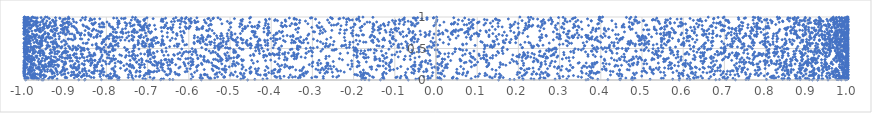
| Category | Series 0 |
|---|---|
| 0.15200554291350654 | 0 |
| -0.06729470641883747 | 0 |
| -0.457207894907006 | 0.001 |
| -0.16249678589111524 | 0.001 |
| -0.8527700189734067 | 0.001 |
| 0.9514669668381108 | 0.001 |
| 0.9134880477894776 | 0.001 |
| 0.9265163017025512 | 0.002 |
| -0.9956822485381334 | 0.002 |
| 0.36407005406179027 | 0.002 |
| 0.5902983247239353 | 0.002 |
| -0.5696850449446043 | 0.002 |
| -0.13486914578377363 | 0.003 |
| 0.9836824117989914 | 0.003 |
| -0.9552525360661354 | 0.003 |
| -0.8670972874772059 | 0.003 |
| 0.7267554239187516 | 0.003 |
| 0.4467624530858489 | 0.004 |
| 0.926587585128548 | 0.004 |
| -0.9566806299724488 | 0.004 |
| -0.9534150803421515 | 0.004 |
| 0.994329540349623 | 0.004 |
| 0.6789903417788856 | 0.005 |
| 0.976044050492543 | 0.005 |
| -0.6684093127094851 | 0.005 |
| -0.17243647579333232 | 0.005 |
| -0.812202762234995 | 0.005 |
| 0.9953782682390276 | 0.006 |
| 0.41713309477368044 | 0.006 |
| 0.973367425531701 | 0.006 |
| -0.9532398745212399 | 0.006 |
| -0.638567536494556 | 0.006 |
| 0.47718830438411675 | 0.007 |
| 0.9063104692916205 | 0.007 |
| 0.7523436664627461 | 0.007 |
| 0.8841233423088316 | 0.007 |
| 0.3689833570456053 | 0.007 |
| 0.8021992646769822 | 0.008 |
| 0.1899558450305855 | 0.008 |
| -0.7726503063247229 | 0.008 |
| 0.688052046204429 | 0.008 |
| -0.6463487301978702 | 0.008 |
| 0.7583651499772289 | 0.009 |
| -0.8515626191845961 | 0.009 |
| -0.7693314399857281 | 0.009 |
| 0.17927238001201656 | 0.009 |
| -0.18091652837159003 | 0.009 |
| 0.4767607671685933 | 0.01 |
| 0.21164829308590222 | 0.01 |
| 0.6164196356209262 | 0.01 |
| -0.43981105188865066 | 0.01 |
| -0.17349958479442149 | 0.01 |
| 0.9739553855503824 | 0.011 |
| 0.8417067337444467 | 0.011 |
| 0.39260704561174986 | 0.011 |
| 0.7049749452027674 | 0.011 |
| -0.7348397519038176 | 0.011 |
| 0.519681218191675 | 0.012 |
| 0.8582839120561189 | 0.012 |
| -0.01952415538513181 | 0.012 |
| -0.6875260524918024 | 0.012 |
| 0.4460547477197051 | 0.012 |
| 0.5744657663707007 | 0.013 |
| 0.9989707049015466 | 0.013 |
| 0.012505586525759253 | 0.013 |
| -0.9656287445153952 | 0.013 |
| 0.8577590364845594 | 0.013 |
| 0.4745384764904606 | 0.014 |
| 0.237883539134218 | 0.014 |
| -0.5945560326466847 | 0.014 |
| 0.28906759812849697 | 0.014 |
| -0.47379755829139836 | 0.014 |
| -0.420282766106121 | 0.015 |
| -0.0489888721854956 | 0.015 |
| -0.6663499840926943 | 0.015 |
| 0.980817108186996 | 0.015 |
| -0.9196999226275901 | 0.015 |
| -0.7052703570993165 | 0.016 |
| 0.8773446743058156 | 0.016 |
| 0.8537656608230865 | 0.016 |
| 0.7017771095955014 | 0.016 |
| -0.9646866245041967 | 0.016 |
| 0.6096549733429917 | 0.017 |
| 0.9927908912023397 | 0.017 |
| 0.9783927986566546 | 0.017 |
| -0.6614666187458014 | 0.017 |
| 0.4477940734845616 | 0.017 |
| 0.9389377133416301 | 0.018 |
| 0.3177598032660515 | 0.018 |
| 0.05154074463168796 | 0.018 |
| 0.2509742276300209 | 0.018 |
| -0.1264788760948081 | 0.018 |
| 0.9366700849924477 | 0.019 |
| -0.9403394818413594 | 0.019 |
| 0.6627235351862151 | 0.019 |
| 0.9940747553617163 | 0.019 |
| -0.9697481625498002 | 0.019 |
| 0.8981874868707405 | 0.02 |
| -0.9944582635667647 | 0.02 |
| -0.9778995356068275 | 0.02 |
| -0.5466504105362756 | 0.02 |
| 0.21070981335920916 | 0.02 |
| -0.042469812219032614 | 0.021 |
| -0.4099938201590565 | 0.021 |
| 0.23081644287241357 | 0.021 |
| 0.05019851648306504 | 0.021 |
| -0.5498718593116568 | 0.021 |
| 0.08539963563340248 | 0.022 |
| 0.839494049916666 | 0.022 |
| -0.9310702649036865 | 0.022 |
| -0.3772678541207172 | 0.022 |
| -0.9977352554488598 | 0.022 |
| 0.8447608608589396 | 0.023 |
| 0.9997401996471749 | 0.023 |
| -0.7114359825146417 | 0.023 |
| 0.9774827466976556 | 0.023 |
| -0.7893172746638099 | 0.023 |
| 0.9024401659278395 | 0.024 |
| 0.6264856888210802 | 0.024 |
| -0.7938193932467944 | 0.024 |
| -0.9753346244366259 | 0.024 |
| -0.2733692964261956 | 0.024 |
| 0.5913918603493773 | 0.025 |
| -0.01909160719645387 | 0.025 |
| 0.04000355691416215 | 0.025 |
| 0.8735798160067708 | 0.025 |
| 0.8965103087211107 | 0.025 |
| 0.9171234986518773 | 0.026 |
| 0.38013428353378076 | 0.026 |
| 0.8838862066301029 | 0.026 |
| 0.820447234335244 | 0.026 |
| 0.9904901917835967 | 0.026 |
| 0.5470219437786282 | 0.027 |
| 0.7209896343038159 | 0.027 |
| -0.46813466982067864 | 0.027 |
| 0.48259826748739476 | 0.027 |
| 0.9987958107081274 | 0.027 |
| -0.7876500442513381 | 0.028 |
| 0.3000711930845742 | 0.028 |
| 0.7589973713107336 | 0.028 |
| -0.5669741666103717 | 0.028 |
| 0.9817924067659626 | 0.028 |
| 0.9923958624850441 | 0.029 |
| 0.5517527594077928 | 0.029 |
| 0.26464821516489667 | 0.029 |
| -0.990271569611666 | 0.029 |
| 0.9560499169593414 | 0.029 |
| 0.999995290616038 | 0.03 |
| 0.9288263821255781 | 0.03 |
| 0.646763684074911 | 0.03 |
| -0.08683557155049913 | 0.03 |
| 0.007514187821513853 | 0.03 |
| 0.4608192533842199 | 0.031 |
| 0.009440279591735117 | 0.031 |
| -0.981885307109912 | 0.031 |
| 0.13658477507303166 | 0.031 |
| -0.9680449322410765 | 0.031 |
| -0.17075394007484615 | 0.032 |
| -0.9906759049416521 | 0.032 |
| -0.9808076918094027 | 0.032 |
| -0.013745064596319172 | 0.032 |
| -0.9897628876217685 | 0.032 |
| -0.5479261500261635 | 0.033 |
| 0.9904165313977236 | 0.033 |
| -0.5368766336459813 | 0.033 |
| 0.855535350528616 | 0.033 |
| -0.07114977440353441 | 0.033 |
| -0.8778382116814543 | 0.034 |
| -0.33429841034619817 | 0.034 |
| -0.6844107021421755 | 0.034 |
| 0.7553444835531498 | 0.034 |
| 0.8156401264155725 | 0.034 |
| 0.9995873305514806 | 0.035 |
| 0.2615329342568215 | 0.035 |
| -0.1297073342943431 | 0.035 |
| -0.3015156967961897 | 0.035 |
| 0.9860204818096939 | 0.035 |
| 0.039831710103254314 | 0.036 |
| 0.825022885472655 | 0.036 |
| 0.9959345563681103 | 0.036 |
| 0.008444380342214721 | 0.036 |
| -0.8961400581108921 | 0.036 |
| -0.5727866000112555 | 0.037 |
| 0.9497912454231978 | 0.037 |
| 0.0037221920611609223 | 0.037 |
| -0.7888718482164411 | 0.037 |
| 0.6250498462645815 | 0.037 |
| -0.1761192888328591 | 0.038 |
| 0.20178589647225514 | 0.038 |
| -0.8999774062146605 | 0.038 |
| 0.9936052757660404 | 0.038 |
| 0.16314236975189067 | 0.038 |
| 0.696307591907109 | 0.039 |
| -0.8304523700011781 | 0.039 |
| -0.17823800283327804 | 0.039 |
| -0.09717901977464624 | 0.039 |
| 0.15544600136109762 | 0.039 |
| 0.9692040633006136 | 0.04 |
| -0.9799758476792692 | 0.04 |
| -0.32963658117829264 | 0.04 |
| -0.7468144237129694 | 0.04 |
| 0.47642224336755695 | 0.04 |
| 0.25332043763107964 | 0.041 |
| 0.7081406799428411 | 0.041 |
| -0.35729111859728424 | 0.041 |
| -0.7692853893620255 | 0.041 |
| 0.6323955206902468 | 0.041 |
| 0.15356025933755202 | 0.042 |
| -0.8369282086158256 | 0.042 |
| -0.1517069528204616 | 0.042 |
| -0.9932727900169268 | 0.042 |
| -0.7375323011691443 | 0.042 |
| -0.9370754454055051 | 0.043 |
| -0.38628218106455 | 0.043 |
| -0.6940447274971672 | 0.043 |
| 0.3530984612708372 | 0.043 |
| 0.375201180033652 | 0.043 |
| 0.882950864524975 | 0.044 |
| -0.12752994132519133 | 0.044 |
| 0.6361994345702875 | 0.044 |
| -0.9291303658884452 | 0.044 |
| -0.9502462772000775 | 0.044 |
| -0.07159872386916356 | 0.045 |
| -0.2408612962908456 | 0.045 |
| -0.5152975120126371 | 0.045 |
| -0.3481507301175143 | 0.045 |
| 0.8116172776549053 | 0.045 |
| -0.513235844500652 | 0.046 |
| 0.04184616603785343 | 0.046 |
| 0.9999636777761698 | 0.046 |
| 0.9986662548244144 | 0.046 |
| -0.8988666861470648 | 0.046 |
| -0.46477693529315706 | 0.047 |
| -0.38860648129590375 | 0.047 |
| 0.1315808958574203 | 0.047 |
| -0.8605472347194846 | 0.047 |
| -0.9322234760082014 | 0.047 |
| -0.2892961469226578 | 0.048 |
| 0.9887644719647684 | 0.048 |
| 0.13030371351102982 | 0.048 |
| -0.9598430607328585 | 0.048 |
| 0.9840571701050298 | 0.048 |
| -0.09430699127895781 | 0.049 |
| 0.6993989647054774 | 0.049 |
| -0.15404826768985055 | 0.049 |
| 0.989906001182126 | 0.049 |
| 0.9285424581208492 | 0.049 |
| -0.5536414382694722 | 0.05 |
| -0.5301023882426361 | 0.05 |
| 0.9792577829487558 | 0.05 |
| -0.7912776669765876 | 0.05 |
| -0.7754830872495515 | 0.05 |
| 0.9954051495328374 | 0.051 |
| 0.813529896443113 | 0.051 |
| -0.9728723887340308 | 0.051 |
| 0.9858658266055774 | 0.051 |
| -0.5903067318735459 | 0.051 |
| -0.2932407017577964 | 0.052 |
| 0.9916573803177583 | 0.052 |
| 0.8315187661605866 | 0.052 |
| -0.34168216541745644 | 0.052 |
| 0.0955304911734684 | 0.052 |
| 0.985143473819114 | 0.053 |
| -0.5137538483603333 | 0.053 |
| 0.6136506294235653 | 0.053 |
| -0.7197686337404721 | 0.053 |
| 0.9714989492469824 | 0.053 |
| 0.3451227456873911 | 0.054 |
| -0.029822465491016557 | 0.054 |
| 0.666739520627784 | 0.054 |
| 0.9640563073393678 | 0.054 |
| -0.25029017441418866 | 0.054 |
| -0.8147929538459739 | 0.055 |
| 0.14292656960394026 | 0.055 |
| -0.3303565212064877 | 0.055 |
| -0.2735067385406875 | 0.055 |
| -0.9985438416385396 | 0.055 |
| -0.4823159021245709 | 0.056 |
| 0.8732292381506552 | 0.056 |
| 0.9918830957941455 | 0.056 |
| -0.8602740486774939 | 0.056 |
| -0.871314060899211 | 0.056 |
| 0.30819197148466293 | 0.057 |
| 0.8743513339397397 | 0.057 |
| -0.37910194188453966 | 0.057 |
| -0.9750258799323148 | 0.057 |
| -0.998979722403871 | 0.057 |
| -0.9824233196088272 | 0.058 |
| 0.761071534818674 | 0.058 |
| 0.10221716776215511 | 0.058 |
| -0.9727105781018953 | 0.058 |
| -0.019593936233441935 | 0.058 |
| -0.08499381266489192 | 0.059 |
| 0.32186782398357355 | 0.059 |
| 0.996817062798009 | 0.059 |
| -0.368881325183188 | 0.059 |
| -0.8702494641891024 | 0.059 |
| -0.7285178916340969 | 0.06 |
| -0.18303607617225306 | 0.06 |
| -0.391153575413294 | 0.06 |
| 0.8903219829473091 | 0.06 |
| 0.29906144569186577 | 0.06 |
| 0.4510699459938845 | 0.061 |
| 0.02038245913264294 | 0.061 |
| 0.9472857459235432 | 0.061 |
| -0.7958861615130816 | 0.061 |
| -0.8002146110352245 | 0.061 |
| 0.816076575828821 | 0.062 |
| 0.9162385313734118 | 0.062 |
| 0.6429700366009142 | 0.062 |
| -0.7831943026149888 | 0.062 |
| 0.7349401340391255 | 0.062 |
| 0.4993427640476728 | 0.063 |
| 0.20868458772589357 | 0.063 |
| 0.589651797478654 | 0.063 |
| 0.9872825900320957 | 0.063 |
| -0.9792733920506946 | 0.063 |
| -0.8735817308111709 | 0.064 |
| 0.27190247393661215 | 0.064 |
| -0.9470436711349711 | 0.064 |
| -0.9251010100190863 | 0.064 |
| -0.8414898381129964 | 0.064 |
| -0.8476395786414201 | 0.065 |
| -0.570592137479725 | 0.065 |
| -0.3205538614444382 | 0.065 |
| -0.23630578422560589 | 0.065 |
| 0.8198186265475367 | 0.065 |
| -0.9995502703727126 | 0.066 |
| -0.7083613039261053 | 0.066 |
| 0.7966081339129375 | 0.066 |
| -0.9750807036673955 | 0.066 |
| 0.07290380057626196 | 0.066 |
| -0.9607831689056601 | 0.067 |
| 0.4438319994355396 | 0.067 |
| 0.9979888110375198 | 0.067 |
| -0.009606686519030735 | 0.067 |
| 0.9060259572943348 | 0.067 |
| -0.774274686287651 | 0.068 |
| 0.8468634740076612 | 0.068 |
| 0.9765387152222564 | 0.068 |
| 0.9548945736137882 | 0.068 |
| 0.9999800632975381 | 0.068 |
| -0.776863971652107 | 0.069 |
| -0.7182884232896616 | 0.069 |
| -0.4688426909294744 | 0.069 |
| -0.16108536958919295 | 0.069 |
| 0.5892424782707807 | 0.069 |
| -0.8860656277596021 | 0.07 |
| 0.11864343189452409 | 0.07 |
| 0.5996871628764314 | 0.07 |
| 0.1575928579571168 | 0.07 |
| -0.8570220969852361 | 0.07 |
| 0.33364581160921336 | 0.071 |
| 0.7819476807583776 | 0.071 |
| 0.9289936091311981 | 0.071 |
| -0.9985903069104906 | 0.071 |
| -0.8677178477024161 | 0.071 |
| 0.9799308499581032 | 0.072 |
| 0.370598431015267 | 0.072 |
| -0.4127542634529316 | 0.072 |
| -0.73823160601569 | 0.072 |
| 0.9366298372453912 | 0.072 |
| 0.9085940259726202 | 0.073 |
| 0.8923242459183516 | 0.073 |
| 0.9117534475745115 | 0.073 |
| -0.17612835987145758 | 0.073 |
| 0.9733090774197437 | 0.073 |
| 0.5558208625125576 | 0.074 |
| -0.8537762998544086 | 0.074 |
| -0.32973850036516417 | 0.074 |
| 0.9722040141367632 | 0.074 |
| 0.9881321580997177 | 0.074 |
| -0.0747782523190453 | 0.075 |
| -0.999082151695842 | 0.075 |
| 0.7834076377906578 | 0.075 |
| -0.19021692491782577 | 0.075 |
| -0.9567314125336641 | 0.075 |
| -0.4996646226468618 | 0.076 |
| 0.8747094392750433 | 0.076 |
| 0.2707100450932198 | 0.076 |
| -0.7961418771324437 | 0.076 |
| -0.7075240282151682 | 0.076 |
| 0.6104880190362773 | 0.077 |
| -0.9531662317661262 | 0.077 |
| -0.9851144785820289 | 0.077 |
| -0.779825873760862 | 0.077 |
| -0.6242512499876961 | 0.077 |
| -0.6515613006162935 | 0.078 |
| 0.6289941445472835 | 0.078 |
| 0.1235347334798558 | 0.078 |
| 0.27448130451856906 | 0.078 |
| 0.21354153469655426 | 0.078 |
| -0.8071748086551663 | 0.079 |
| 0.8568350330356603 | 0.079 |
| -0.12919633075894077 | 0.079 |
| -0.4265157523725611 | 0.079 |
| -0.3536056643327415 | 0.079 |
| 0.6916741223133892 | 0.08 |
| -0.49198368912490625 | 0.08 |
| -0.9783505585230332 | 0.08 |
| 0.42349628938159206 | 0.08 |
| 0.7255804706419816 | 0.08 |
| -0.9087142765204478 | 0.081 |
| 0.9999993125662935 | 0.081 |
| 0.8712334052172768 | 0.081 |
| -0.5556378815186701 | 0.081 |
| -0.5709591997288698 | 0.081 |
| 0.9772622466731428 | 0.082 |
| 0.8406362422037144 | 0.082 |
| -0.883738888693354 | 0.082 |
| -0.9515784700531837 | 0.082 |
| -0.7463882312988026 | 0.082 |
| 0.4817954923062849 | 0.083 |
| -0.4164755037821291 | 0.083 |
| 0.9999925313332694 | 0.083 |
| 0.6747954682008176 | 0.083 |
| -0.1929261561104739 | 0.083 |
| -0.8767611966968388 | 0.084 |
| 0.7143330423439077 | 0.084 |
| 0.9999334792786507 | 0.084 |
| 0.9658438549822527 | 0.084 |
| -0.9970663013030775 | 0.084 |
| -0.18116024158593796 | 0.085 |
| -0.5623410242350688 | 0.085 |
| 0.9659625428596904 | 0.085 |
| 0.919565392108718 | 0.085 |
| 0.25232715406480705 | 0.085 |
| 0.4507338868424042 | 0.086 |
| -0.6230756266672847 | 0.086 |
| -0.4319385974889556 | 0.086 |
| 0.06438133544048895 | 0.086 |
| -0.6547980172339415 | 0.086 |
| -0.9629935568112706 | 0.087 |
| -0.5598091501082233 | 0.087 |
| -0.32457976442578385 | 0.087 |
| 0.9961609050488258 | 0.087 |
| -0.8702548690807884 | 0.087 |
| -0.19706086257729333 | 0.088 |
| 0.7744309212728546 | 0.088 |
| 0.19714377731920038 | 0.088 |
| 0.9971174249944807 | 0.088 |
| 0.21587759621000194 | 0.088 |
| -0.87990032719354 | 0.089 |
| -0.5617749549601522 | 0.089 |
| -0.5200087352889526 | 0.089 |
| -0.53605629078407 | 0.089 |
| -0.41251113128068834 | 0.089 |
| 0.7522003405411509 | 0.09 |
| 0.9901811405902565 | 0.09 |
| -0.1766372657042872 | 0.09 |
| -0.9787891877092243 | 0.09 |
| -0.9185839508568863 | 0.09 |
| -0.8161785871431491 | 0.091 |
| -0.5935914124314042 | 0.091 |
| 0.9145774237071655 | 0.091 |
| -0.627509133514206 | 0.091 |
| 0.8038703577057449 | 0.091 |
| 0.6750626232794807 | 0.092 |
| -0.8546651849478603 | 0.092 |
| 0.1454818192919588 | 0.092 |
| 0.763095117273583 | 0.092 |
| 0.014206122746725175 | 0.092 |
| 0.23298809798580053 | 0.093 |
| -0.9677926771455969 | 0.093 |
| 0.7048263390871231 | 0.093 |
| -0.9842762400655948 | 0.093 |
| -0.5330801057002608 | 0.093 |
| -0.696128282270287 | 0.094 |
| -0.9038491955133985 | 0.094 |
| 0.9574838973738187 | 0.094 |
| 0.2331906724322441 | 0.094 |
| 0.24334549251201307 | 0.094 |
| 0.9160230581674079 | 0.095 |
| -0.6315821086218336 | 0.095 |
| -0.9913842249534869 | 0.095 |
| 0.8431342766131519 | 0.095 |
| -0.9999929513104286 | 0.095 |
| -0.9720241831638156 | 0.096 |
| 0.1541947007517045 | 0.096 |
| 0.2708950425263061 | 0.096 |
| 0.7322145214585726 | 0.096 |
| 0.8978033393759274 | 0.096 |
| 0.43999561881501525 | 0.097 |
| -0.9996631025520747 | 0.097 |
| -0.9008708160604773 | 0.097 |
| 0.10566627949509405 | 0.097 |
| -0.7018619256203216 | 0.097 |
| 0.9910351891638693 | 0.098 |
| -0.47374195196723734 | 0.098 |
| 0.24453536639703302 | 0.098 |
| -0.12933664212904303 | 0.098 |
| -0.6461253641833897 | 0.098 |
| -0.7900802071854653 | 0.099 |
| 0.5948665723551356 | 0.099 |
| -0.17557576217851495 | 0.099 |
| 0.29490747150678637 | 0.099 |
| 0.38746355203198013 | 0.099 |
| -0.16471929200096347 | 0.1 |
| -0.8477058140761996 | 0.1 |
| 0.4461314481474594 | 0.1 |
| 0.5276268520546221 | 0.1 |
| -0.9313427201118116 | 0.1 |
| 0.8528792294441154 | 0.101 |
| -0.9995901304809907 | 0.101 |
| 0.9226780721640367 | 0.101 |
| -0.7807498305828439 | 0.101 |
| -0.16731708940352216 | 0.101 |
| 0.3648826097892715 | 0.102 |
| -0.32248628902571824 | 0.102 |
| 0.5987927498352328 | 0.102 |
| 0.5972720329240442 | 0.102 |
| -0.12074010012110739 | 0.102 |
| 0.056211595853009916 | 0.103 |
| -0.46578726103869483 | 0.103 |
| -0.3209076295496852 | 0.103 |
| 0.6239106090579823 | 0.103 |
| -0.39873191554264503 | 0.103 |
| 0.805310439201009 | 0.104 |
| 0.37409377438868546 | 0.104 |
| 0.26002974489150993 | 0.104 |
| 0.949208511755526 | 0.104 |
| 0.010270767530360521 | 0.104 |
| 0.05195372542019304 | 0.105 |
| -0.31526155309598597 | 0.105 |
| -0.053840532643819286 | 0.105 |
| 0.7883858630254181 | 0.105 |
| -0.8301100982496503 | 0.105 |
| 0.9619841344439007 | 0.106 |
| -0.2694269238471688 | 0.106 |
| 0.11943704309789187 | 0.106 |
| 0.6958655616990349 | 0.106 |
| -0.4504981351434188 | 0.106 |
| 0.8857542227347812 | 0.107 |
| 0.4791641629793495 | 0.107 |
| 0.8544132249960414 | 0.107 |
| -0.49675935333069454 | 0.107 |
| 0.8866833144160422 | 0.107 |
| -0.7039620440052591 | 0.108 |
| 0.5966313669059187 | 0.108 |
| -0.9603672767686251 | 0.108 |
| -0.43616421464853217 | 0.108 |
| -0.9265587864960504 | 0.108 |
| -0.864336488701309 | 0.109 |
| -0.8330074654461809 | 0.109 |
| -0.3939928542180877 | 0.109 |
| -0.9751841758770414 | 0.109 |
| -0.9898228456959115 | 0.109 |
| -0.4745923177770302 | 0.11 |
| 0.6193895958912731 | 0.11 |
| 0.07586059084124909 | 0.11 |
| 0.5898162073811104 | 0.11 |
| 0.995736531612083 | 0.11 |
| 0.005070732055159198 | 0.111 |
| 0.382779446095069 | 0.111 |
| 0.21835122530417062 | 0.111 |
| 0.7781555862582136 | 0.111 |
| -0.740959784788151 | 0.111 |
| -0.8926072303191953 | 0.112 |
| 0.9784488982042228 | 0.112 |
| 0.48649839919886323 | 0.112 |
| -0.17127906814581056 | 0.112 |
| 0.06622554505273807 | 0.112 |
| 0.9532644071968214 | 0.113 |
| 0.01205271911842901 | 0.113 |
| 0.3548944277737863 | 0.113 |
| 0.8539388847853441 | 0.113 |
| 0.6577061835395653 | 0.113 |
| 0.3899127571903628 | 0.114 |
| -0.5316614641556597 | 0.114 |
| 0.9374488376549801 | 0.114 |
| -0.8121844533669196 | 0.114 |
| -0.6988435284405575 | 0.114 |
| 0.9895468525683838 | 0.115 |
| -0.17540223859254123 | 0.115 |
| 0.5113405963561651 | 0.115 |
| -0.9292995593063901 | 0.115 |
| 0.8272344948516098 | 0.115 |
| 0.9977526229374029 | 0.116 |
| 0.20326825703662915 | 0.116 |
| 0.999504316934493 | 0.116 |
| 0.9875578405375403 | 0.116 |
| -0.05875891666099174 | 0.116 |
| -0.9121357123770274 | 0.117 |
| -0.2816142791234976 | 0.117 |
| -0.40595849439420234 | 0.117 |
| -0.0734620715952091 | 0.117 |
| 0.7508709103063206 | 0.117 |
| -0.007764354604507592 | 0.118 |
| 0.9939802034982864 | 0.118 |
| 0.3763927045836738 | 0.118 |
| -0.45091813793673136 | 0.118 |
| 0.8616369910613839 | 0.118 |
| 0.9698182509494483 | 0.119 |
| 0.917404441767918 | 0.119 |
| 0.57512741578149 | 0.119 |
| 0.5531529485842672 | 0.119 |
| 0.8779042201772065 | 0.119 |
| 0.6301315185137388 | 0.12 |
| -0.8359266402729303 | 0.12 |
| -0.9864399764729587 | 0.12 |
| 0.22031620068896549 | 0.12 |
| -0.9311674371738974 | 0.12 |
| 0.19828770305195909 | 0.121 |
| -0.18333180163133694 | 0.121 |
| 0.04999149753037228 | 0.121 |
| -0.5857999665368839 | 0.121 |
| -0.5253517680656843 | 0.121 |
| -0.6335101648389785 | 0.122 |
| 0.39540920433294846 | 0.122 |
| -0.12604574400652846 | 0.122 |
| -0.8322214802889819 | 0.122 |
| 0.6481809625961988 | 0.122 |
| -0.2631765642036307 | 0.123 |
| -0.9999343830367574 | 0.123 |
| -0.8655987589079299 | 0.123 |
| 0.5241356089861754 | 0.123 |
| -0.2516435227299641 | 0.123 |
| 0.26586655798648123 | 0.124 |
| -0.5108304864528274 | 0.124 |
| 0.25586320838023013 | 0.124 |
| -0.9991591622885619 | 0.124 |
| -0.728240936173308 | 0.124 |
| -0.18360322844121743 | 0.125 |
| 0.5449741279326391 | 0.125 |
| -0.22272923370839387 | 0.125 |
| -0.8842771185610253 | 0.125 |
| 0.9642167065336659 | 0.125 |
| -0.999896161776765 | 0.126 |
| 0.9074541924283668 | 0.126 |
| -0.6865051337749445 | 0.126 |
| -0.8055355790882134 | 0.126 |
| -0.8792885787731178 | 0.126 |
| -0.38394255919964926 | 0.127 |
| 0.3923328283563205 | 0.127 |
| 0.6648106476926616 | 0.127 |
| -0.44844864565198117 | 0.127 |
| 0.6213722375254517 | 0.127 |
| 0.7419221868059753 | 0.128 |
| -0.693931050859834 | 0.128 |
| -0.3161333504646908 | 0.128 |
| 0.8831825875070396 | 0.128 |
| -0.4871303735492991 | 0.128 |
| -0.9585920493995753 | 0.129 |
| 0.9997332021512092 | 0.129 |
| 0.974760051288472 | 0.129 |
| 0.07700075731502798 | 0.129 |
| -0.9816210786479778 | 0.129 |
| -0.3119014473305545 | 0.13 |
| -0.7791038894869172 | 0.13 |
| -0.9986128451232724 | 0.13 |
| -0.45085712870481004 | 0.13 |
| -0.691928184420031 | 0.13 |
| -0.9199550845933732 | 0.131 |
| -0.7191622726855984 | 0.131 |
| -0.7183959789188665 | 0.131 |
| -0.6087489756131284 | 0.131 |
| -0.9095380268603496 | 0.131 |
| -0.3801962267956301 | 0.132 |
| -0.02990469371800099 | 0.132 |
| 0.23719931450298562 | 0.132 |
| -0.9572700174734652 | 0.132 |
| 0.9115292807417448 | 0.132 |
| -0.6587769181284743 | 0.133 |
| -0.7430113571771896 | 0.133 |
| -0.9999889590791263 | 0.133 |
| 0.9999403702594736 | 0.133 |
| 0.42966768345997 | 0.133 |
| -0.6774420574889818 | 0.134 |
| -0.6436204186465908 | 0.134 |
| 0.6978335069078397 | 0.134 |
| 0.3732023969668722 | 0.134 |
| 0.9613418952394274 | 0.134 |
| 0.9973407468529657 | 0.135 |
| -0.265672325639758 | 0.135 |
| 0.508019272920948 | 0.135 |
| 0.970770255159919 | 0.135 |
| 0.7140578797830235 | 0.135 |
| -0.8497825911789766 | 0.136 |
| -0.9433140221243175 | 0.136 |
| 0.8611862769268123 | 0.136 |
| -0.0235369205481259 | 0.136 |
| -0.6042189516393949 | 0.136 |
| 0.49992759894552447 | 0.137 |
| -0.7187480781572783 | 0.137 |
| -0.8289011742436361 | 0.137 |
| -0.9200786112847822 | 0.137 |
| -0.04177397182704788 | 0.137 |
| -0.8112134521430183 | 0.138 |
| 0.6688048709500105 | 0.138 |
| -0.6832462475258405 | 0.138 |
| 0.4233994226027002 | 0.138 |
| -0.9314724227747986 | 0.138 |
| 0.35281580209055957 | 0.139 |
| -0.8586161945062235 | 0.139 |
| -0.6953595744681424 | 0.139 |
| -0.9490919732058307 | 0.139 |
| 0.6773522456340532 | 0.139 |
| 0.7075097203498415 | 0.14 |
| 0.9969308084970426 | 0.14 |
| 0.9895801662331574 | 0.14 |
| 0.9406371836960613 | 0.14 |
| 0.853222926662725 | 0.14 |
| -0.4357714448326787 | 0.141 |
| -0.9080644844849562 | 0.141 |
| -0.9999488325459668 | 0.141 |
| -0.998689037465923 | 0.141 |
| -0.9362663222190525 | 0.141 |
| -0.8156174764972797 | 0.142 |
| -0.39832623495470165 | 0.142 |
| -0.988510746049836 | 0.142 |
| -0.2383125016985921 | 0.142 |
| 0.8950779320753817 | 0.142 |
| -0.05152858022179746 | 0.143 |
| 0.9712997435537004 | 0.143 |
| 0.7309847829533244 | 0.143 |
| -0.901206659427746 | 0.143 |
| -0.743247629972312 | 0.143 |
| -0.696832326102722 | 0.144 |
| 0.3215704939009859 | 0.144 |
| -0.231534414273964 | 0.144 |
| 0.3778568076281953 | 0.144 |
| 0.5844869519328366 | 0.144 |
| 0.7215692747487084 | 0.145 |
| -0.02168277708544574 | 0.145 |
| -0.8220415759119347 | 0.145 |
| 0.8961541995322099 | 0.145 |
| 0.9300245113770391 | 0.145 |
| 0.9980265765072999 | 0.146 |
| -0.9809518408838459 | 0.146 |
| -0.43340078329480036 | 0.146 |
| -0.6978082703945245 | 0.146 |
| 0.6900523227585309 | 0.146 |
| 0.9937434526089296 | 0.147 |
| 0.01687073447718537 | 0.147 |
| -0.9975905694066957 | 0.147 |
| -0.7263326307567016 | 0.147 |
| -0.8420293064690113 | 0.147 |
| 0.5055572256143499 | 0.148 |
| -0.9998836638993834 | 0.148 |
| -0.32611237291575446 | 0.148 |
| 0.9762061977164852 | 0.148 |
| 0.8466831958959131 | 0.148 |
| 0.9990125636282222 | 0.149 |
| 0.7186486760964899 | 0.149 |
| 0.6831951876214162 | 0.149 |
| -0.5800801500471113 | 0.149 |
| -0.6722583419831204 | 0.149 |
| 0.6011403291368737 | 0.15 |
| -0.7817326834219005 | 0.15 |
| -0.9852442175533161 | 0.15 |
| -0.5409414909582946 | 0.15 |
| 0.9979282077789665 | 0.15 |
| 0.9672449133488962 | 0.151 |
| -0.4147786969792971 | 0.151 |
| -0.33041382923512946 | 0.151 |
| 0.9747411176200381 | 0.151 |
| -0.7540893925396579 | 0.151 |
| -0.9749033480714273 | 0.152 |
| 0.9152244830221392 | 0.152 |
| 0.44523778589193835 | 0.152 |
| -0.38140768200825825 | 0.152 |
| -0.1118557014332514 | 0.152 |
| 0.7748125409668026 | 0.153 |
| -0.11257222225127407 | 0.153 |
| 0.3248928322623353 | 0.153 |
| -0.958351882349448 | 0.153 |
| -0.6441882316104058 | 0.153 |
| 0.2146735832029177 | 0.154 |
| 0.8537769242945675 | 0.154 |
| -0.5141953619757924 | 0.154 |
| 0.4129848443465836 | 0.154 |
| 0.14566373688453946 | 0.154 |
| -0.9841131621907009 | 0.155 |
| -0.4613569725354441 | 0.155 |
| -0.984539647625937 | 0.155 |
| 0.7816685506866332 | 0.155 |
| -0.9880609499136808 | 0.155 |
| 0.8837764605319973 | 0.156 |
| -0.986388817736277 | 0.156 |
| 0.525979824666584 | 0.156 |
| -0.852685702626393 | 0.156 |
| 0.9850035301222413 | 0.156 |
| -0.9780250032536891 | 0.157 |
| 0.8245564689563217 | 0.157 |
| 0.9291754825479902 | 0.157 |
| -0.8284493130308728 | 0.157 |
| 0.7442854503316376 | 0.157 |
| 0.3032705367556713 | 0.158 |
| -0.17628557474217388 | 0.158 |
| -0.2861687278551995 | 0.158 |
| 0.8544208252452098 | 0.158 |
| -0.6635713109601075 | 0.158 |
| 0.9998099508146268 | 0.159 |
| -0.3933181167988689 | 0.159 |
| -0.2799249200950284 | 0.159 |
| 0.3035412523851955 | 0.159 |
| -0.053316893385814634 | 0.159 |
| 0.4688462597729867 | 0.16 |
| 0.5234156532198435 | 0.16 |
| -0.8726411510867085 | 0.16 |
| -0.34039405828129815 | 0.16 |
| 0.8514612727708899 | 0.16 |
| -0.9061124995642474 | 0.161 |
| 0.8404355743916335 | 0.161 |
| -0.9621798097652496 | 0.161 |
| 0.004325382085794387 | 0.161 |
| -0.2725024095087304 | 0.161 |
| -0.900171797818135 | 0.162 |
| 0.44568688461957073 | 0.162 |
| -0.9994782764054323 | 0.162 |
| 0.8675748140773186 | 0.162 |
| 0.9494862969779738 | 0.162 |
| 0.9179099097030817 | 0.163 |
| 0.9983311574424983 | 0.163 |
| -0.14453303774860718 | 0.163 |
| -0.9345708023371476 | 0.163 |
| 0.8861720134112042 | 0.163 |
| 0.89931946010283 | 0.164 |
| -0.9225934509225424 | 0.164 |
| -0.11071846790033825 | 0.164 |
| -0.8089903074289283 | 0.164 |
| -0.5092773505355105 | 0.164 |
| 0.9923607359610476 | 0.165 |
| -0.10300435795444866 | 0.165 |
| 0.5398179312821829 | 0.165 |
| -0.9888909234405212 | 0.165 |
| 0.4643235566533005 | 0.165 |
| -0.562486912629507 | 0.166 |
| 0.5282152024068791 | 0.166 |
| -0.8695353632813203 | 0.166 |
| 0.990508518686053 | 0.166 |
| 0.9474853173701173 | 0.166 |
| -0.9877351807610866 | 0.167 |
| 0.9996901756833992 | 0.167 |
| 0.9374290583511427 | 0.167 |
| -0.39052577383761067 | 0.167 |
| -0.9509054863054461 | 0.167 |
| 0.742900165832919 | 0.168 |
| 0.9998823856386865 | 0.168 |
| -0.37803414875970637 | 0.168 |
| 0.862656476443971 | 0.168 |
| -0.9427442840352075 | 0.168 |
| 0.13636003928756815 | 0.169 |
| -0.999304149336043 | 0.169 |
| 0.7562859747261631 | 0.169 |
| 0.6710412393773214 | 0.169 |
| 0.7859073254880706 | 0.169 |
| 0.05073264558082375 | 0.17 |
| 0.4034117822704167 | 0.17 |
| 0.6398651071729611 | 0.17 |
| -0.039781686576822135 | 0.17 |
| 0.9996635464223323 | 0.17 |
| 0.24990542822048223 | 0.171 |
| -0.5188613243806333 | 0.171 |
| -0.241622776683234 | 0.171 |
| 0.8974463231212013 | 0.171 |
| -0.8958403407488139 | 0.171 |
| -0.023447577571800878 | 0.172 |
| -0.7502963089808984 | 0.172 |
| -0.8576942882352664 | 0.172 |
| -0.1564161828788407 | 0.172 |
| 0.7300857758812942 | 0.172 |
| -0.9531088733370922 | 0.173 |
| 0.9715406982297017 | 0.173 |
| -0.2913187417023805 | 0.173 |
| -0.20806811239140705 | 0.173 |
| 0.4100048637567286 | 0.173 |
| 0.31688464388075654 | 0.174 |
| -0.6448160989211447 | 0.174 |
| -0.05576309939426028 | 0.174 |
| -0.0686712928397669 | 0.174 |
| 0.41294006997612975 | 0.174 |
| 0.8294925389789755 | 0.175 |
| -0.2540118412825352 | 0.175 |
| -0.5434615833451404 | 0.175 |
| -0.47103504168668836 | 0.175 |
| 0.06693893513362281 | 0.175 |
| 0.22094605580376683 | 0.176 |
| -0.9857798799365761 | 0.176 |
| -0.786873874038636 | 0.176 |
| 0.970339051549954 | 0.176 |
| -0.43852471318590747 | 0.176 |
| -0.04226478765891742 | 0.177 |
| 0.9263358651155972 | 0.177 |
| -0.9041005712243068 | 0.177 |
| 0.9868695839957501 | 0.177 |
| -0.2611876047447645 | 0.177 |
| -0.9979531035021778 | 0.178 |
| 0.8828243210569222 | 0.178 |
| 0.7328639722134217 | 0.178 |
| 0.6177621353319463 | 0.178 |
| -0.9994528898306207 | 0.178 |
| 0.8812784765521288 | 0.179 |
| 0.9850056420087893 | 0.179 |
| -0.5964012409439052 | 0.179 |
| 0.9714266849819119 | 0.179 |
| 0.225635939792563 | 0.179 |
| 0.27070779683866436 | 0.18 |
| -0.6047359639964813 | 0.18 |
| -0.5138552378915028 | 0.18 |
| 0.20750154407091104 | 0.18 |
| 0.22583086538232958 | 0.18 |
| 0.5706894340848729 | 0.181 |
| -0.3234458393156258 | 0.181 |
| -0.12168118150209548 | 0.181 |
| 0.7988212177672898 | 0.181 |
| 0.5643025562505888 | 0.181 |
| 0.5193503449467118 | 0.182 |
| -0.6496321908797483 | 0.182 |
| -0.5270522624922824 | 0.182 |
| -0.4523198835500896 | 0.182 |
| -0.9230064482833276 | 0.182 |
| -0.8081239302492531 | 0.183 |
| 0.954170877861055 | 0.183 |
| -0.4307306395358553 | 0.183 |
| -0.09374610212901154 | 0.183 |
| 0.7426125558190517 | 0.183 |
| -0.8524968153911302 | 0.184 |
| -0.783543280859647 | 0.184 |
| 0.20544576743826712 | 0.184 |
| 0.2945538639094297 | 0.184 |
| 0.9609453782602307 | 0.184 |
| 0.6514462700990113 | 0.185 |
| 0.005637489087085259 | 0.185 |
| 0.917413386060247 | 0.185 |
| 0.5037388143815296 | 0.185 |
| -0.9999506218546321 | 0.185 |
| -0.676098366640503 | 0.186 |
| -0.966915840106801 | 0.186 |
| -0.9954396729379301 | 0.186 |
| -0.965285635882863 | 0.186 |
| -0.7657379421286362 | 0.186 |
| -0.3554771362712493 | 0.187 |
| 0.6213589224384142 | 0.187 |
| 0.5720393274567726 | 0.187 |
| -0.9702772575142563 | 0.187 |
| -0.9987787027849421 | 0.187 |
| 0.7448703031692955 | 0.188 |
| -0.9520215332888711 | 0.188 |
| 0.8859872646476583 | 0.188 |
| -0.26777893838879346 | 0.188 |
| -0.8821548462346175 | 0.188 |
| -0.9986210913676974 | 0.189 |
| 0.5345720889738464 | 0.189 |
| -0.9989912805529206 | 0.189 |
| -0.27604800821070513 | 0.189 |
| -0.40781807290677136 | 0.189 |
| 0.235561888431525 | 0.19 |
| 0.9288267142140726 | 0.19 |
| -0.7333750478020141 | 0.19 |
| -0.6242316328139743 | 0.19 |
| -0.873121478191789 | 0.19 |
| -0.8785875600667538 | 0.191 |
| -0.8734873226698883 | 0.191 |
| 0.842898067870057 | 0.191 |
| -0.8667240254119474 | 0.191 |
| 0.9868635250896055 | 0.191 |
| -0.962492194624209 | 0.192 |
| 0.9846034756160523 | 0.192 |
| 0.5717218913317711 | 0.192 |
| 0.5549472612222 | 0.192 |
| -0.9816301990974396 | 0.192 |
| 0.9886161633264339 | 0.193 |
| 0.021098781435157466 | 0.193 |
| 0.35420171098965847 | 0.193 |
| 0.6840749932909705 | 0.193 |
| -0.829085751804335 | 0.193 |
| -0.009480642905621029 | 0.194 |
| 0.9398913655723328 | 0.194 |
| 0.9810374041759222 | 0.194 |
| 0.027138315656602498 | 0.194 |
| 0.850410631079194 | 0.194 |
| -0.9788137848015946 | 0.195 |
| 0.8900869024461635 | 0.195 |
| 0.6320535321784524 | 0.195 |
| -0.6641039140908126 | 0.195 |
| -0.9847744892198287 | 0.195 |
| 0.9998399911683374 | 0.196 |
| -0.3562591895625615 | 0.196 |
| 0.7282779040356592 | 0.196 |
| -0.9044137243814147 | 0.196 |
| 0.33109687663318405 | 0.196 |
| -0.5309658262313646 | 0.197 |
| -0.00023205511105970343 | 0.197 |
| 0.004352190164153017 | 0.197 |
| 0.7484182581912877 | 0.197 |
| 0.991150055611394 | 0.197 |
| 0.2983629451465 | 0.198 |
| 0.5420365394525092 | 0.198 |
| 0.946742476864419 | 0.198 |
| -0.718905345926719 | 0.198 |
| -0.5316458458090906 | 0.198 |
| -0.7188183591857741 | 0.199 |
| 0.3767918135910846 | 0.199 |
| 0.36639491724748985 | 0.199 |
| 0.6666450252464263 | 0.199 |
| 0.9972036828703003 | 0.199 |
| -0.7072025545089715 | 0.2 |
| 0.6480366736134359 | 0.2 |
| -0.9999771711409767 | 0.2 |
| -0.7341836329300797 | 0.2 |
| -0.8763342111457753 | 0.2 |
| 0.33260264200526696 | 0.201 |
| 0.998936026229491 | 0.201 |
| -0.3527213753817552 | 0.201 |
| -0.9501458141014046 | 0.201 |
| 0.947972591358834 | 0.201 |
| 0.6889714633338029 | 0.202 |
| -0.7387317657444622 | 0.202 |
| -0.32128025003027477 | 0.202 |
| 0.7839868015184657 | 0.202 |
| 0.9984362760258528 | 0.202 |
| 0.15406031160505068 | 0.203 |
| -0.4496375404397828 | 0.203 |
| -0.5810047012086887 | 0.203 |
| -0.35430830557221543 | 0.203 |
| -0.9919099795375854 | 0.203 |
| 0.8341610907354193 | 0.204 |
| 0.9961826469763085 | 0.204 |
| -0.9635155777130499 | 0.204 |
| 0.9421922240543744 | 0.204 |
| 0.9805875923712752 | 0.204 |
| -0.36747981893796444 | 0.205 |
| -0.8276015141703209 | 0.205 |
| -0.16008758610005275 | 0.205 |
| 0.5195221239832972 | 0.205 |
| -0.9052819895328111 | 0.205 |
| 0.9993020754762507 | 0.206 |
| -0.667788228836391 | 0.206 |
| -0.8793787797860396 | 0.206 |
| 0.629261243871904 | 0.206 |
| -0.003350427006342512 | 0.206 |
| -0.3477484807877504 | 0.207 |
| -0.46799747950218656 | 0.207 |
| -0.03587491270336742 | 0.207 |
| -0.8237714889446427 | 0.207 |
| -0.621055252017031 | 0.207 |
| 0.381587992042933 | 0.208 |
| 0.7809743054641165 | 0.208 |
| 0.986191409204079 | 0.208 |
| -0.15632314394999844 | 0.208 |
| -0.9287021686712411 | 0.208 |
| -0.9647119416420624 | 0.209 |
| 0.28747196525957225 | 0.209 |
| 0.6616866268824784 | 0.209 |
| -0.5019292383944632 | 0.209 |
| 0.08588487598026427 | 0.209 |
| -0.19138255201758458 | 0.21 |
| -0.9847502466443541 | 0.21 |
| -0.11250244903145522 | 0.21 |
| 0.25349584133119707 | 0.21 |
| -0.9981843660973749 | 0.21 |
| -0.8862206174587263 | 0.211 |
| -0.05967696508088221 | 0.211 |
| 0.6174791025387928 | 0.211 |
| -0.9836943326930464 | 0.211 |
| 0.12337939414946997 | 0.211 |
| 0.2974224187245177 | 0.212 |
| -0.5350193672067496 | 0.212 |
| -0.9456136938332649 | 0.212 |
| -0.9559917646266067 | 0.212 |
| 0.9940585477878628 | 0.212 |
| 0.912686735139828 | 0.213 |
| -0.41127170779713956 | 0.213 |
| -0.9983345649388278 | 0.213 |
| -0.5344274608484193 | 0.213 |
| -0.08535399375012867 | 0.213 |
| 0.40797887327060034 | 0.214 |
| -0.24817209052303063 | 0.214 |
| 0.0602067995198587 | 0.214 |
| 0.9542766244815886 | 0.214 |
| -0.2677803109735502 | 0.214 |
| -0.939776435225388 | 0.215 |
| -0.7788697832240478 | 0.215 |
| 0.9791823788739306 | 0.215 |
| -0.9169730764336997 | 0.215 |
| 0.6052657958206188 | 0.215 |
| 0.9975249868429497 | 0.216 |
| 0.9990123538763512 | 0.216 |
| -0.9458326470583185 | 0.216 |
| -0.8678048568028628 | 0.216 |
| -0.20382120214077382 | 0.216 |
| 0.6730611484742344 | 0.217 |
| -0.30010690295451886 | 0.217 |
| 0.7369265686912493 | 0.217 |
| 0.37238523345748753 | 0.217 |
| 0.4340604983071124 | 0.217 |
| -0.9346307714509173 | 0.218 |
| 0.845397132752174 | 0.218 |
| 0.30596651225626426 | 0.218 |
| 0.02444522274433313 | 0.218 |
| 0.8513680940133842 | 0.218 |
| 0.3607713775189273 | 0.219 |
| 0.953518668440525 | 0.219 |
| -0.3799751492372966 | 0.219 |
| -0.5803258777576831 | 0.219 |
| -0.7443005960963612 | 0.219 |
| -0.2566484594458605 | 0.22 |
| -0.3616169984391811 | 0.22 |
| -0.9992518028038221 | 0.22 |
| -0.5113540039891435 | 0.22 |
| 0.4709800232606103 | 0.22 |
| 0.12537153755383892 | 0.221 |
| 0.6905254796127813 | 0.221 |
| -0.9997309758128897 | 0.221 |
| -0.051480762193332585 | 0.221 |
| 0.3578066728037838 | 0.221 |
| -0.18996484550786008 | 0.222 |
| 0.8440564708214968 | 0.222 |
| -0.9972571968928784 | 0.222 |
| -0.05095650891765565 | 0.222 |
| -0.1363022836765506 | 0.222 |
| 0.014063902836048655 | 0.223 |
| 0.5883785611609791 | 0.223 |
| -0.49432876529313874 | 0.223 |
| -0.12802589386262989 | 0.223 |
| 0.8366268826923712 | 0.223 |
| -0.608753984099832 | 0.224 |
| 0.9456895853339793 | 0.224 |
| -0.13955344223802035 | 0.224 |
| 0.999991468735193 | 0.224 |
| 0.4413451380823835 | 0.224 |
| -0.5388871175921633 | 0.225 |
| 0.995292317118397 | 0.225 |
| 0.8623223826221766 | 0.225 |
| 0.9971515378094199 | 0.225 |
| 0.2761824226603593 | 0.225 |
| 0.8824993947914473 | 0.226 |
| -0.8243498618069672 | 0.226 |
| -0.14131548191109564 | 0.226 |
| -0.2631816324249905 | 0.226 |
| 0.9363859245948253 | 0.226 |
| 0.9997844330337486 | 0.227 |
| -0.48665072267740955 | 0.227 |
| 0.6051461512452406 | 0.227 |
| -0.9517298153818953 | 0.227 |
| -0.18637087199776123 | 0.227 |
| 0.9124835625308709 | 0.228 |
| -0.7576597740392146 | 0.228 |
| -0.8863857503803675 | 0.228 |
| -0.6767336757061193 | 0.228 |
| -0.9397525962482604 | 0.228 |
| 0.5644472023993885 | 0.229 |
| -0.8111241558387239 | 0.229 |
| 0.9997470836441036 | 0.229 |
| -0.7429106419610835 | 0.229 |
| -0.5945479602710793 | 0.229 |
| 0.9023232725660851 | 0.23 |
| -0.7365506394980808 | 0.23 |
| -0.8285674805617909 | 0.23 |
| 0.9931357918387571 | 0.23 |
| -0.9712751718051083 | 0.23 |
| -0.5417058399214288 | 0.231 |
| 0.5793467678212916 | 0.231 |
| -0.9764916197718831 | 0.231 |
| -0.8383047602481672 | 0.231 |
| 0.8861012211259088 | 0.231 |
| -0.6506327198472255 | 0.232 |
| -0.6828289119001132 | 0.232 |
| 0.8081361489945103 | 0.232 |
| 0.21235791663280312 | 0.232 |
| -0.7451342519245687 | 0.232 |
| 0.09275544957149727 | 0.233 |
| -0.1145001939303087 | 0.233 |
| -0.5771226006371346 | 0.233 |
| -0.37436654660701907 | 0.233 |
| 0.45021609292873505 | 0.233 |
| -0.9161675626188058 | 0.234 |
| 0.4363948770395141 | 0.234 |
| -0.05477635988383078 | 0.234 |
| 0.16960752708266197 | 0.234 |
| 0.8577931505305427 | 0.234 |
| 0.7244555484986737 | 0.235 |
| -0.9999865493525216 | 0.235 |
| -0.9565541400188472 | 0.235 |
| -0.03601360721821974 | 0.235 |
| -0.2862040190569143 | 0.235 |
| 0.9029354954121417 | 0.236 |
| 0.3262703948961798 | 0.236 |
| -0.8282843931896035 | 0.236 |
| 0.9946834465016079 | 0.236 |
| 0.6153330728944219 | 0.236 |
| 0.6899387416185342 | 0.237 |
| 0.9983379423993278 | 0.237 |
| -0.6868292626298577 | 0.237 |
| -0.9253463497038831 | 0.237 |
| -0.9357048740379624 | 0.237 |
| 0.47805303350462564 | 0.238 |
| -0.854273989785701 | 0.238 |
| -0.03971453246925073 | 0.238 |
| -0.8662021293085996 | 0.238 |
| -0.7166235711109279 | 0.238 |
| 0.379659060926113 | 0.239 |
| 0.9989866710024765 | 0.239 |
| 0.9022203903961857 | 0.239 |
| 0.02369993708565709 | 0.239 |
| -0.47081047543171395 | 0.239 |
| -0.21363747966971683 | 0.24 |
| -0.7144218607963447 | 0.24 |
| 0.09634775205465824 | 0.24 |
| 0.2555804668038143 | 0.24 |
| -0.8790772160761242 | 0.24 |
| 0.568934761371211 | 0.241 |
| -0.9193046525909127 | 0.241 |
| -0.6463510582111274 | 0.241 |
| 0.12792838404278872 | 0.241 |
| 0.6768772890103774 | 0.241 |
| 0.799209048012209 | 0.242 |
| -0.999651221387513 | 0.242 |
| -0.9025544047487035 | 0.242 |
| 0.8909805628169117 | 0.242 |
| -0.9793051056949938 | 0.242 |
| -0.9985455757255757 | 0.243 |
| -0.6666220586961069 | 0.243 |
| 0.00812792728244907 | 0.243 |
| 0.7702942739291608 | 0.243 |
| -0.6317576924251598 | 0.243 |
| -0.3075694222786445 | 0.244 |
| -0.05106681337099841 | 0.244 |
| 0.5991702281779089 | 0.244 |
| -0.3663144814355549 | 0.244 |
| 0.9795896350519828 | 0.244 |
| -0.6628549308099416 | 0.245 |
| 0.985174201661539 | 0.245 |
| -0.5898729026856975 | 0.245 |
| -0.9942668986676768 | 0.245 |
| 0.9894856166360909 | 0.245 |
| 0.7695667504985559 | 0.246 |
| 0.4884357593092478 | 0.246 |
| -0.567714096299435 | 0.246 |
| -0.26296202002483204 | 0.246 |
| -0.7080053994458988 | 0.246 |
| 0.1569755255340433 | 0.247 |
| 0.46758526782224774 | 0.247 |
| 0.8254129118798 | 0.247 |
| 0.16265879815317796 | 0.247 |
| -0.688240252915396 | 0.247 |
| 0.9629921261320712 | 0.248 |
| 0.9999204749921033 | 0.248 |
| -0.7207144351500845 | 0.248 |
| -0.01191922338493761 | 0.248 |
| -0.9314561767601202 | 0.248 |
| -0.7422036525743523 | 0.249 |
| -0.5916570594533227 | 0.249 |
| -0.8536626179809763 | 0.249 |
| 0.6045713126015984 | 0.249 |
| -0.9479698750157874 | 0.249 |
| 0.9425044844510259 | 0.25 |
| 0.3853953328169521 | 0.25 |
| 0.9020018390255661 | 0.25 |
| 0.7477681988919754 | 0.25 |
| -0.38420849367039955 | 0.25 |
| -0.8216073621973288 | 0.251 |
| 0.8928904593279395 | 0.251 |
| -0.9634889642114823 | 0.251 |
| 0.2660896459173286 | 0.251 |
| 0.4208373910327044 | 0.251 |
| -0.6102640140233379 | 0.252 |
| 0.027903848262768073 | 0.252 |
| 0.8617391701139246 | 0.252 |
| -0.6615918706258643 | 0.252 |
| 0.7785416113982304 | 0.252 |
| -0.9393087032989065 | 0.253 |
| -0.9828272690893755 | 0.253 |
| 0.8332538163410859 | 0.253 |
| -0.48932988046424297 | 0.253 |
| -0.961497953060933 | 0.253 |
| -0.7505650887035452 | 0.254 |
| 0.8715239030758934 | 0.254 |
| 0.8504773774783807 | 0.254 |
| -0.8004615062064082 | 0.254 |
| -0.9920768477935801 | 0.254 |
| -0.981713930941451 | 0.255 |
| -0.9972617599742559 | 0.255 |
| 0.9484419000213702 | 0.255 |
| -0.49352915722914736 | 0.255 |
| -0.479524603200313 | 0.255 |
| -0.2039484335746857 | 0.256 |
| 0.504462242912291 | 0.256 |
| 0.47607577691163394 | 0.256 |
| -0.5199546243227886 | 0.256 |
| 0.5116373696319932 | 0.256 |
| 0.41299418610468175 | 0.257 |
| -0.9769361092423368 | 0.257 |
| 0.6004308957064234 | 0.257 |
| 0.7819014760865375 | 0.257 |
| -0.9018458647464739 | 0.257 |
| 0.6111120820829448 | 0.258 |
| -0.899029606482495 | 0.258 |
| 0.9473812025906223 | 0.258 |
| -0.12077506902688924 | 0.258 |
| -0.7932556984314265 | 0.258 |
| 0.8259360138476376 | 0.259 |
| -0.6774825820442452 | 0.259 |
| 0.8208265991844668 | 0.259 |
| 0.9999444940175722 | 0.259 |
| -0.999198243892106 | 0.259 |
| -0.8588182440492711 | 0.26 |
| -0.9754848316144666 | 0.26 |
| 0.8467060782721648 | 0.26 |
| -0.9817331701127544 | 0.26 |
| 0.1975723310498214 | 0.26 |
| -0.8360425568485644 | 0.261 |
| 0.997553399848777 | 0.261 |
| 0.836277372384627 | 0.261 |
| -0.8760229451175052 | 0.261 |
| 0.6475361810079661 | 0.261 |
| 0.003208777654649027 | 0.262 |
| 0.8835938728861815 | 0.262 |
| 0.9957339154777187 | 0.262 |
| 0.9878649296337352 | 0.262 |
| 0.9214834815591154 | 0.262 |
| 0.910102558250259 | 0.263 |
| 0.3789403216232743 | 0.263 |
| -0.27972834728578166 | 0.263 |
| 0.0127498755673003 | 0.263 |
| -0.019500687303457637 | 0.263 |
| 0.7640125651081728 | 0.264 |
| 0.9586558928090156 | 0.264 |
| 0.9987438620596225 | 0.264 |
| 0.7294713279651285 | 0.264 |
| 0.8147437346093943 | 0.264 |
| -0.6009254091658658 | 0.265 |
| 0.5719106999021564 | 0.265 |
| -0.5694086200451801 | 0.265 |
| -0.9404298056580889 | 0.265 |
| -0.6736737219802986 | 0.265 |
| -0.3005473679689502 | 0.266 |
| 0.40552120581098716 | 0.266 |
| 0.21256653552355026 | 0.266 |
| -0.8375427875150437 | 0.266 |
| 0.9859049664097315 | 0.266 |
| 0.12823072176836778 | 0.267 |
| 0.3450143189420941 | 0.267 |
| 0.2783460797156825 | 0.267 |
| -0.4433599986408159 | 0.267 |
| -0.8989542522104096 | 0.267 |
| 0.25473402423400243 | 0.268 |
| -0.26228898484819957 | 0.268 |
| 0.48026406792491555 | 0.268 |
| 0.7993220849901188 | 0.268 |
| -0.2646540381259571 | 0.268 |
| -0.7788469587521808 | 0.269 |
| 0.5395885899304168 | 0.269 |
| 0.9941058589529832 | 0.269 |
| 0.9985523915190408 | 0.269 |
| -0.96042924147051 | 0.269 |
| 0.3644967955822671 | 0.27 |
| 0.9469143910858893 | 0.27 |
| -0.28747913801701536 | 0.27 |
| -0.5444740149151518 | 0.27 |
| 0.6053290071203227 | 0.27 |
| 0.8374268843415889 | 0.271 |
| 0.9014136773073875 | 0.271 |
| -0.11235114348882706 | 0.271 |
| -0.6675052657311843 | 0.271 |
| 0.8950360061099681 | 0.271 |
| 0.38474635746382474 | 0.272 |
| 0.9357706930877335 | 0.272 |
| -0.12172048635828563 | 0.272 |
| 0.6179807675320127 | 0.272 |
| 0.6682062641718551 | 0.272 |
| 0.8988525050967272 | 0.273 |
| -0.765688566055992 | 0.273 |
| 0.2555906611160715 | 0.273 |
| 0.17958859656205975 | 0.273 |
| 0.9996572285992015 | 0.273 |
| -0.9994103744978425 | 0.274 |
| 0.06880498951557272 | 0.274 |
| 0.9980601962046104 | 0.274 |
| 0.9213434511386274 | 0.274 |
| -0.9995675673715125 | 0.274 |
| -0.48327533700724473 | 0.275 |
| 0.15597261140808788 | 0.275 |
| 0.7678734209769185 | 0.275 |
| 0.3476710881302466 | 0.275 |
| 0.905672787100615 | 0.275 |
| 0.9946829285595112 | 0.276 |
| -0.0363949779768367 | 0.276 |
| 0.48999172174226596 | 0.276 |
| 0.9981171265584217 | 0.276 |
| -0.8345717784194934 | 0.276 |
| 0.3895403012524884 | 0.277 |
| -0.7637789336468621 | 0.277 |
| -0.1869104724829281 | 0.277 |
| -0.612213121767156 | 0.277 |
| -0.6399906573127081 | 0.277 |
| -0.9345898379816461 | 0.278 |
| 0.5674203536178394 | 0.278 |
| 0.8037000040871514 | 0.278 |
| 0.9256420586983216 | 0.278 |
| -0.652478073998467 | 0.278 |
| -0.8204891088929376 | 0.279 |
| -0.9984484855124436 | 0.279 |
| 0.99529259618984 | 0.279 |
| -0.6423754507875625 | 0.279 |
| -0.6733018236965962 | 0.279 |
| -0.726882156302499 | 0.28 |
| 0.9886140200343625 | 0.28 |
| -0.693121293991856 | 0.28 |
| 0.9997580112556711 | 0.28 |
| 0.7514541765013112 | 0.28 |
| 0.07288840257267501 | 0.281 |
| -0.9326235218713742 | 0.281 |
| 0.39099316782785454 | 0.281 |
| 0.7521605683593796 | 0.281 |
| -0.7140558613809601 | 0.281 |
| -0.9834842895096138 | 0.282 |
| -0.6791495177991511 | 0.282 |
| -0.9970973349216199 | 0.282 |
| -0.6925053679408245 | 0.282 |
| 0.9970403780486766 | 0.282 |
| 0.7601001358336298 | 0.283 |
| -0.9385263414056874 | 0.283 |
| -0.9637887236460745 | 0.283 |
| 0.08594105373546891 | 0.283 |
| 0.7416458597469006 | 0.283 |
| 0.5884915789304382 | 0.284 |
| 0.7366899714349873 | 0.284 |
| -0.551157185818601 | 0.284 |
| 0.12220821011997772 | 0.284 |
| 0.10108029091543237 | 0.284 |
| 0.7458541628527291 | 0.285 |
| -0.9993293693702434 | 0.285 |
| -0.051478104635419304 | 0.285 |
| -0.025721714637674087 | 0.285 |
| 0.9601681909602855 | 0.285 |
| 0.8457808057200924 | 0.286 |
| -0.7262226137517642 | 0.286 |
| 0.48995874087033475 | 0.286 |
| -0.29874749198953865 | 0.286 |
| -0.9292511030765964 | 0.286 |
| -0.1087885034797635 | 0.287 |
| 0.9442937691876272 | 0.287 |
| -0.169023660985271 | 0.287 |
| 0.46263611845793223 | 0.287 |
| -0.89981897698351 | 0.287 |
| -0.9850050902823543 | 0.288 |
| -0.8679778704674499 | 0.288 |
| -0.9820328503222068 | 0.288 |
| -0.9267080568159703 | 0.288 |
| 0.9718570916237947 | 0.288 |
| 0.015539145779813471 | 0.289 |
| 0.23610362515628439 | 0.289 |
| 0.8136145654493788 | 0.289 |
| -0.9355120555535092 | 0.289 |
| -0.5898060683361566 | 0.289 |
| -0.7658803878117728 | 0.29 |
| -0.9060511912023504 | 0.29 |
| -0.3907825734647418 | 0.29 |
| 0.24726512155007088 | 0.29 |
| -0.5568653991171939 | 0.29 |
| -0.7902217343991578 | 0.291 |
| 0.5527316464249797 | 0.291 |
| -0.8026448759838798 | 0.291 |
| -0.5949850839793756 | 0.291 |
| 0.860623817361265 | 0.291 |
| -0.5918953484607967 | 0.292 |
| 0.19510792269129568 | 0.292 |
| 0.7865813857443608 | 0.292 |
| 0.2893114578705992 | 0.292 |
| 0.914890596847063 | 0.292 |
| 0.9809683061364726 | 0.293 |
| -0.03353396338139568 | 0.293 |
| -0.9227473961859662 | 0.293 |
| -0.2493895702872004 | 0.293 |
| 0.650545430797147 | 0.293 |
| -0.8158187284619982 | 0.294 |
| 0.8979650920458367 | 0.294 |
| -0.43327002892173516 | 0.294 |
| -0.6980140425124054 | 0.294 |
| 0.8493106993341153 | 0.294 |
| -0.6455512151860356 | 0.295 |
| 0.828052640861239 | 0.295 |
| -0.7715770808686151 | 0.295 |
| 0.26499609322370365 | 0.295 |
| 0.6505798895894257 | 0.295 |
| -0.18984420629499182 | 0.296 |
| -0.9892906967928431 | 0.296 |
| 0.9132899603967453 | 0.296 |
| -0.4912561102621139 | 0.296 |
| -0.9578754007594564 | 0.296 |
| 0.1886621093433326 | 0.297 |
| -0.843184148679706 | 0.297 |
| -0.5275685331720934 | 0.297 |
| -0.10859034388946512 | 0.297 |
| -0.12838486731260845 | 0.297 |
| -0.965291151538922 | 0.298 |
| -0.6827042642191217 | 0.298 |
| -0.9999525301357362 | 0.298 |
| 0.5560620422110513 | 0.298 |
| 0.2812796889176936 | 0.298 |
| 0.6431692590267054 | 0.299 |
| 0.8137374462647537 | 0.299 |
| 0.804073477803453 | 0.299 |
| 0.23771537357069214 | 0.299 |
| -0.5224235353591595 | 0.299 |
| 0.6731202960812106 | 0.3 |
| -0.9085478153305827 | 0.3 |
| -0.562017287757294 | 0.3 |
| 0.7958006158342952 | 0.3 |
| 0.8882428366077949 | 0.3 |
| 0.5065514536361986 | 0.301 |
| -0.8885336462667464 | 0.301 |
| 0.9850015004390897 | 0.301 |
| 0.9021667815975352 | 0.301 |
| 0.6490929123042614 | 0.301 |
| 0.9939801157044857 | 0.302 |
| -0.9269874967683335 | 0.302 |
| -0.8827904338904934 | 0.302 |
| 0.8272435912541944 | 0.302 |
| 0.9998313889078291 | 0.302 |
| -0.8527439979963881 | 0.303 |
| -0.7027997212332555 | 0.303 |
| 0.3237887141020676 | 0.303 |
| 0.8767712723650479 | 0.303 |
| 0.6808452694781582 | 0.303 |
| -0.7865301015914231 | 0.304 |
| 0.08200795797426211 | 0.304 |
| -0.9499483292303244 | 0.304 |
| -0.4703769768946402 | 0.304 |
| -0.9324636946584314 | 0.304 |
| -0.015034950729724477 | 0.305 |
| -0.014334454071039227 | 0.305 |
| 0.46898257813985433 | 0.305 |
| 0.059315722126434094 | 0.305 |
| -0.20483891539449997 | 0.305 |
| -0.9813993909554467 | 0.306 |
| -0.9574038430991875 | 0.306 |
| 0.20915729654530132 | 0.306 |
| -0.1359412110389197 | 0.306 |
| 0.43912019674880504 | 0.306 |
| 0.980745240211271 | 0.307 |
| -0.8718316811533343 | 0.307 |
| -0.5084656726627312 | 0.307 |
| -0.4137658091281008 | 0.307 |
| -0.024869179470339054 | 0.307 |
| 0.9747223587430188 | 0.308 |
| 0.9982837595000288 | 0.308 |
| 0.06090860391230249 | 0.308 |
| -0.8080847344141403 | 0.308 |
| -0.9298074491065907 | 0.308 |
| -0.6670152959964062 | 0.309 |
| 0.24696265086035954 | 0.309 |
| 0.03555185507333738 | 0.309 |
| 0.4095827237082975 | 0.309 |
| -0.5537253036259953 | 0.309 |
| 0.9135993387041815 | 0.31 |
| 0.8132133920965071 | 0.31 |
| 0.6058918587451192 | 0.31 |
| -0.834559521964871 | 0.31 |
| 0.4571637331230178 | 0.31 |
| -0.9996003038136706 | 0.311 |
| -0.8287948807185046 | 0.311 |
| -0.7423259499900254 | 0.311 |
| 0.5944112845569004 | 0.311 |
| 0.9227030406572034 | 0.311 |
| -0.8274991427448873 | 0.312 |
| 0.7176969367436726 | 0.312 |
| -0.8393742709234187 | 0.312 |
| 0.9667590671594496 | 0.312 |
| 0.7988539163773399 | 0.312 |
| -0.9326991674433566 | 0.313 |
| -0.44723854232384985 | 0.313 |
| -0.8466941212658002 | 0.313 |
| 0.9141541588915919 | 0.313 |
| -0.2838139771445704 | 0.313 |
| -0.9914590389155797 | 0.314 |
| 0.9809112110839054 | 0.314 |
| 0.12378749059806285 | 0.314 |
| 0.1222470388181441 | 0.314 |
| 0.8341766368853676 | 0.314 |
| -0.46747336217719954 | 0.315 |
| 0.8873231702681921 | 0.315 |
| -0.5305670408118905 | 0.315 |
| -0.7207540918200966 | 0.315 |
| 0.9991707487434768 | 0.315 |
| 0.9997718214763981 | 0.316 |
| 0.8644748551867847 | 0.316 |
| -0.5055244917031617 | 0.316 |
| -0.4012176413422967 | 0.316 |
| 0.5086876622841973 | 0.316 |
| -0.7131899304762053 | 0.317 |
| -0.9181196441395947 | 0.317 |
| 0.43269769172652783 | 0.317 |
| -0.9745936548512775 | 0.317 |
| -0.5638448057512855 | 0.317 |
| 0.695312681894299 | 0.318 |
| -0.36204898297062366 | 0.318 |
| 0.7474795774089767 | 0.318 |
| 0.9853707959219319 | 0.318 |
| -0.14858284975816796 | 0.318 |
| -0.9801909389118562 | 0.319 |
| 0.9175182713348942 | 0.319 |
| -0.10815780139682524 | 0.319 |
| -0.9786345427696078 | 0.319 |
| 0.5236487764951819 | 0.319 |
| -0.6402422938083459 | 0.32 |
| -0.6485449987054372 | 0.32 |
| -0.3680339412811993 | 0.32 |
| -0.9826514160578561 | 0.32 |
| -0.7318501155147367 | 0.32 |
| 0.4993622025621733 | 0.321 |
| 0.4748695202539145 | 0.321 |
| -0.8167670456471601 | 0.321 |
| -0.5631269338790814 | 0.321 |
| -0.22724405942020323 | 0.321 |
| -0.6564399469789673 | 0.322 |
| 0.8508136824907074 | 0.322 |
| 0.9438152339942042 | 0.322 |
| 0.44674650225322377 | 0.322 |
| -0.6584361608017723 | 0.322 |
| 0.9357836803860701 | 0.323 |
| -0.522401074421326 | 0.323 |
| 0.8735420785509646 | 0.323 |
| -0.5187378870010259 | 0.323 |
| 0.6279338184412684 | 0.323 |
| 0.9445914529202339 | 0.324 |
| 0.47417140308989525 | 0.324 |
| 0.7698532332085739 | 0.324 |
| -0.4719582314094558 | 0.324 |
| -0.07689619887682853 | 0.324 |
| -0.9927923523063321 | 0.325 |
| -0.7811114793380209 | 0.325 |
| -0.0622002627720554 | 0.325 |
| 0.7382060000879014 | 0.325 |
| 0.9996507682635233 | 0.325 |
| -0.6554155367711372 | 0.326 |
| -0.9146574441507412 | 0.326 |
| 0.873364172602629 | 0.326 |
| 0.18435530240234455 | 0.326 |
| 0.09456336018598692 | 0.326 |
| -0.5399635535031343 | 0.327 |
| -0.9837303660159187 | 0.327 |
| -0.9193640970133463 | 0.327 |
| 0.9035525043681698 | 0.327 |
| -0.5905232406946936 | 0.327 |
| 0.24366122832695136 | 0.328 |
| 0.5945496331359182 | 0.328 |
| 0.02105321388589178 | 0.328 |
| -0.5353252438701247 | 0.328 |
| 0.5291587888700613 | 0.328 |
| -0.0773947289608648 | 0.329 |
| -0.6210355272261047 | 0.329 |
| 0.40871010721870715 | 0.329 |
| 0.8898833412343521 | 0.329 |
| -0.995549873182975 | 0.329 |
| 0.015495111259092987 | 0.33 |
| 0.9649554803602921 | 0.33 |
| -0.640700805955588 | 0.33 |
| -0.5224941427078762 | 0.33 |
| -0.9873511580472503 | 0.33 |
| 0.05802136231170299 | 0.331 |
| 0.5592425148899597 | 0.331 |
| 0.9210941022708437 | 0.331 |
| 0.9099379986226892 | 0.331 |
| -0.9479411871767093 | 0.331 |
| -0.9840049835670555 | 0.332 |
| -0.6933928274688013 | 0.332 |
| 0.5594440779695705 | 0.332 |
| -0.14472918399950227 | 0.332 |
| -0.9640966447247565 | 0.332 |
| 0.9980419912953366 | 0.333 |
| -0.7775515284640168 | 0.333 |
| 0.5526495754149969 | 0.333 |
| 0.30661279860734164 | 0.333 |
| 0.8606320837056441 | 0.333 |
| 0.9803858108397768 | 0.334 |
| 0.5529736748230876 | 0.334 |
| -0.9447175901782957 | 0.334 |
| 0.6238366795372823 | 0.334 |
| 0.990849361250324 | 0.334 |
| 0.9204467382356057 | 0.335 |
| 0.9981190299134571 | 0.335 |
| 0.015504270339642384 | 0.335 |
| 0.6521612304342453 | 0.335 |
| 0.11682601269862035 | 0.335 |
| 0.6686606164932959 | 0.336 |
| -0.34410261101136613 | 0.336 |
| -0.13717756264319703 | 0.336 |
| 0.9777506792940689 | 0.336 |
| 0.6984805215590386 | 0.336 |
| 0.9154598660057084 | 0.337 |
| -0.7882050560048084 | 0.337 |
| -0.9354247603738924 | 0.337 |
| -0.6072428197958849 | 0.337 |
| 0.9809674471522488 | 0.337 |
| -0.5780230417263634 | 0.338 |
| -0.23451223884877961 | 0.338 |
| 0.49083133592342315 | 0.338 |
| -0.3614338825228706 | 0.338 |
| -0.9866047810898261 | 0.338 |
| -0.7148556972333115 | 0.339 |
| -0.6254872506283998 | 0.339 |
| -0.837490024807613 | 0.339 |
| 0.7607880977487598 | 0.339 |
| -0.26751874876257686 | 0.339 |
| 0.9986247194006934 | 0.34 |
| -0.3391247439311187 | 0.34 |
| -0.7834304425631313 | 0.34 |
| -0.9761503382552471 | 0.34 |
| 0.479918993938817 | 0.34 |
| 0.10897500539562738 | 0.341 |
| 0.444714596091303 | 0.341 |
| -0.9975836232079092 | 0.341 |
| -0.6019085926968952 | 0.341 |
| 0.6553379880438205 | 0.341 |
| -0.7296721410854773 | 0.342 |
| -0.9961627163085827 | 0.342 |
| -0.8139782398218043 | 0.342 |
| -0.9811745308596108 | 0.342 |
| -0.8944824328001176 | 0.342 |
| -0.12440434456664287 | 0.343 |
| 0.2182110874838996 | 0.343 |
| 0.9943191393625552 | 0.343 |
| -0.7353668452349053 | 0.343 |
| -0.38090004698565516 | 0.343 |
| 0.5252233253171635 | 0.344 |
| 0.9999597658818906 | 0.344 |
| -0.9004905982320065 | 0.344 |
| 0.26689845851873095 | 0.344 |
| 0.7298339415304328 | 0.344 |
| 0.9711940906605916 | 0.345 |
| -0.1481926254744415 | 0.345 |
| -0.955079291552475 | 0.345 |
| -0.5014451275356916 | 0.345 |
| 0.9263043172018298 | 0.345 |
| -0.5216461077142649 | 0.346 |
| -0.8647048185266684 | 0.346 |
| -0.5085119956456092 | 0.346 |
| -0.4974233633253906 | 0.346 |
| -0.9435993691745527 | 0.346 |
| -0.8707976301243546 | 0.347 |
| -0.9912934918481935 | 0.347 |
| 0.4259206091208663 | 0.347 |
| -0.9440411751260237 | 0.347 |
| 0.1370798441113033 | 0.347 |
| 0.564039998704304 | 0.348 |
| 0.971101390424418 | 0.348 |
| -0.7928404394688023 | 0.348 |
| -0.1728720465728547 | 0.348 |
| 0.9125599742089444 | 0.348 |
| -0.5956374908125642 | 0.349 |
| -0.887415501862735 | 0.349 |
| -0.9465167871857462 | 0.349 |
| 0.3162487321865797 | 0.349 |
| 0.5827603769842706 | 0.349 |
| 0.23813289509310331 | 0.35 |
| 0.4963857172830062 | 0.35 |
| -0.5779326383771805 | 0.35 |
| -0.8862264354524155 | 0.35 |
| -0.05106564993200388 | 0.35 |
| 0.99357575032438 | 0.351 |
| 0.9882755862898273 | 0.351 |
| -0.8977483123739625 | 0.351 |
| 0.13172322073828532 | 0.351 |
| 0.2708808143644551 | 0.351 |
| 0.7723490661703839 | 0.352 |
| 0.11512706761084256 | 0.352 |
| -0.9767061515718882 | 0.352 |
| 0.11517032466020573 | 0.352 |
| 0.7424571983982879 | 0.352 |
| 0.9170323987814676 | 0.353 |
| -0.7976783035719391 | 0.353 |
| 0.9693340262482799 | 0.353 |
| -0.6843716336003438 | 0.353 |
| -0.8541518122275266 | 0.353 |
| -0.16958031380341027 | 0.354 |
| 0.8403841564633987 | 0.354 |
| -0.3173665428689358 | 0.354 |
| 0.08890713412847925 | 0.354 |
| 0.5389562529761656 | 0.354 |
| -0.9961938499989654 | 0.355 |
| -0.4907365060184744 | 0.355 |
| 0.7087994906779986 | 0.355 |
| 0.7558032101105059 | 0.355 |
| 0.6659703303230136 | 0.355 |
| 0.673763830197586 | 0.356 |
| 0.32259654084656 | 0.356 |
| -0.9411404463300652 | 0.356 |
| 0.9775683887618065 | 0.356 |
| 0.6426865966029843 | 0.356 |
| 0.2091081298142537 | 0.357 |
| -0.9692688475778823 | 0.357 |
| 0.8065191363518812 | 0.357 |
| 0.33307106545945797 | 0.357 |
| -0.8719312422444183 | 0.357 |
| -0.48317371571003415 | 0.358 |
| -0.9889770142756591 | 0.358 |
| 0.8663276541567649 | 0.358 |
| -0.9064382320968831 | 0.358 |
| 0.4574626484861985 | 0.358 |
| -0.11939840217538118 | 0.359 |
| -0.1922623961338708 | 0.359 |
| -0.16437128839303783 | 0.359 |
| -0.9400085156348735 | 0.359 |
| -0.563276450665032 | 0.359 |
| -0.875272278315493 | 0.36 |
| -0.9951808019645474 | 0.36 |
| 0.09025516637261831 | 0.36 |
| -0.9234409810049521 | 0.36 |
| -0.48153947460592716 | 0.36 |
| -0.7539379435931787 | 0.361 |
| -0.9093154390838712 | 0.361 |
| 0.9875414424374203 | 0.361 |
| 0.29360908745925735 | 0.361 |
| -0.8903903447576871 | 0.361 |
| -0.1758093218166247 | 0.362 |
| 0.994556999799361 | 0.362 |
| 0.8869274372854473 | 0.362 |
| 0.6292697539011143 | 0.362 |
| -0.4182743766245355 | 0.362 |
| -0.6872734740928568 | 0.363 |
| 0.9784896700168482 | 0.363 |
| -0.3659525883187502 | 0.363 |
| 0.4944063602594974 | 0.363 |
| 0.20159947525419034 | 0.363 |
| 0.9930198522752142 | 0.364 |
| -0.9917303239461753 | 0.364 |
| 0.22988783188657064 | 0.364 |
| -0.858527163097301 | 0.364 |
| 0.08709185510245254 | 0.364 |
| 0.5878316662681462 | 0.365 |
| 0.22194550788592518 | 0.365 |
| -0.3376448467400027 | 0.365 |
| -0.48271906824282035 | 0.365 |
| 0.948760602351109 | 0.365 |
| 0.8091099836884831 | 0.366 |
| 0.9994931829586522 | 0.366 |
| -0.3273613708331249 | 0.366 |
| 0.47824696749198653 | 0.366 |
| 0.4577305057413041 | 0.366 |
| -0.09159024902213124 | 0.367 |
| 0.9836272352355406 | 0.367 |
| -0.9269448112042771 | 0.367 |
| -0.04068356823274322 | 0.367 |
| -0.8466314219392511 | 0.367 |
| 0.7029715218413061 | 0.368 |
| 0.5951715735737982 | 0.368 |
| 0.4507030191902237 | 0.368 |
| 0.2682193095364505 | 0.368 |
| 0.4006691025636642 | 0.368 |
| 0.029923713701079557 | 0.369 |
| 0.9845245257401879 | 0.369 |
| 0.9997112950238846 | 0.369 |
| 0.8716183367466709 | 0.369 |
| 0.7102564133404565 | 0.369 |
| -0.14788617575902321 | 0.37 |
| -0.9950740419738816 | 0.37 |
| 0.8311293776446251 | 0.37 |
| 0.9713167484278814 | 0.37 |
| -0.9859657328377868 | 0.37 |
| 0.2598983466893267 | 0.371 |
| -0.9978483920523947 | 0.371 |
| -0.6829457801825133 | 0.371 |
| 0.9877336302185523 | 0.371 |
| 0.0029912852286990456 | 0.371 |
| 0.9836261250588108 | 0.372 |
| 0.48638663156925915 | 0.372 |
| -0.9997551187713603 | 0.372 |
| -0.8116001400810939 | 0.372 |
| 0.25980292541053285 | 0.372 |
| 0.8884397371115161 | 0.373 |
| 0.19907064152100218 | 0.373 |
| 0.3867105612271493 | 0.373 |
| -0.3430189143236592 | 0.373 |
| 0.9999471021654085 | 0.373 |
| 0.7741582282061726 | 0.374 |
| 0.08512589885049736 | 0.374 |
| -0.9133477028108283 | 0.374 |
| -0.5254666433844738 | 0.374 |
| 0.6410791779953705 | 0.374 |
| -0.9471750739845327 | 0.375 |
| 0.6682168712969603 | 0.375 |
| 0.9448165212267942 | 0.375 |
| -0.26654348353554375 | 0.375 |
| -0.5628609749607855 | 0.375 |
| -0.5704402911381614 | 0.376 |
| -0.9337363602253714 | 0.376 |
| 0.9020370495846151 | 0.376 |
| 0.1960738821881254 | 0.376 |
| 0.986379280468988 | 0.376 |
| 0.36900771733959953 | 0.377 |
| -0.1911301675213214 | 0.377 |
| -0.98096643322802 | 0.377 |
| -0.25933024622855555 | 0.377 |
| 0.2107535798546491 | 0.377 |
| 0.25493694460174354 | 0.378 |
| -0.07461846582612991 | 0.378 |
| 0.0068254033460995655 | 0.378 |
| -0.9823328676171745 | 0.378 |
| 0.7304477011766494 | 0.378 |
| 0.7307765266110401 | 0.379 |
| -0.7389942781016805 | 0.379 |
| 0.12265559277456117 | 0.379 |
| -0.9713530620874743 | 0.379 |
| -0.5030398923653527 | 0.379 |
| -0.8327905780561133 | 0.38 |
| -0.35039853340834165 | 0.38 |
| 0.9291176391864865 | 0.38 |
| -0.06280408043878805 | 0.38 |
| -0.9892488059438295 | 0.38 |
| -0.3012247118973368 | 0.381 |
| -0.4107938082197353 | 0.381 |
| 0.6492544281137257 | 0.381 |
| 0.2957713334926318 | 0.381 |
| 0.7790631002392254 | 0.381 |
| -0.6987275737068985 | 0.382 |
| -0.1276286559314411 | 0.382 |
| -0.47809460475462234 | 0.382 |
| -0.5283944983611369 | 0.382 |
| 0.5447301199425613 | 0.382 |
| -0.9685477530766645 | 0.383 |
| 0.8213336938100367 | 0.383 |
| 0.22294568566007583 | 0.383 |
| -0.8380989598441313 | 0.383 |
| 0.972065576633421 | 0.383 |
| -0.6172030902224789 | 0.384 |
| -0.7823910956351472 | 0.384 |
| 0.27902139409389903 | 0.384 |
| -0.729859651449755 | 0.384 |
| 0.9875828455256371 | 0.384 |
| 0.8017208204057591 | 0.385 |
| 0.7252739216642736 | 0.385 |
| 0.9775059939714011 | 0.385 |
| -0.7447325347684338 | 0.385 |
| 0.9535068010393305 | 0.385 |
| 0.5391306861351212 | 0.386 |
| 0.855307570951195 | 0.386 |
| 0.8418454610753761 | 0.386 |
| 0.9999863415901163 | 0.386 |
| -0.5716831233558057 | 0.386 |
| -0.7633291012862878 | 0.387 |
| 0.7914764783907927 | 0.387 |
| 0.8407508668518268 | 0.387 |
| -0.9604883482188836 | 0.387 |
| 0.10514968367519337 | 0.387 |
| -0.7519607020675149 | 0.388 |
| 0.250687726153671 | 0.388 |
| 0.9956258590707506 | 0.388 |
| -0.8415000182896629 | 0.388 |
| 0.137833167031333 | 0.388 |
| -0.4504084635758053 | 0.389 |
| -0.724397821277581 | 0.389 |
| -0.19257239983045008 | 0.389 |
| -0.8941051777019701 | 0.389 |
| -0.34591254125411114 | 0.389 |
| -0.41835331069306214 | 0.39 |
| -0.44204839567283916 | 0.39 |
| 0.6472829910672584 | 0.39 |
| 0.21541234714756582 | 0.39 |
| -0.5102854508635554 | 0.39 |
| 0.064686890137084 | 0.391 |
| 0.1458313300244638 | 0.391 |
| -0.7368902461314185 | 0.391 |
| -0.9877970480397252 | 0.391 |
| -0.6349915526269982 | 0.391 |
| -0.13008970570056594 | 0.392 |
| -0.6605346359168902 | 0.392 |
| 0.626613072816011 | 0.392 |
| 0.9838121706033972 | 0.392 |
| -0.3803604096421588 | 0.392 |
| 0.9459771686092543 | 0.393 |
| -0.4807474816068312 | 0.393 |
| 0.1159633917681698 | 0.393 |
| -0.19928695566761145 | 0.393 |
| 0.7829141891136451 | 0.393 |
| -0.888164186559367 | 0.394 |
| -0.4144981110193993 | 0.394 |
| -0.9527941994428204 | 0.394 |
| -0.39239262132271374 | 0.394 |
| -0.650002392364783 | 0.394 |
| 0.725686241283239 | 0.395 |
| 0.7690147680124035 | 0.395 |
| -0.58006045381075 | 0.395 |
| 0.8925750476823789 | 0.395 |
| -0.7942506147291868 | 0.395 |
| -0.8792284922150081 | 0.396 |
| 0.6840446942348639 | 0.396 |
| -0.8798880031490097 | 0.396 |
| -0.015233730170850708 | 0.396 |
| -0.3374290049867947 | 0.396 |
| 0.8001762831818865 | 0.397 |
| 0.5771901701868247 | 0.397 |
| 0.1865477732508573 | 0.397 |
| 0.8895784540773108 | 0.397 |
| -0.8104020104657698 | 0.397 |
| 0.9748155161986344 | 0.398 |
| 0.2826308060311094 | 0.398 |
| -0.8276784554311325 | 0.398 |
| -0.10679741817500503 | 0.398 |
| 0.8030172478591581 | 0.398 |
| 0.28636781579356674 | 0.399 |
| -0.8379349787707672 | 0.399 |
| -0.69156493497955 | 0.399 |
| -0.6984580972828928 | 0.399 |
| -0.7676965675245137 | 0.399 |
| 0.3815122735125874 | 0.4 |
| 0.5365840989315424 | 0.4 |
| 0.9780780292256556 | 0.4 |
| 0.12174503365952218 | 0.4 |
| 0.984269127080255 | 0.4 |
| 0.31066032666189214 | 0.401 |
| -0.9968438840696103 | 0.401 |
| 0.7127574807311503 | 0.401 |
| -0.9980378640926213 | 0.401 |
| -0.952507785289943 | 0.401 |
| -0.17050579222674264 | 0.402 |
| -0.3377648345337668 | 0.402 |
| -0.09986501724592266 | 0.402 |
| -0.4015639009972064 | 0.402 |
| 0.20277371824228918 | 0.402 |
| 0.5359288854385005 | 0.403 |
| -0.6367667525057584 | 0.403 |
| 0.974383550179554 | 0.403 |
| -0.3919190204713682 | 0.403 |
| 0.917790994923084 | 0.403 |
| 0.3687689248592245 | 0.404 |
| 0.8689036929433557 | 0.404 |
| -0.9084013644430642 | 0.404 |
| -0.3835821923720286 | 0.404 |
| -0.8302303188762061 | 0.404 |
| 0.21564206830930727 | 0.405 |
| 0.9976751128009942 | 0.405 |
| -0.592198847238858 | 0.405 |
| -0.8595373357048285 | 0.405 |
| -0.4042234013789921 | 0.405 |
| -0.6965524741319862 | 0.406 |
| -0.5303619516163242 | 0.406 |
| 0.5863067545893673 | 0.406 |
| 0.23868210979651996 | 0.406 |
| 0.9386253671890264 | 0.406 |
| -0.368140098311325 | 0.407 |
| -0.529931232901071 | 0.407 |
| 0.6870563446134248 | 0.407 |
| 0.6138154250376531 | 0.407 |
| 0.7864022636396395 | 0.407 |
| 0.7347239329984906 | 0.408 |
| 0.6771897153397473 | 0.408 |
| -0.3863602781067832 | 0.408 |
| 0.26310181031521446 | 0.408 |
| -0.8580175916780237 | 0.408 |
| 0.5300106245245654 | 0.409 |
| 0.9979639314760075 | 0.409 |
| 0.7885424154167074 | 0.409 |
| -0.44317577078095843 | 0.409 |
| 0.21280060496187728 | 0.409 |
| 0.4563854038159715 | 0.41 |
| -0.3440618716992396 | 0.41 |
| 0.9858147187221741 | 0.41 |
| -0.7072920866574769 | 0.41 |
| 0.07066379534224838 | 0.41 |
| 0.7308533251130265 | 0.411 |
| 0.10410300021768745 | 0.411 |
| 0.7118631240361873 | 0.411 |
| 0.649611034060827 | 0.411 |
| -0.3450983061196122 | 0.411 |
| 0.6039822399759068 | 0.412 |
| 0.9553268663848302 | 0.412 |
| 0.8036500579900728 | 0.412 |
| 0.8255661351435308 | 0.412 |
| 0.9997981933105011 | 0.412 |
| -0.6268725726563545 | 0.413 |
| -0.8611984238707261 | 0.413 |
| -0.7341141004887723 | 0.413 |
| -0.992801637094276 | 0.413 |
| -0.9973692632709341 | 0.413 |
| -0.873006849485041 | 0.414 |
| -0.7983403363064103 | 0.414 |
| 0.02148585441969852 | 0.414 |
| -0.5126763031989383 | 0.414 |
| 0.6932611133872556 | 0.414 |
| -0.9542911346333596 | 0.415 |
| -0.3723392670518763 | 0.415 |
| 0.26440727135742453 | 0.415 |
| -0.9961912894671181 | 0.415 |
| -0.6143989633524788 | 0.415 |
| -0.9194106797146402 | 0.416 |
| 0.7708404750004361 | 0.416 |
| -0.7165552968535251 | 0.416 |
| 0.6062205404693779 | 0.416 |
| -0.9250782055097285 | 0.416 |
| 0.7944242430458546 | 0.417 |
| 0.2856776312044608 | 0.417 |
| 0.04035540278619623 | 0.417 |
| 0.9999761715736423 | 0.417 |
| 0.7568648083674571 | 0.417 |
| 0.8717807944736378 | 0.418 |
| -0.18326997310997392 | 0.418 |
| -0.058237751950539214 | 0.418 |
| 0.9831843640323601 | 0.418 |
| 0.7861498860584035 | 0.418 |
| -0.33457148260917524 | 0.419 |
| -0.4042733113335914 | 0.419 |
| 0.7332892272043414 | 0.419 |
| -0.39624356441780484 | 0.419 |
| -0.8772991520214845 | 0.419 |
| -0.23240363616640414 | 0.42 |
| -0.9372881116690436 | 0.42 |
| -0.9610180641570387 | 0.42 |
| 0.08269104504503115 | 0.42 |
| -0.1755160491547933 | 0.42 |
| 0.8545108736811886 | 0.421 |
| 0.010209523607722175 | 0.421 |
| 0.1626175129147435 | 0.421 |
| -0.42829772311917297 | 0.421 |
| -0.9785601704718669 | 0.421 |
| 0.569979548020523 | 0.422 |
| -0.9933899182893923 | 0.422 |
| 0.8882574195836713 | 0.422 |
| -0.01904982004603063 | 0.422 |
| 0.885260624212067 | 0.422 |
| 0.4393028002278917 | 0.423 |
| 0.826529108342373 | 0.423 |
| 0.23330179832203798 | 0.423 |
| 0.030576357654731934 | 0.423 |
| -0.12120789838891385 | 0.423 |
| -0.6847695602718269 | 0.424 |
| 0.8422201233904705 | 0.424 |
| -0.8293020572867154 | 0.424 |
| 0.8963175239518785 | 0.424 |
| -0.17695924976935812 | 0.424 |
| 0.9241579073927804 | 0.425 |
| 0.7837376672824682 | 0.425 |
| -0.9771367601099359 | 0.425 |
| -0.31456633455324273 | 0.425 |
| 0.8083453853427585 | 0.425 |
| 0.7287489941116294 | 0.426 |
| 0.9741446669607349 | 0.426 |
| -0.3156096809250502 | 0.426 |
| 0.9976710547256443 | 0.426 |
| 0.534520297011652 | 0.426 |
| -0.951404279720244 | 0.427 |
| 0.9455280121981735 | 0.427 |
| 0.08219957768380592 | 0.427 |
| -0.6940419864250726 | 0.427 |
| -0.898129030415894 | 0.427 |
| 0.4278934840585399 | 0.428 |
| 0.9723112897590395 | 0.428 |
| 0.9970325365582542 | 0.428 |
| 0.9999876964099487 | 0.428 |
| -0.5464442564355819 | 0.428 |
| -0.21413318007886292 | 0.429 |
| -0.3583050485307164 | 0.429 |
| 0.9337890550308807 | 0.429 |
| -0.1500406722559613 | 0.429 |
| -0.974848378245604 | 0.429 |
| 0.15197655108486063 | 0.43 |
| 0.6979285421024637 | 0.43 |
| -0.9599148150445838 | 0.43 |
| 0.9778718156844176 | 0.43 |
| 0.997426993740289 | 0.43 |
| 0.8219693163399698 | 0.431 |
| -0.05312145479094131 | 0.431 |
| -0.9062704645513866 | 0.431 |
| -0.05788362010198552 | 0.431 |
| 0.7287922109731704 | 0.431 |
| 0.746678878363509 | 0.432 |
| 0.8188240151511063 | 0.432 |
| 0.7189527728621754 | 0.432 |
| 0.9482359090725491 | 0.432 |
| 0.3345550846161648 | 0.432 |
| 0.6469352311728619 | 0.433 |
| -0.5831940174490033 | 0.433 |
| -0.6218073376841193 | 0.433 |
| -0.9659189931107544 | 0.433 |
| 0.642599507365018 | 0.433 |
| -0.34527693601096626 | 0.434 |
| -0.6862904464928745 | 0.434 |
| -0.49083115431534446 | 0.434 |
| -0.5063244110258179 | 0.434 |
| 0.22292024941148955 | 0.434 |
| 0.5254685188634767 | 0.435 |
| -0.9997444938797646 | 0.435 |
| -0.8415929550930742 | 0.435 |
| -0.36660854259903247 | 0.435 |
| 0.2126813319383606 | 0.435 |
| -0.19203523489724744 | 0.436 |
| 0.6912816066228156 | 0.436 |
| -0.38060110062031444 | 0.436 |
| 0.651632427987623 | 0.436 |
| -0.9348577380735308 | 0.436 |
| -0.9765289899993612 | 0.437 |
| -0.904594110052323 | 0.437 |
| -0.5353656280990244 | 0.437 |
| 0.3100628177009796 | 0.437 |
| 0.887307778235225 | 0.437 |
| 0.8421081062889597 | 0.438 |
| -0.9322001730284816 | 0.438 |
| 0.9428186563851304 | 0.438 |
| 0.9308966881878847 | 0.438 |
| -0.9020663964492324 | 0.438 |
| -0.4861583092561076 | 0.439 |
| 0.9978191231722217 | 0.439 |
| -0.745185506896204 | 0.439 |
| 0.8074607119078088 | 0.439 |
| 0.6094265145124227 | 0.439 |
| 0.955971809312078 | 0.44 |
| -0.6008306029478356 | 0.44 |
| -0.9987702511917866 | 0.44 |
| 0.6335395062138334 | 0.44 |
| -0.5412082152982702 | 0.44 |
| 0.5741837857192909 | 0.441 |
| 0.9144916697661907 | 0.441 |
| -0.9945786385584993 | 0.441 |
| -0.2999494169201024 | 0.441 |
| -0.6114399397350319 | 0.441 |
| 0.9942934964378393 | 0.442 |
| -0.7004060696523217 | 0.442 |
| -0.8034515823385286 | 0.442 |
| -0.7938588790400134 | 0.442 |
| -0.6992319758299926 | 0.442 |
| 0.923573364801353 | 0.443 |
| 0.5480108279363823 | 0.443 |
| 0.007284597797826331 | 0.443 |
| -0.09493193780864682 | 0.443 |
| 0.2904643890589348 | 0.443 |
| 0.7004686152009147 | 0.444 |
| -0.8129949239105028 | 0.444 |
| 0.9804521704153824 | 0.444 |
| 0.9997213889869829 | 0.444 |
| 0.7733147760640828 | 0.444 |
| 0.5350404945840547 | 0.445 |
| -0.6643484465975211 | 0.445 |
| -0.9917895188014347 | 0.445 |
| 0.6832051171158519 | 0.445 |
| 0.11661756197868732 | 0.445 |
| 0.8217293740379426 | 0.446 |
| -0.041795914213667566 | 0.446 |
| -0.9989752911466333 | 0.446 |
| -0.9923761963307741 | 0.446 |
| 0.3629933297238575 | 0.446 |
| 0.8288151127029835 | 0.447 |
| 0.5864792818268473 | 0.447 |
| -0.791143619920073 | 0.447 |
| 0.8463394713589835 | 0.447 |
| 0.25129492804028086 | 0.447 |
| -0.9858969241971227 | 0.448 |
| 0.9956007974249883 | 0.448 |
| -0.8936015269154853 | 0.448 |
| -0.9246150722088812 | 0.448 |
| 0.04583711389126649 | 0.448 |
| 0.412505085399316 | 0.449 |
| 0.3269577794876764 | 0.449 |
| -0.9151062424120948 | 0.449 |
| -0.9537681509715835 | 0.449 |
| -0.6956713553908233 | 0.449 |
| 0.3903904316337583 | 0.45 |
| 0.9199615950692227 | 0.45 |
| -0.5890447063451565 | 0.45 |
| 0.9993465201367843 | 0.45 |
| -0.9984998064633236 | 0.45 |
| -0.5967006243781622 | 0.451 |
| -0.0869526571110657 | 0.451 |
| 0.549794744013669 | 0.451 |
| -0.9604689547692309 | 0.451 |
| 0.14953176530396695 | 0.451 |
| -0.73717802126342 | 0.452 |
| -0.8010535124259403 | 0.452 |
| -0.9716539758900773 | 0.452 |
| -0.606392064928758 | 0.452 |
| 0.9092378862543257 | 0.452 |
| -0.9024400299741093 | 0.453 |
| -0.308935995107759 | 0.453 |
| -0.6548747734957734 | 0.453 |
| -0.6766665295128435 | 0.453 |
| -0.992307817170348 | 0.453 |
| 0.9407544708815108 | 0.454 |
| 0.9950188110103927 | 0.454 |
| 0.8683870741980707 | 0.454 |
| 0.6822565592536917 | 0.454 |
| 0.2738661948986126 | 0.454 |
| -0.8975713470590646 | 0.455 |
| 0.586865126956582 | 0.455 |
| -0.5829287769482117 | 0.455 |
| 0.9908041123500576 | 0.455 |
| -0.5413421863623065 | 0.455 |
| -0.41867306665299164 | 0.456 |
| 0.9038941641126766 | 0.456 |
| 0.4861362915803313 | 0.456 |
| 0.986683455797041 | 0.456 |
| -0.918780531291872 | 0.456 |
| 0.4257898280600271 | 0.457 |
| -0.279433580321449 | 0.457 |
| 0.9577786003961447 | 0.457 |
| 0.37876982073429416 | 0.457 |
| -0.8999401767665751 | 0.457 |
| -0.48711941752332794 | 0.458 |
| -0.8619046555655738 | 0.458 |
| -0.49096456371912983 | 0.458 |
| 0.9692567551829085 | 0.458 |
| 0.6250610315703191 | 0.458 |
| 0.8827254722927779 | 0.459 |
| -0.13243105477663283 | 0.459 |
| 0.6996126833833638 | 0.459 |
| 0.2527010479177239 | 0.459 |
| -0.9629394908559221 | 0.459 |
| -0.9776099852382891 | 0.46 |
| 0.8383063266820464 | 0.46 |
| -0.1966367846892187 | 0.46 |
| 0.37702812250014933 | 0.46 |
| 0.4846160731015624 | 0.46 |
| 0.09203548100365641 | 0.461 |
| -0.5505861304530443 | 0.461 |
| 0.540206549398242 | 0.461 |
| 0.9752364911162947 | 0.461 |
| 0.4625230344370027 | 0.461 |
| 0.16076447513518177 | 0.462 |
| -0.42920813699844956 | 0.462 |
| 0.5334033788537867 | 0.462 |
| 0.8406380269007792 | 0.462 |
| 0.33379422834626793 | 0.462 |
| 0.910157831014368 | 0.463 |
| -0.17304828599889605 | 0.463 |
| 0.9308251906643397 | 0.463 |
| -0.43771138970723256 | 0.463 |
| 0.9915240400807055 | 0.463 |
| -0.019792690730592356 | 0.464 |
| 0.5728168236842168 | 0.464 |
| -0.733571565953359 | 0.464 |
| -0.9970326964565426 | 0.464 |
| -0.9544168619190782 | 0.464 |
| 0.9958622976259859 | 0.465 |
| -0.02506102084565631 | 0.465 |
| 0.7018565340884648 | 0.465 |
| -0.18199217611036758 | 0.465 |
| -0.30297957953915045 | 0.465 |
| -0.19035413054034644 | 0.466 |
| 0.5160487009340201 | 0.466 |
| -0.6995768353061161 | 0.466 |
| 0.9903649361683835 | 0.466 |
| -0.027603935989877215 | 0.466 |
| 0.9864794087467272 | 0.467 |
| 0.9267617473192841 | 0.467 |
| 0.8061039014594712 | 0.467 |
| 0.5046933565870242 | 0.467 |
| -0.14478271972553447 | 0.467 |
| -0.9989612739729922 | 0.468 |
| -0.9960940333690976 | 0.468 |
| 0.9292290125615528 | 0.468 |
| -0.782722207456837 | 0.468 |
| -0.6657196919152574 | 0.468 |
| -0.8045985097879208 | 0.469 |
| 0.2680174287556481 | 0.469 |
| 0.8742871285982006 | 0.469 |
| -0.7519533840136281 | 0.469 |
| 0.8041165932839989 | 0.469 |
| -0.9973896303135968 | 0.47 |
| -0.9586894055831183 | 0.47 |
| -0.7849116546023568 | 0.47 |
| 0.9555077224123572 | 0.47 |
| 0.9573889794921929 | 0.47 |
| 0.2743366120599515 | 0.471 |
| 0.9830075576961775 | 0.471 |
| 0.06506559712350708 | 0.471 |
| 0.46153929633150464 | 0.471 |
| 0.9996568487596547 | 0.471 |
| -0.8538399595459897 | 0.472 |
| -0.05809524974805863 | 0.472 |
| 0.2809392409691449 | 0.472 |
| 0.7489505899405993 | 0.472 |
| -0.9840165742044341 | 0.472 |
| -0.247601579187666 | 0.473 |
| 0.9194240244115167 | 0.473 |
| 0.9689288215884239 | 0.473 |
| 0.42277695974890234 | 0.473 |
| -0.1989134013199821 | 0.473 |
| 0.4608154723811236 | 0.474 |
| -0.9919344408024698 | 0.474 |
| -0.25199826431044287 | 0.474 |
| 0.0740781524272906 | 0.474 |
| -0.8827471313162588 | 0.474 |
| -0.8602238388855146 | 0.475 |
| 0.9993922496198296 | 0.475 |
| 0.5692877695784065 | 0.475 |
| -0.9924734352702412 | 0.475 |
| -0.9973879779666465 | 0.475 |
| 0.35269697948233464 | 0.476 |
| -0.8139785894967616 | 0.476 |
| -0.9356014581225767 | 0.476 |
| -0.8731795533399441 | 0.476 |
| 0.9543089472320513 | 0.476 |
| 0.003136796023662639 | 0.477 |
| -0.16457386919755737 | 0.477 |
| 0.5683822238004665 | 0.477 |
| 0.4977276765993608 | 0.477 |
| 0.9997457866373056 | 0.477 |
| -0.37888723873998126 | 0.478 |
| -0.0018166599421210652 | 0.478 |
| 0.6581316006200356 | 0.478 |
| -0.8543959024483342 | 0.478 |
| -0.041178651932945974 | 0.478 |
| 0.9508117643516961 | 0.479 |
| -0.7787739170634024 | 0.479 |
| -0.5843338304385515 | 0.479 |
| -0.06852908445128675 | 0.479 |
| -0.6947509869489269 | 0.479 |
| -0.9895381242731706 | 0.48 |
| -0.4083020217540519 | 0.48 |
| 0.27645944850144033 | 0.48 |
| -0.19661466399706565 | 0.48 |
| 0.38739494126802787 | 0.48 |
| -0.1591100097262193 | 0.481 |
| -0.24585174399482299 | 0.481 |
| -0.490926398753958 | 0.481 |
| -0.5275351297983185 | 0.481 |
| 0.999746715871402 | 0.481 |
| -0.14900886519644768 | 0.482 |
| -0.9282289671307147 | 0.482 |
| -0.5586318306339494 | 0.482 |
| -0.7849591347073847 | 0.482 |
| -0.35356352450111084 | 0.482 |
| -0.9787023925543774 | 0.483 |
| -0.33428389864249164 | 0.483 |
| -0.9989357639513677 | 0.483 |
| 0.755035388009233 | 0.483 |
| -0.8559165032535115 | 0.483 |
| 0.6370473501466553 | 0.484 |
| 0.9385268644600047 | 0.484 |
| 0.059304620734060245 | 0.484 |
| 0.17316358446969754 | 0.484 |
| 0.8968384459831211 | 0.484 |
| -0.748828822184965 | 0.485 |
| 0.34549283544519976 | 0.485 |
| -0.844116126298958 | 0.485 |
| 0.5065801482638599 | 0.485 |
| -0.991436509519727 | 0.485 |
| 0.8905074307907233 | 0.486 |
| -0.975078884788691 | 0.486 |
| -0.7512576687541965 | 0.486 |
| 0.2920328764117268 | 0.486 |
| -0.9262264134450864 | 0.486 |
| -0.24212806194444797 | 0.487 |
| -0.43059825878738267 | 0.487 |
| -0.4718170737793869 | 0.487 |
| -0.7840010967627883 | 0.487 |
| 0.8085365389954597 | 0.487 |
| -0.4682201093949648 | 0.488 |
| 0.405080091671208 | 0.488 |
| -0.5579690542094935 | 0.488 |
| -0.2752671132042285 | 0.488 |
| -0.11436660967163802 | 0.488 |
| -0.19311578161425047 | 0.489 |
| -0.9781493575556519 | 0.489 |
| 0.6652400116587859 | 0.489 |
| -0.810084861780623 | 0.489 |
| -0.9963653165546825 | 0.489 |
| -0.8125187170521768 | 0.49 |
| 0.6604726598374959 | 0.49 |
| 0.2835647738915305 | 0.49 |
| 0.8224741235300471 | 0.49 |
| -0.8696807581243431 | 0.49 |
| -0.34942847042933695 | 0.491 |
| 0.9746086399771088 | 0.491 |
| 0.9920866823479533 | 0.491 |
| -0.7209563414317036 | 0.491 |
| 0.04771352206771077 | 0.491 |
| 0.6179916060961615 | 0.492 |
| -0.8237612044170362 | 0.492 |
| -0.9471136396763887 | 0.492 |
| -0.3366654158310699 | 0.492 |
| 0.056958242611265135 | 0.492 |
| -0.6172217465100753 | 0.493 |
| 0.8266158791239467 | 0.493 |
| -0.38215021549434774 | 0.493 |
| 0.8546933434885314 | 0.493 |
| 0.2865129342297524 | 0.493 |
| -0.8710967585787144 | 0.494 |
| 0.8503350330620248 | 0.494 |
| -0.8458052967591271 | 0.494 |
| 0.8450686713518208 | 0.494 |
| 0.2737723439471184 | 0.494 |
| -0.9994831429409345 | 0.495 |
| 0.9029275216427157 | 0.495 |
| 0.3374288884201227 | 0.495 |
| 0.9542744375609593 | 0.495 |
| 0.5268240311238724 | 0.495 |
| -0.8880039922304019 | 0.496 |
| 0.04620603900688091 | 0.496 |
| 0.11744070721261532 | 0.496 |
| 0.6673571858546512 | 0.496 |
| 0.9780045390842413 | 0.496 |
| 0.7677766599388395 | 0.497 |
| 0.4608336773813019 | 0.497 |
| 0.6982021736491151 | 0.497 |
| 0.4383415504841655 | 0.497 |
| 0.3576868198145368 | 0.497 |
| -0.5261255883323005 | 0.498 |
| 0.3819644196789246 | 0.498 |
| -0.5919475650382979 | 0.498 |
| 0.9557893490815828 | 0.498 |
| 0.8751900239453216 | 0.498 |
| -0.8804033543460227 | 0.499 |
| 0.9453992661450408 | 0.499 |
| 0.9900514054577705 | 0.499 |
| 0.7025424162876126 | 0.499 |
| 0.639302244688411 | 0.499 |
| 0.46645737399796167 | 0.5 |
| 0.8525030474377576 | 0.5 |
| 0.3930415960182437 | 0.5 |
| -0.315301217263292 | 0.5 |
| -0.8992696529140439 | 0.5 |
| -0.5027347710351601 | 0.501 |
| 0.4520042699300903 | 0.501 |
| 0.6509458699299893 | 0.501 |
| 0.9991991220701878 | 0.501 |
| -0.38171686324316667 | 0.501 |
| -0.7837746236724682 | 0.502 |
| 0.9574865926707045 | 0.502 |
| 0.9217893297462871 | 0.502 |
| 0.539108201248313 | 0.502 |
| 0.16050294427946224 | 0.502 |
| 0.9947698649410344 | 0.503 |
| 0.9229437317994336 | 0.503 |
| -0.7341342463404794 | 0.503 |
| -0.8183995541888714 | 0.503 |
| -0.9913274288118904 | 0.503 |
| 0.999998935037316 | 0.504 |
| 0.44241610038626056 | 0.504 |
| -0.49958332454796767 | 0.504 |
| -0.42280296959425145 | 0.504 |
| -0.85459369519471 | 0.504 |
| 0.2878910673471666 | 0.505 |
| -0.9253304007384388 | 0.505 |
| 0.5512088575210707 | 0.505 |
| 0.9409438077948068 | 0.505 |
| 0.9925592758213985 | 0.505 |
| -0.9998609150438749 | 0.506 |
| -0.9099663829899521 | 0.506 |
| 0.41461400548263105 | 0.506 |
| -0.29780775144964583 | 0.506 |
| -0.859335361011204 | 0.506 |
| -0.9623314319809959 | 0.507 |
| -0.4768996630393425 | 0.507 |
| 0.7414167641625289 | 0.507 |
| 0.290964028056939 | 0.507 |
| -0.3806394832238485 | 0.507 |
| -0.655210689755114 | 0.508 |
| -0.45012607249532377 | 0.508 |
| -0.42255189085595674 | 0.508 |
| 0.97168558661393 | 0.508 |
| -0.33657466748329357 | 0.508 |
| 0.6991049856089373 | 0.509 |
| 0.384185763630685 | 0.509 |
| -0.1954622899920676 | 0.509 |
| -0.08007203175412247 | 0.509 |
| -0.5372785369394675 | 0.509 |
| 0.8941187034540153 | 0.51 |
| 0.9995508165205799 | 0.51 |
| 0.8349893071715384 | 0.51 |
| -0.3953494999077558 | 0.51 |
| -0.8739260459667048 | 0.51 |
| 0.6921480716508436 | 0.511 |
| -0.8159811269600693 | 0.511 |
| 0.20907850524000426 | 0.511 |
| -0.5109723917725979 | 0.511 |
| -0.04266621647772183 | 0.511 |
| -0.30457189774368154 | 0.512 |
| -0.21698058669501755 | 0.512 |
| 0.9018470381436215 | 0.512 |
| -0.9837051467816866 | 0.512 |
| -0.5066029838104238 | 0.512 |
| 0.41995369897141427 | 0.513 |
| 0.9655788995157235 | 0.513 |
| 0.5681340447885781 | 0.513 |
| 0.8944925720965505 | 0.513 |
| 0.40977030815540116 | 0.513 |
| 0.7435863609661546 | 0.514 |
| -0.5685590248084395 | 0.514 |
| 0.9613748978574453 | 0.514 |
| -0.9437292621224659 | 0.514 |
| 0.9976411995942877 | 0.514 |
| 0.40137425631704216 | 0.515 |
| -0.993615522746672 | 0.515 |
| -0.9770760222874794 | 0.515 |
| 0.20987222540559347 | 0.515 |
| -0.9893366590928195 | 0.515 |
| -0.0690331735448143 | 0.516 |
| 0.23526291504069696 | 0.516 |
| -0.5288264134473982 | 0.516 |
| -0.7558326181614935 | 0.516 |
| -0.8889170802965733 | 0.516 |
| 0.23316949474788182 | 0.517 |
| -0.20037061281607732 | 0.517 |
| 0.510736556806866 | 0.517 |
| -0.9100659903228565 | 0.517 |
| -0.2104586593131859 | 0.517 |
| -0.9265719215511493 | 0.518 |
| -0.09003530487598292 | 0.518 |
| -0.8230651031729626 | 0.518 |
| -0.43818065745700013 | 0.518 |
| -0.8630816447312019 | 0.518 |
| -0.8059513686507123 | 0.519 |
| -0.010489840741438035 | 0.519 |
| -0.9812565096863701 | 0.519 |
| 0.9266192301646954 | 0.519 |
| 0.9827213704524735 | 0.519 |
| 0.13648827536982786 | 0.52 |
| 0.8013291234061127 | 0.52 |
| -0.2880397647895196 | 0.52 |
| -0.43236887410406943 | 0.52 |
| 0.5468800093034462 | 0.52 |
| -0.9290178547390338 | 0.521 |
| -0.020961261517679193 | 0.521 |
| -0.8752744955949333 | 0.521 |
| 0.9999766517941108 | 0.521 |
| 0.1630856283186501 | 0.521 |
| -0.7937119769364509 | 0.522 |
| 0.9741827982076089 | 0.522 |
| -0.43367399441864296 | 0.522 |
| -0.9690307048108814 | 0.522 |
| -0.09261515083857226 | 0.522 |
| -0.7952100425290038 | 0.523 |
| 0.9646206443675819 | 0.523 |
| 0.13702942880276467 | 0.523 |
| 0.3906527169209846 | 0.523 |
| 0.6251709209884562 | 0.523 |
| -0.3296815338502681 | 0.524 |
| 0.5814161199827886 | 0.524 |
| -0.04073913086658057 | 0.524 |
| 0.7316779711221468 | 0.524 |
| -0.9913051653766894 | 0.524 |
| 0.8019127088766282 | 0.525 |
| -0.7306518032651756 | 0.525 |
| -0.9699362021888721 | 0.525 |
| 0.8291630986274313 | 0.525 |
| 0.9534637963700756 | 0.525 |
| 0.7634879654395587 | 0.526 |
| -0.9610667585450742 | 0.526 |
| -0.12968065802088216 | 0.526 |
| 0.6516958200596866 | 0.526 |
| 0.1311190073239476 | 0.526 |
| -0.9198670909193349 | 0.527 |
| 0.42063697167923214 | 0.527 |
| -0.2690218270275853 | 0.527 |
| -0.9657854646754173 | 0.527 |
| -0.5245236082640738 | 0.527 |
| 0.718774799207249 | 0.528 |
| -0.8215611583543495 | 0.528 |
| 0.999181342860791 | 0.528 |
| 0.989567104604563 | 0.528 |
| 0.989020251181173 | 0.528 |
| 0.8282299140819889 | 0.529 |
| -0.7081005712919424 | 0.529 |
| 0.8406392594624682 | 0.529 |
| -0.5214122651081853 | 0.529 |
| 0.7015220723738342 | 0.529 |
| -0.6465938120166924 | 0.53 |
| -0.9078061020817322 | 0.53 |
| -0.687021928183598 | 0.53 |
| -0.9994965944201574 | 0.53 |
| 0.644741394802788 | 0.53 |
| 0.11913140258027151 | 0.531 |
| 0.9733686086364673 | 0.531 |
| -0.33242776861819273 | 0.531 |
| -0.6958187802240139 | 0.531 |
| -0.9834947092214582 | 0.531 |
| -0.6280821598727728 | 0.532 |
| -0.9606929162564284 | 0.532 |
| 0.625621566943203 | 0.532 |
| -0.2622997021864006 | 0.532 |
| 0.8783069545166021 | 0.532 |
| 0.14041589230033896 | 0.533 |
| 0.13408619640465316 | 0.533 |
| 0.9957492878268026 | 0.533 |
| 0.8980083569499934 | 0.533 |
| -0.26015447882106046 | 0.533 |
| 0.8241148872841005 | 0.534 |
| -0.10849134594043225 | 0.534 |
| 0.9925629699485603 | 0.534 |
| -0.9761633389624149 | 0.534 |
| 0.7144972166333383 | 0.534 |
| -0.7852044949237794 | 0.535 |
| -0.9375883048937363 | 0.535 |
| 0.9866187656781552 | 0.535 |
| -0.12804772541320397 | 0.535 |
| 0.4320798221577545 | 0.535 |
| -0.016108912974183816 | 0.536 |
| 0.9565165176934546 | 0.536 |
| -0.22901417017758077 | 0.536 |
| -0.7713368664333884 | 0.536 |
| -0.9152350215407662 | 0.536 |
| 0.23712446296125567 | 0.537 |
| 0.7181684557001194 | 0.537 |
| -0.7045067052217485 | 0.537 |
| -0.8919167189134017 | 0.537 |
| 0.7586538121084705 | 0.537 |
| -0.995609910387858 | 0.538 |
| -0.6263019130785067 | 0.538 |
| 0.7480253783441374 | 0.538 |
| -0.7860433871700855 | 0.538 |
| -0.973333568668364 | 0.538 |
| -0.918817666156849 | 0.539 |
| -0.33623786598811317 | 0.539 |
| -0.2673867448121406 | 0.539 |
| -0.37478232377803833 | 0.539 |
| 0.9918980391619514 | 0.539 |
| -0.8808963351016234 | 0.54 |
| -0.13813228279797504 | 0.54 |
| -0.9398537846532675 | 0.54 |
| -0.5304187625933211 | 0.54 |
| -0.7120127146574614 | 0.54 |
| 0.24887423088038194 | 0.541 |
| -0.733597684364566 | 0.541 |
| -0.691226860304131 | 0.541 |
| 0.8940304356198724 | 0.541 |
| 0.9212019496815937 | 0.541 |
| -0.9193851966958728 | 0.542 |
| 0.9081067461904119 | 0.542 |
| -0.6349583878127362 | 0.542 |
| 0.942608313965508 | 0.542 |
| 0.4832276889511443 | 0.542 |
| -0.9577724740618294 | 0.543 |
| -0.5176008251148907 | 0.543 |
| -0.8680484589261036 | 0.543 |
| -0.5366957381859815 | 0.543 |
| 0.36110885265345044 | 0.543 |
| -0.7909431311554553 | 0.544 |
| -0.5290134548262958 | 0.544 |
| 0.360217671427913 | 0.544 |
| 0.9997759723255569 | 0.544 |
| -0.7053754995795657 | 0.544 |
| 0.6706046442342011 | 0.545 |
| -0.07034388619377947 | 0.545 |
| 0.3186362663017233 | 0.545 |
| 0.9896379208684777 | 0.545 |
| 0.3794827330135412 | 0.545 |
| -0.22323460992497743 | 0.546 |
| -0.9443692394918848 | 0.546 |
| 0.6013261223303049 | 0.546 |
| -0.9976364805252701 | 0.546 |
| -0.1434086024214763 | 0.546 |
| -0.706155794400638 | 0.547 |
| -0.22814848351184103 | 0.547 |
| -0.44796996774284287 | 0.547 |
| -0.4301428492754489 | 0.547 |
| 0.615617657499952 | 0.547 |
| 0.2313680023879081 | 0.548 |
| -0.09184025880994591 | 0.548 |
| 0.9838615491660669 | 0.548 |
| -0.45659230225491443 | 0.548 |
| -0.9414089357369613 | 0.548 |
| 0.798170155391184 | 0.549 |
| -0.40842150731971305 | 0.549 |
| 0.9483637892721173 | 0.549 |
| 0.9914984026235086 | 0.549 |
| 0.12447078979975508 | 0.549 |
| 0.09491088770570649 | 0.55 |
| -0.6672171888412435 | 0.55 |
| -0.42497841498064076 | 0.55 |
| 0.7704956880033511 | 0.55 |
| -0.48215390443128464 | 0.55 |
| 0.4318454860705317 | 0.551 |
| -0.7791281533254568 | 0.551 |
| -0.9561447988720073 | 0.551 |
| 0.9989520524065095 | 0.551 |
| 0.9740139970921861 | 0.551 |
| -0.005952890033173306 | 0.552 |
| -0.4136356933332322 | 0.552 |
| 0.9958872861734858 | 0.552 |
| -0.7315740298177026 | 0.552 |
| 0.25966699175935065 | 0.552 |
| 0.13318401913845884 | 0.553 |
| -0.004084640914305209 | 0.553 |
| 0.9795308542554179 | 0.553 |
| 0.9750705859466758 | 0.553 |
| 0.505162342746269 | 0.553 |
| 0.42127152360247616 | 0.554 |
| 0.8113954512567516 | 0.554 |
| 0.5469927217802465 | 0.554 |
| -0.39290682933956206 | 0.554 |
| -0.45150952628890456 | 0.554 |
| 0.5585956733417304 | 0.555 |
| 0.9625289866950641 | 0.555 |
| -0.9986769185764706 | 0.555 |
| -0.9011205166653906 | 0.555 |
| 0.5272707910863933 | 0.555 |
| -0.6097984252067149 | 0.556 |
| 0.11779206619197792 | 0.556 |
| -0.48385970084812524 | 0.556 |
| 0.7078811656669044 | 0.556 |
| -0.8343534138831831 | 0.556 |
| 0.06538855085117327 | 0.557 |
| 0.9997029520925758 | 0.557 |
| -0.4352094802781335 | 0.557 |
| -0.24986605113483176 | 0.557 |
| 0.0040777038453481 | 0.557 |
| -0.21943829971552875 | 0.558 |
| 0.6491876767856104 | 0.558 |
| 0.9013879971862577 | 0.558 |
| 0.2457438412582742 | 0.558 |
| 0.9488632235835125 | 0.558 |
| -0.801558590946426 | 0.559 |
| -0.555466053973938 | 0.559 |
| -0.6878506110870101 | 0.559 |
| 0.846953942786437 | 0.559 |
| 0.20510738344151364 | 0.559 |
| 0.49471090328596595 | 0.56 |
| -0.8252345325145035 | 0.56 |
| 0.4699169579689022 | 0.56 |
| 0.9385832160970679 | 0.56 |
| -0.7234719560722223 | 0.56 |
| -0.20937298041026028 | 0.561 |
| 0.5953915350893361 | 0.561 |
| 0.8453357435728441 | 0.561 |
| 0.9800101442177424 | 0.561 |
| -0.9199874084619435 | 0.561 |
| 0.14266187282411377 | 0.562 |
| 0.9559440342199736 | 0.562 |
| 0.9902783274742297 | 0.562 |
| -0.05908200031600208 | 0.562 |
| -0.6053624234223224 | 0.562 |
| -0.6607485136720352 | 0.563 |
| 0.2996391918534554 | 0.563 |
| -0.257084364455271 | 0.563 |
| -0.7757425997673174 | 0.563 |
| 0.9068877449682459 | 0.563 |
| 0.9895204513709216 | 0.564 |
| 0.7947110718879711 | 0.564 |
| 0.8644266073462409 | 0.564 |
| -0.6954099393552371 | 0.564 |
| 0.9381823257534477 | 0.564 |
| 0.9506096504159243 | 0.565 |
| 0.9268475051889912 | 0.565 |
| -0.7903941081437459 | 0.565 |
| 0.4935643258994619 | 0.565 |
| -0.5473472296156838 | 0.565 |
| -0.09076054677219317 | 0.566 |
| 0.8101808776391979 | 0.566 |
| -0.4582535595723481 | 0.566 |
| -0.6902124016665512 | 0.566 |
| 0.7144455210321107 | 0.566 |
| -0.18951486076784935 | 0.567 |
| 0.8183283653718895 | 0.567 |
| 0.7431165138048846 | 0.567 |
| 0.9975748984356332 | 0.567 |
| -0.10323208432765198 | 0.567 |
| -0.929714615814149 | 0.568 |
| 0.9432702386195444 | 0.568 |
| -0.6600057891785331 | 0.568 |
| 0.030723095674577733 | 0.568 |
| 0.06456468058022109 | 0.568 |
| -0.5597824955429762 | 0.569 |
| -0.9208669304114122 | 0.569 |
| 0.9994024892770698 | 0.569 |
| -0.43145977837866806 | 0.569 |
| -0.5091837948410417 | 0.569 |
| 0.5162778148346241 | 0.57 |
| 0.308239983067943 | 0.57 |
| 0.5362291088079567 | 0.57 |
| 0.48411514113760945 | 0.57 |
| -0.6238002194140616 | 0.57 |
| -0.9590095126627771 | 0.571 |
| 0.15193940809751552 | 0.571 |
| -0.9920610852245928 | 0.571 |
| -0.5265711148849528 | 0.571 |
| 0.9520852526276509 | 0.571 |
| 0.5093449359639467 | 0.572 |
| 0.9943187601952713 | 0.572 |
| -0.6285956700387084 | 0.572 |
| 0.6018380321277798 | 0.572 |
| -0.7142997847454743 | 0.572 |
| -0.08383897186884612 | 0.573 |
| -0.45145040745312687 | 0.573 |
| -0.9602185138933677 | 0.573 |
| 0.7475491622719955 | 0.573 |
| 0.9999652957559444 | 0.573 |
| -0.9843037424735543 | 0.574 |
| 0.07403488572961567 | 0.574 |
| -0.7892529659212725 | 0.574 |
| -0.9652373384232067 | 0.574 |
| -0.4496904085873544 | 0.574 |
| -0.9987072995104409 | 0.575 |
| 0.8644303544778048 | 0.575 |
| 0.6986268233695577 | 0.575 |
| 0.9698635782509637 | 0.575 |
| 0.46550991000087116 | 0.575 |
| 0.5984095745303804 | 0.576 |
| -0.960609545705526 | 0.576 |
| 0.5540831396032604 | 0.576 |
| 0.7462192566270472 | 0.576 |
| -0.8964875493620805 | 0.576 |
| 0.9447651088870783 | 0.577 |
| -0.824681579555491 | 0.577 |
| -0.27421033963727687 | 0.577 |
| -0.06935415906199592 | 0.577 |
| -0.7046475898593996 | 0.577 |
| -0.6659964653885635 | 0.578 |
| -0.9935137614627461 | 0.578 |
| -0.586735281426834 | 0.578 |
| -0.8111001684648512 | 0.578 |
| -0.9999744818233631 | 0.578 |
| 0.47054054758402236 | 0.579 |
| 0.47778873305900504 | 0.579 |
| 0.9101951912679166 | 0.579 |
| -0.2668408435714911 | 0.579 |
| -0.8497499381934501 | 0.579 |
| -0.52217323460951 | 0.58 |
| 0.4992804980813757 | 0.58 |
| 0.7202609903853223 | 0.58 |
| 0.6017906000489777 | 0.58 |
| -0.9877077384171835 | 0.58 |
| -0.7222632207659091 | 0.581 |
| 0.7986309739612085 | 0.581 |
| 0.5065982333359154 | 0.581 |
| -0.6636650332520445 | 0.581 |
| -0.7715486212854502 | 0.581 |
| 0.9371570003560021 | 0.582 |
| 0.9778761463895643 | 0.582 |
| 0.84990664780507 | 0.582 |
| 0.6522583119289755 | 0.582 |
| -0.6800563901585286 | 0.582 |
| 0.32886213769652434 | 0.583 |
| 0.9139277525062277 | 0.583 |
| 0.9228194922957114 | 0.583 |
| 0.9062637252103313 | 0.583 |
| -0.9582244216248035 | 0.583 |
| -0.4084415039030733 | 0.584 |
| -0.9600369141646411 | 0.584 |
| 0.3234657115544868 | 0.584 |
| 0.9814634834208409 | 0.584 |
| 0.9576083155636508 | 0.584 |
| 0.22844879798997664 | 0.585 |
| 0.847291149077627 | 0.585 |
| -0.6645736244660828 | 0.585 |
| 0.5987817023049671 | 0.585 |
| -0.5720390009705328 | 0.585 |
| -0.8563838760159973 | 0.586 |
| -0.38950223046456683 | 0.586 |
| 0.27486260558168796 | 0.586 |
| -0.9960541473791144 | 0.586 |
| -0.9250913826528505 | 0.586 |
| -0.6901128921535048 | 0.587 |
| 0.9924530404329589 | 0.587 |
| -0.9573799188588257 | 0.587 |
| -0.3105862432650588 | 0.587 |
| -0.9990571714085665 | 0.587 |
| -0.8463778943591108 | 0.588 |
| -0.46962149511097134 | 0.588 |
| 0.654201977557542 | 0.588 |
| -0.11078531732596578 | 0.588 |
| 0.7668296921330585 | 0.588 |
| 0.772766549771169 | 0.589 |
| 0.9017912204999938 | 0.589 |
| -0.993916448054319 | 0.589 |
| 0.3573102053083419 | 0.589 |
| 0.16719870725117314 | 0.589 |
| -0.007523034020094317 | 0.59 |
| -0.5378160139776395 | 0.59 |
| -0.5220531874590091 | 0.59 |
| 0.8482579713868358 | 0.59 |
| -0.46172236441958364 | 0.59 |
| 0.47124144007977625 | 0.591 |
| -0.3260593032703487 | 0.591 |
| -0.3507931936943992 | 0.591 |
| -0.7103489253437026 | 0.591 |
| 0.19339259104528253 | 0.591 |
| 0.7869304669897793 | 0.592 |
| 0.8842983375285512 | 0.592 |
| 0.1797869965140766 | 0.592 |
| 0.01776496615938398 | 0.592 |
| -0.9622959652837666 | 0.592 |
| 0.4324082100239338 | 0.593 |
| 0.44136926424538653 | 0.593 |
| 0.9714423971659998 | 0.593 |
| -0.942607194477857 | 0.593 |
| -0.3217558121137821 | 0.593 |
| 0.9484165128222799 | 0.594 |
| 0.42661478330348923 | 0.594 |
| 0.6684497321789793 | 0.594 |
| 0.9773179476730527 | 0.594 |
| -0.34534178718252967 | 0.594 |
| -0.9755305865036067 | 0.595 |
| 0.2253776276790082 | 0.595 |
| -0.6735499109978592 | 0.595 |
| -0.5872478364246353 | 0.595 |
| -0.9692519056089505 | 0.595 |
| -0.9995722596478666 | 0.596 |
| -0.9915202937171234 | 0.596 |
| -0.6754057689460984 | 0.596 |
| -0.15227378467063937 | 0.596 |
| -0.9880396668050091 | 0.596 |
| -0.3415224206813119 | 0.597 |
| -0.8099303696141926 | 0.597 |
| -0.9303614264142887 | 0.597 |
| -0.4811377803006489 | 0.597 |
| 0.1637610674719605 | 0.597 |
| 0.11232616715306927 | 0.598 |
| 0.3992326531852054 | 0.598 |
| 0.5127549347210579 | 0.598 |
| 0.6289891942135364 | 0.598 |
| 0.9807009707446604 | 0.598 |
| -0.4847136675150801 | 0.599 |
| -0.20908902074171323 | 0.599 |
| -0.7222340530023207 | 0.599 |
| 0.9627592662583916 | 0.599 |
| 0.2158832011328446 | 0.599 |
| 0.600821034758632 | 0.6 |
| 0.9998905602205396 | 0.6 |
| -0.8095371638774175 | 0.6 |
| -0.9225012574113565 | 0.6 |
| -0.17011510158479276 | 0.6 |
| -0.001920185623143884 | 0.601 |
| -0.17579869376055296 | 0.601 |
| 0.7699305752487633 | 0.601 |
| -0.05332435933095055 | 0.601 |
| 0.4736706772505308 | 0.601 |
| -0.9341726468437579 | 0.602 |
| -0.4606842240053698 | 0.602 |
| -0.20110838471458564 | 0.602 |
| -0.5494787460226754 | 0.602 |
| 0.5619171940891398 | 0.602 |
| 0.9667165930914101 | 0.603 |
| 0.1786611469281957 | 0.603 |
| 0.8065988036125444 | 0.603 |
| -0.7100581629765254 | 0.603 |
| -0.5161679630966728 | 0.603 |
| -0.544933512515666 | 0.604 |
| 0.8597391092411192 | 0.604 |
| 0.990556077466508 | 0.604 |
| 0.7391556023266682 | 0.604 |
| -0.5086993676458476 | 0.604 |
| -0.41465989695043365 | 0.605 |
| 0.8180515079593025 | 0.605 |
| 0.9770288870131735 | 0.605 |
| -0.28029796814632224 | 0.605 |
| 0.1400950301722077 | 0.605 |
| 0.8046999750255445 | 0.606 |
| -0.9089608031468487 | 0.606 |
| 0.5625662925709429 | 0.606 |
| 0.8899138260678875 | 0.606 |
| 0.8992995305918898 | 0.606 |
| 0.9991006492328016 | 0.607 |
| -0.8060489922444377 | 0.607 |
| 0.36605895698374313 | 0.607 |
| 0.5472412440108925 | 0.607 |
| -0.4324924808756792 | 0.607 |
| -0.329762510012827 | 0.608 |
| 0.9750145452706471 | 0.608 |
| -0.07333925751273765 | 0.608 |
| 0.9560043439701976 | 0.608 |
| -0.564694570683418 | 0.608 |
| -0.6142531576153941 | 0.609 |
| 0.9554637554209011 | 0.609 |
| 0.7689613641830179 | 0.609 |
| -0.9695609863774967 | 0.609 |
| 0.46683029345046523 | 0.609 |
| -0.7781316690059328 | 0.61 |
| -0.3659405380617452 | 0.61 |
| 0.10882430488659707 | 0.61 |
| 0.998121762337336 | 0.61 |
| -0.5731038118090983 | 0.61 |
| -0.04575193602750025 | 0.611 |
| 0.8272092451183577 | 0.611 |
| 0.693532966815739 | 0.611 |
| 0.6686388978741933 | 0.611 |
| 0.7918849777302241 | 0.611 |
| -0.24760054979367427 | 0.612 |
| -0.9610966386762916 | 0.612 |
| -0.012454959022086215 | 0.612 |
| -0.8992382119138864 | 0.612 |
| 0.9853485531180988 | 0.612 |
| 0.14166498821650395 | 0.613 |
| 0.7968188661234437 | 0.613 |
| 0.7237360618167558 | 0.613 |
| -0.9957336904486663 | 0.613 |
| -0.7118307256378206 | 0.613 |
| 0.31940763464653044 | 0.614 |
| -0.11249794489536115 | 0.614 |
| -0.5781708700082614 | 0.614 |
| 0.718949599278032 | 0.614 |
| -0.1390776964129435 | 0.614 |
| 0.7990300979528141 | 0.615 |
| 0.6724639485907413 | 0.615 |
| -0.9860314627869337 | 0.615 |
| -0.5789531308158682 | 0.615 |
| -0.34451493226192154 | 0.615 |
| 0.5888017099907409 | 0.616 |
| 0.5167610436574659 | 0.616 |
| -0.9476842310983372 | 0.616 |
| -0.9280976464883386 | 0.616 |
| -0.39496065042376144 | 0.616 |
| 0.39430686146321564 | 0.617 |
| 0.9725881475488923 | 0.617 |
| -0.9910080212258635 | 0.617 |
| 0.9974608763584706 | 0.617 |
| 0.13808798872464662 | 0.617 |
| -0.7836260197482724 | 0.618 |
| 0.970327798250679 | 0.618 |
| -0.184980744754763 | 0.618 |
| 0.9997089534239071 | 0.618 |
| -0.6648462122294841 | 0.618 |
| 0.6139062141377307 | 0.619 |
| -0.7804963612013873 | 0.619 |
| 0.8498782718846543 | 0.619 |
| 0.9688962658357239 | 0.619 |
| 0.9586037821412088 | 0.619 |
| -0.9551836126505305 | 0.62 |
| -0.7448661561415109 | 0.62 |
| -0.9846060335197205 | 0.62 |
| -0.9581098647425289 | 0.62 |
| -0.43111974111685847 | 0.62 |
| -0.1565008896443839 | 0.621 |
| -0.6627081792492975 | 0.621 |
| 0.47258492835596366 | 0.621 |
| 0.8692456255399527 | 0.621 |
| -0.5760889456388166 | 0.621 |
| 0.16325048802384395 | 0.622 |
| -0.3313981619434257 | 0.622 |
| -0.5654828884248508 | 0.622 |
| 0.5663519167654026 | 0.622 |
| 0.608535334225276 | 0.622 |
| -0.7768983426587079 | 0.623 |
| -0.28791536675668156 | 0.623 |
| 0.3155773686615123 | 0.623 |
| -0.959052001573954 | 0.623 |
| -0.0592456901728681 | 0.623 |
| -0.5043942044481324 | 0.624 |
| -0.5168722342104826 | 0.624 |
| 0.4925283305294685 | 0.624 |
| -0.2207278919244376 | 0.624 |
| 0.9936295393931804 | 0.624 |
| -0.9692066165832512 | 0.625 |
| -0.7009468143757325 | 0.625 |
| -0.9876131380593863 | 0.625 |
| -0.7230495372495462 | 0.625 |
| 0.9305796454855118 | 0.625 |
| 0.7375034617399013 | 0.626 |
| -0.6842251061283233 | 0.626 |
| 0.3918708185255563 | 0.626 |
| 0.5067486617216501 | 0.626 |
| -0.4878967522335125 | 0.626 |
| -0.09751371416545626 | 0.627 |
| 0.9928544984022623 | 0.627 |
| 0.9709267739617519 | 0.627 |
| -0.6450527073831477 | 0.627 |
| 0.7347728491184514 | 0.627 |
| -0.6887070994051289 | 0.628 |
| 0.25273266262964644 | 0.628 |
| 0.9985249736856677 | 0.628 |
| -0.3701929354410391 | 0.628 |
| -0.4587463215667652 | 0.628 |
| 0.564234216623872 | 0.629 |
| 0.44542606467420465 | 0.629 |
| 0.9697756933889868 | 0.629 |
| -0.6148658848961388 | 0.629 |
| 0.9986109550999196 | 0.629 |
| 0.5481280848935256 | 0.63 |
| -0.19384427813789185 | 0.63 |
| -0.40892976151196103 | 0.63 |
| -0.9036415565360947 | 0.63 |
| 0.9818659063914572 | 0.63 |
| 0.9443171453949291 | 0.631 |
| -0.7355517639333337 | 0.631 |
| 0.49660836472354064 | 0.631 |
| -0.9682612149178798 | 0.631 |
| 0.6607341834032016 | 0.631 |
| 0.8874649585301617 | 0.632 |
| -0.4159691704227914 | 0.632 |
| -0.7654620491641113 | 0.632 |
| -0.15361204258720626 | 0.632 |
| 0.9056696505467899 | 0.632 |
| -0.42694451800788114 | 0.633 |
| -0.32080913697795843 | 0.633 |
| -0.1247012804575031 | 0.633 |
| -0.4918770354481026 | 0.633 |
| -0.34961401141365156 | 0.633 |
| 0.9309871145384447 | 0.634 |
| -0.38932785289673416 | 0.634 |
| -0.9873721033316597 | 0.634 |
| 0.890785914686372 | 0.634 |
| -0.7546660145677109 | 0.634 |
| 0.9831010470107884 | 0.635 |
| 0.9553965608341466 | 0.635 |
| -0.8811813235822283 | 0.635 |
| -0.6919042935353505 | 0.635 |
| 0.9615685560698157 | 0.635 |
| -0.9786496128702427 | 0.636 |
| 0.9304542731593657 | 0.636 |
| -0.7366661503947528 | 0.636 |
| -0.9489095161124088 | 0.636 |
| 0.7687791713296828 | 0.636 |
| 0.9994632248351132 | 0.637 |
| 0.6333127580669314 | 0.637 |
| 0.9999987725505407 | 0.637 |
| -0.468279334953708 | 0.637 |
| 0.8655030392431355 | 0.637 |
| 0.2848450322293494 | 0.638 |
| 0.5887447641692216 | 0.638 |
| -0.5371369995524148 | 0.638 |
| 0.9178075684193563 | 0.638 |
| 0.38532312039977346 | 0.638 |
| -0.9944823937585812 | 0.639 |
| -0.8076511044609029 | 0.639 |
| 0.9550961751694825 | 0.639 |
| -0.486094864099469 | 0.639 |
| 0.9572958360292486 | 0.639 |
| 0.9816836712241843 | 0.64 |
| 0.945753890155553 | 0.64 |
| 0.8401124322664889 | 0.64 |
| -0.12943677895954983 | 0.64 |
| 0.49855396581456474 | 0.64 |
| -0.664640388812838 | 0.641 |
| -0.804041421336843 | 0.641 |
| 0.009085716692009657 | 0.641 |
| -0.8433034614896892 | 0.641 |
| -0.9957340472577856 | 0.641 |
| -0.5580910284175934 | 0.642 |
| 0.8579431372777934 | 0.642 |
| 0.16984313206629456 | 0.642 |
| -0.4721357112882758 | 0.642 |
| -0.058839557452479666 | 0.642 |
| 0.03374014357449712 | 0.643 |
| 0.18244643861025345 | 0.643 |
| 0.8995852009239971 | 0.643 |
| -0.060765863809226536 | 0.643 |
| -0.49362854336264 | 0.643 |
| -0.9233769164164155 | 0.644 |
| 0.08452536425229663 | 0.644 |
| -0.38512354305335067 | 0.644 |
| -0.9985048647321887 | 0.644 |
| 0.9871435280130745 | 0.644 |
| 0.9833857510277841 | 0.645 |
| 0.547365521041641 | 0.645 |
| -0.14203657430617053 | 0.645 |
| 0.14830718814660024 | 0.645 |
| 0.9996630955990542 | 0.645 |
| -0.0431791798133801 | 0.646 |
| -0.6885649673769494 | 0.646 |
| -0.7384440480892932 | 0.646 |
| 0.4459975292289854 | 0.646 |
| 0.9733124379474314 | 0.646 |
| -0.8854784452188211 | 0.647 |
| 0.3724548969488585 | 0.647 |
| -0.26521275813536316 | 0.647 |
| -0.699206202675478 | 0.647 |
| 0.9991427612074891 | 0.647 |
| 0.7364036054695298 | 0.648 |
| -0.9476036427563134 | 0.648 |
| -0.2974710326251525 | 0.648 |
| 0.37763236163441705 | 0.648 |
| -0.997330330498485 | 0.648 |
| -0.5666736326017043 | 0.649 |
| -0.9892776958850427 | 0.649 |
| -0.4289001600965326 | 0.649 |
| 0.8277418157072175 | 0.649 |
| 0.9790401379660915 | 0.649 |
| 0.4513229939706661 | 0.65 |
| -0.8931878679263978 | 0.65 |
| -0.8912974288093086 | 0.65 |
| 0.6226054688735223 | 0.65 |
| -0.7010824927406893 | 0.65 |
| -0.8595338618433762 | 0.651 |
| 0.8470650613017644 | 0.651 |
| -0.31467082829337223 | 0.651 |
| -0.3887536120566487 | 0.651 |
| 0.9616278310085873 | 0.651 |
| 0.7188292634246058 | 0.652 |
| -0.5229917427058743 | 0.652 |
| -0.9147171960805808 | 0.652 |
| 0.7279739275271725 | 0.652 |
| -0.8764906794914195 | 0.652 |
| 0.9502484833464913 | 0.653 |
| 0.30227777402192463 | 0.653 |
| 0.9392136948174156 | 0.653 |
| -0.6319852423256066 | 0.653 |
| -0.33920626904269097 | 0.653 |
| -0.10315123156722927 | 0.654 |
| -0.8632511680841441 | 0.654 |
| -0.956929071383559 | 0.654 |
| -0.7839122722429639 | 0.654 |
| 0.5538732497570845 | 0.654 |
| 0.997781379606758 | 0.655 |
| -0.7940810008539392 | 0.655 |
| -0.10591241823824009 | 0.655 |
| -0.9963132959423945 | 0.655 |
| -0.05118385386189453 | 0.655 |
| 0.2979927853726432 | 0.656 |
| 0.19360326812581538 | 0.656 |
| -0.5721105888313044 | 0.656 |
| 0.4383424341504913 | 0.656 |
| -0.31425667436803656 | 0.656 |
| -0.9956224424310657 | 0.657 |
| 0.9898520325837287 | 0.657 |
| -0.4009417920724573 | 0.657 |
| -0.503896016587413 | 0.657 |
| -0.49600778100505666 | 0.657 |
| -0.37879938975038485 | 0.658 |
| -0.9999962666319957 | 0.658 |
| -0.8011541834570289 | 0.658 |
| -0.9730957169512072 | 0.658 |
| 0.5495430544487597 | 0.658 |
| 0.9094323876436534 | 0.659 |
| 0.8296973292310252 | 0.659 |
| 0.9688816972363721 | 0.659 |
| -0.44965034185000985 | 0.659 |
| 0.8172668326582093 | 0.659 |
| -0.33476740419839884 | 0.66 |
| 0.38805690894538075 | 0.66 |
| 0.8009702090378397 | 0.66 |
| 0.9768696576889766 | 0.66 |
| 0.9956672921336885 | 0.66 |
| 0.7985536115506225 | 0.661 |
| 0.9437927681334575 | 0.661 |
| -0.9369703473139332 | 0.661 |
| 0.49451573069686683 | 0.661 |
| 0.6014844953047372 | 0.661 |
| 0.5739644329935338 | 0.662 |
| 0.9999437662653046 | 0.662 |
| -0.47332143328822857 | 0.662 |
| 0.5037560708448994 | 0.662 |
| 0.7048294897798119 | 0.662 |
| 0.44929722807891 | 0.663 |
| -0.5160162489224239 | 0.663 |
| 0.376086347093002 | 0.663 |
| 0.54668641725234 | 0.663 |
| 0.7634564936211627 | 0.663 |
| -0.9877666479235817 | 0.664 |
| 0.5102641877551881 | 0.664 |
| -0.6404139394685943 | 0.664 |
| -0.1267235003297055 | 0.664 |
| 0.9557236097977314 | 0.664 |
| 0.9929889285303113 | 0.665 |
| 0.8766827111235285 | 0.665 |
| -0.9578671899764901 | 0.665 |
| -0.5303400564496835 | 0.665 |
| -0.9826328489746121 | 0.665 |
| 0.048964269545377526 | 0.666 |
| -0.394484019292487 | 0.666 |
| -0.875857977994622 | 0.666 |
| -0.959679991094167 | 0.666 |
| -0.007437728788124675 | 0.666 |
| -0.9317622918860058 | 0.667 |
| 0.3705022499767999 | 0.667 |
| 0.19578356929276078 | 0.667 |
| -0.586717275951934 | 0.667 |
| 0.9910240747031827 | 0.667 |
| 0.32360297045871583 | 0.668 |
| -0.9727111696343528 | 0.668 |
| -0.6778490454899272 | 0.668 |
| 0.9111135727638014 | 0.668 |
| 0.6106897790451068 | 0.668 |
| -0.10593394035355745 | 0.669 |
| -0.5670463347300502 | 0.669 |
| -0.7731516801988334 | 0.669 |
| -0.9930726541267381 | 0.669 |
| -0.6845855359121225 | 0.669 |
| -0.7993305342739426 | 0.67 |
| 0.7332431244259331 | 0.67 |
| 0.9957133315254777 | 0.67 |
| 0.34426349529991956 | 0.67 |
| -0.7178508803897239 | 0.67 |
| -0.7503079817334966 | 0.671 |
| 0.33227704735800023 | 0.671 |
| 0.6711437092636143 | 0.671 |
| 0.7447697917981726 | 0.671 |
| 0.3678551518710265 | 0.671 |
| 0.9645393697744157 | 0.672 |
| -0.9404560955422233 | 0.672 |
| 0.2542094109359643 | 0.672 |
| 0.7239641022276515 | 0.672 |
| -0.7813011462327693 | 0.672 |
| -0.05638889437479032 | 0.673 |
| 0.08326108306748971 | 0.673 |
| -0.48190017310038796 | 0.673 |
| 0.999918921882514 | 0.673 |
| 0.8827201505937903 | 0.673 |
| 0.25719941236097593 | 0.674 |
| 0.7993819102788284 | 0.674 |
| -0.25527605341734105 | 0.674 |
| -0.9537005171795861 | 0.674 |
| 0.40413468969513894 | 0.674 |
| 0.9191668780974814 | 0.675 |
| -0.5652040595474378 | 0.675 |
| -0.8304555732272514 | 0.675 |
| 0.659411849548184 | 0.675 |
| -0.6156817764630821 | 0.675 |
| -0.9353024173325291 | 0.676 |
| -0.709420104941745 | 0.676 |
| 0.3334853632446464 | 0.676 |
| -0.22233392803994848 | 0.676 |
| 0.4537723204397869 | 0.676 |
| 0.4190691884331596 | 0.677 |
| -0.6797907670946131 | 0.677 |
| -0.7799354652703586 | 0.677 |
| -0.5781788613103962 | 0.677 |
| -0.14870646683658587 | 0.677 |
| -0.9644114381083287 | 0.678 |
| -0.8234554036787375 | 0.678 |
| -0.9802577845940744 | 0.678 |
| 0.07362145447737099 | 0.678 |
| 0.29338213808173147 | 0.678 |
| 0.2511452328665127 | 0.679 |
| 0.4206936476440646 | 0.679 |
| -0.9452214692304979 | 0.679 |
| 0.36567768898310654 | 0.679 |
| -0.7681950697911648 | 0.679 |
| -0.7336629103148168 | 0.68 |
| -0.16012268069184482 | 0.68 |
| 0.8774706642116613 | 0.68 |
| -0.761874536467675 | 0.68 |
| 0.39079408869938737 | 0.68 |
| 0.9373008502097726 | 0.681 |
| 0.8062407287757594 | 0.681 |
| -0.32867758403557984 | 0.681 |
| 0.9070377556209132 | 0.681 |
| 0.6570793718230528 | 0.681 |
| 0.9187045112140237 | 0.682 |
| 0.4993051945024932 | 0.682 |
| 0.029810306949329745 | 0.682 |
| 0.3534173446217039 | 0.682 |
| -0.054013287218853075 | 0.682 |
| -0.5544646763191156 | 0.683 |
| -0.7171326261520639 | 0.683 |
| -0.6520369260032708 | 0.683 |
| 0.952359103319077 | 0.683 |
| -0.9958172803070636 | 0.683 |
| -0.434735778888079 | 0.684 |
| 0.566850810231685 | 0.684 |
| -0.9731306308543265 | 0.684 |
| -0.7335648655210575 | 0.684 |
| 0.5231713015450492 | 0.684 |
| 0.3003485251179975 | 0.685 |
| -0.4393926735984254 | 0.685 |
| 0.6094475390722189 | 0.685 |
| 0.319732996615937 | 0.685 |
| 0.616576363279505 | 0.685 |
| -0.4978963288505296 | 0.686 |
| 0.9902477521270087 | 0.686 |
| 0.3339671986666227 | 0.686 |
| 0.9822829558543863 | 0.686 |
| 0.37892568290914147 | 0.686 |
| -0.8774007344183706 | 0.687 |
| -0.07913727414388284 | 0.687 |
| 0.33044490342236127 | 0.687 |
| -0.7754796958719288 | 0.687 |
| 0.9729295366511606 | 0.687 |
| -0.9855325383401323 | 0.688 |
| -0.7200978892472314 | 0.688 |
| 0.5076377505049896 | 0.688 |
| 0.1286253660383208 | 0.688 |
| -0.34673486985003343 | 0.688 |
| -0.9866186669421576 | 0.689 |
| 0.19274916119077842 | 0.689 |
| -0.026635808123072337 | 0.689 |
| 0.7620786671945812 | 0.689 |
| 0.6165826202970562 | 0.689 |
| 0.22267316198657067 | 0.69 |
| 0.4898692987715985 | 0.69 |
| -0.7212288589067795 | 0.69 |
| -0.7975198490219305 | 0.69 |
| -0.9140425443013933 | 0.69 |
| 0.14598676900680363 | 0.691 |
| 0.7779550639524385 | 0.691 |
| -0.5478922237156378 | 0.691 |
| -0.9545699787937708 | 0.691 |
| -0.822467926159659 | 0.691 |
| 0.4925199354707899 | 0.692 |
| -0.10427072103478525 | 0.692 |
| -0.15078971979493697 | 0.692 |
| 0.9709364687170777 | 0.692 |
| -0.3531082457066369 | 0.692 |
| 0.9447830459264658 | 0.693 |
| -0.9410428414455756 | 0.693 |
| -0.9832473250135948 | 0.693 |
| -0.7834638518707179 | 0.693 |
| 0.6900358971808989 | 0.693 |
| 0.7482435465398211 | 0.694 |
| -0.9758982332199398 | 0.694 |
| 0.9190596861141163 | 0.694 |
| -0.5064712971113223 | 0.694 |
| -0.6637362631527896 | 0.694 |
| 0.8271596028451549 | 0.695 |
| -0.9626894528066504 | 0.695 |
| -0.8377977501525627 | 0.695 |
| -0.8242627087770744 | 0.695 |
| 0.8782049258265618 | 0.695 |
| 0.9996671451881307 | 0.696 |
| 0.26774736360271734 | 0.696 |
| 0.7604355316544491 | 0.696 |
| 0.6149637991956374 | 0.696 |
| 0.3999243627941815 | 0.696 |
| 0.6114526424511204 | 0.697 |
| 0.1030740737691758 | 0.697 |
| -0.3709566642517949 | 0.697 |
| -0.9935270480460706 | 0.697 |
| 0.6809428028192286 | 0.697 |
| -0.9249848001446034 | 0.698 |
| -0.8149637268776146 | 0.698 |
| -0.5229795330626757 | 0.698 |
| 0.991958622687326 | 0.698 |
| 0.9688081833523566 | 0.698 |
| -0.9874671062567283 | 0.699 |
| 0.41066896517002327 | 0.699 |
| 0.8186899578371095 | 0.699 |
| 0.7736311763714048 | 0.699 |
| -0.7458650880980292 | 0.699 |
| 0.891226316833945 | 0.7 |
| 0.33067394205056727 | 0.7 |
| -0.7926709491446846 | 0.7 |
| 0.9075522195474418 | 0.7 |
| -0.20198240968372422 | 0.7 |
| -0.7037691918799551 | 0.701 |
| 0.08671321447453942 | 0.701 |
| 0.5010090990275389 | 0.701 |
| 0.9846076435350886 | 0.701 |
| 0.053937771607575506 | 0.701 |
| 0.9986626300954923 | 0.702 |
| 0.7299565186654977 | 0.702 |
| 0.3010433070759818 | 0.702 |
| -0.07142655122707627 | 0.702 |
| -0.5324703927334125 | 0.702 |
| -0.5861631936839542 | 0.703 |
| 0.9750430276964316 | 0.703 |
| 0.502072984661069 | 0.703 |
| 0.48986061536175124 | 0.703 |
| -0.07127744757239556 | 0.703 |
| -0.1879167189222418 | 0.704 |
| -0.9556915630452392 | 0.704 |
| -0.954609479668235 | 0.704 |
| 0.9302241256429011 | 0.704 |
| 0.5528003822856852 | 0.704 |
| -0.15773268101812718 | 0.705 |
| 0.3688644743220377 | 0.705 |
| -0.9710585989642441 | 0.705 |
| 0.7046808614427607 | 0.705 |
| 0.1718317388755089 | 0.705 |
| -0.5193613008911749 | 0.706 |
| 0.9572793723954238 | 0.706 |
| -0.39396522798941364 | 0.706 |
| 0.971559027653779 | 0.706 |
| -0.3613430345916385 | 0.706 |
| -0.6180874988894725 | 0.707 |
| 0.7527755729256036 | 0.707 |
| 0.9364715452537334 | 0.707 |
| -0.7382252640171576 | 0.707 |
| 0.6490367626928084 | 0.707 |
| -0.5524282995151157 | 0.708 |
| 0.16147950320805401 | 0.708 |
| -0.9917881804315829 | 0.708 |
| 0.6327657890066506 | 0.708 |
| -0.6283744725975979 | 0.708 |
| -0.5685769734239037 | 0.709 |
| 0.2671493788503328 | 0.709 |
| 0.3639062518721778 | 0.709 |
| -0.3108955527767386 | 0.709 |
| -0.34745144677011064 | 0.709 |
| 0.9838611831820153 | 0.71 |
| 0.8920827784232842 | 0.71 |
| -0.44176208074336704 | 0.71 |
| -0.016690330008737424 | 0.71 |
| 0.3641679303916135 | 0.71 |
| -0.9281822016177573 | 0.711 |
| 0.19877595853059019 | 0.711 |
| -0.9746632240393167 | 0.711 |
| 0.6823246254739882 | 0.711 |
| 0.5670973830108846 | 0.711 |
| -0.8627341586704582 | 0.712 |
| 0.9438522870188977 | 0.712 |
| -0.4085310869895208 | 0.712 |
| 0.3470857546749051 | 0.712 |
| 0.9899427691180235 | 0.712 |
| 0.9416277854133638 | 0.713 |
| -0.15596045461010324 | 0.713 |
| -0.8776615849279338 | 0.713 |
| 0.12856991093474857 | 0.713 |
| 0.7729252462352245 | 0.713 |
| -0.11113373057937093 | 0.714 |
| 0.9971616947490988 | 0.714 |
| -0.19305800877910664 | 0.714 |
| 0.7164156831624187 | 0.714 |
| 0.8514230724977283 | 0.714 |
| -0.17575935510614432 | 0.715 |
| 0.9651174097669247 | 0.715 |
| -0.7153421376357421 | 0.715 |
| -0.8529205024666859 | 0.715 |
| 0.8947529019104649 | 0.715 |
| -0.4950101709903081 | 0.716 |
| 0.5595463739771646 | 0.716 |
| -0.8382818849584786 | 0.716 |
| -0.9703403811603478 | 0.716 |
| -0.9763841949222141 | 0.716 |
| -0.8634070185701092 | 0.717 |
| 0.7958349196004066 | 0.717 |
| 0.9537761127564045 | 0.717 |
| 0.005216994467806468 | 0.717 |
| 0.8756164670942604 | 0.717 |
| -0.023460110709323148 | 0.718 |
| -0.8425824422826784 | 0.718 |
| -0.17867295244550768 | 0.718 |
| 0.9216771988456023 | 0.718 |
| -0.05034273815299931 | 0.718 |
| 0.5559176104849536 | 0.719 |
| 0.6465069127110693 | 0.719 |
| 0.3372379409503651 | 0.719 |
| 0.5945941076501698 | 0.719 |
| -0.8371114288999576 | 0.719 |
| -0.03721735601142401 | 0.72 |
| 0.2565265354799877 | 0.72 |
| -0.7880938800907766 | 0.72 |
| 0.986147094392563 | 0.72 |
| -0.9688725974827972 | 0.72 |
| 0.7776237298885859 | 0.721 |
| 0.4423855584609644 | 0.721 |
| 0.8904323960992822 | 0.721 |
| -0.9404963921932816 | 0.721 |
| 0.04010002790362761 | 0.721 |
| 0.9557374751476058 | 0.722 |
| 0.43604810644153685 | 0.722 |
| -0.8976273734460811 | 0.722 |
| 0.9706164685234442 | 0.722 |
| 0.9354143150053373 | 0.722 |
| 0.92380188480869 | 0.723 |
| 0.9696778201533142 | 0.723 |
| -0.9999636586702394 | 0.723 |
| -0.9989890013563112 | 0.723 |
| 0.15261313820736944 | 0.723 |
| 0.10462057775995895 | 0.724 |
| -0.9002359904196083 | 0.724 |
| 0.2991083910209071 | 0.724 |
| -0.9911824250300337 | 0.724 |
| 0.8495284873316851 | 0.724 |
| 0.5163256760650856 | 0.725 |
| 0.9372226341100236 | 0.725 |
| -0.8215457826329203 | 0.725 |
| 0.7997917235765954 | 0.725 |
| 0.99909015544257 | 0.725 |
| -0.08559603883143305 | 0.726 |
| 0.07864389409242725 | 0.726 |
| -0.4967045089114204 | 0.726 |
| -0.389014547759363 | 0.726 |
| 0.6555037933941397 | 0.726 |
| 0.5660389351099014 | 0.727 |
| 0.3168099724882845 | 0.727 |
| 0.6529025674722614 | 0.727 |
| -0.9257347521659399 | 0.727 |
| -0.62935604712882 | 0.727 |
| 0.9934322850026989 | 0.728 |
| -0.7905446954458747 | 0.728 |
| 0.9990793404525128 | 0.728 |
| 0.9699822758495376 | 0.728 |
| -0.9512697415499786 | 0.728 |
| 0.01686541067391406 | 0.729 |
| 0.9673249558306978 | 0.729 |
| 0.9753873863324921 | 0.729 |
| 0.7801317232268534 | 0.729 |
| -0.01656005771806835 | 0.729 |
| -0.004456143453266896 | 0.73 |
| 0.8976654048575297 | 0.73 |
| -0.30845363622846383 | 0.73 |
| 0.10124589466353552 | 0.73 |
| 0.8717853323419892 | 0.73 |
| 0.29394763873298846 | 0.731 |
| -0.9403239649216826 | 0.731 |
| -0.40895230430885604 | 0.731 |
| 0.5461197225732501 | 0.731 |
| -0.9985175618134481 | 0.731 |
| 0.5444718701500884 | 0.732 |
| -0.9795413307196122 | 0.732 |
| -0.8833855761753097 | 0.732 |
| -0.48763912417395694 | 0.732 |
| 0.6520352869319453 | 0.732 |
| 0.8195297914999168 | 0.733 |
| 0.09282159287434484 | 0.733 |
| 0.20105091912710493 | 0.733 |
| 0.32036633177818846 | 0.733 |
| -0.8888854716828356 | 0.733 |
| 0.009094048625308163 | 0.734 |
| 0.7297816334216567 | 0.734 |
| -0.9166866061300055 | 0.734 |
| -0.2821541230232527 | 0.734 |
| 0.6709939263684 | 0.734 |
| 0.037189134618243636 | 0.735 |
| 0.8688126333213109 | 0.735 |
| 0.40744814048707784 | 0.735 |
| -0.5065725883842961 | 0.735 |
| 0.9493382024666712 | 0.735 |
| 0.6631595094627217 | 0.736 |
| -0.6290432760130216 | 0.736 |
| 0.9743214206221746 | 0.736 |
| 0.9083321289110442 | 0.736 |
| 0.7511658939357332 | 0.736 |
| 0.13802106066762015 | 0.737 |
| -0.9487184545567768 | 0.737 |
| 0.9843849541094403 | 0.737 |
| -0.47475361170881825 | 0.737 |
| 0.9999701901075327 | 0.737 |
| 0.7244690356067369 | 0.738 |
| 0.9976426734897844 | 0.738 |
| -0.7596762728846662 | 0.738 |
| 0.098474147185549 | 0.738 |
| -0.5210712494400829 | 0.738 |
| 0.5356333162503699 | 0.739 |
| -0.9423405672588653 | 0.739 |
| -0.22178781176889747 | 0.739 |
| 0.8259846731500093 | 0.739 |
| 0.7374300581824945 | 0.739 |
| 0.7650086566069293 | 0.74 |
| 0.7083476166956338 | 0.74 |
| 0.9985593139808142 | 0.74 |
| -0.5382563090313581 | 0.74 |
| -0.2032730552955947 | 0.74 |
| -0.9999982758764986 | 0.741 |
| -0.4391483828848646 | 0.741 |
| 0.9908667804027105 | 0.741 |
| -0.40805767549049576 | 0.741 |
| -0.997344945475241 | 0.741 |
| -0.3856075633895948 | 0.742 |
| -0.8607261142820424 | 0.742 |
| 0.6728013428137539 | 0.742 |
| 0.8505122259989615 | 0.742 |
| 0.98809698848037 | 0.742 |
| -0.9243229738397759 | 0.743 |
| -0.9056884160233367 | 0.743 |
| 0.8044820692929731 | 0.743 |
| -0.205200591724227 | 0.743 |
| -0.6933629382112633 | 0.743 |
| -0.23407899223688536 | 0.744 |
| 0.6076805757317647 | 0.744 |
| 0.6268436039273071 | 0.744 |
| 0.7104097626350138 | 0.744 |
| 0.21066268716757644 | 0.744 |
| 0.8735398203706594 | 0.745 |
| 0.8618655205434108 | 0.745 |
| 0.5797298734406273 | 0.745 |
| -0.1365278640649391 | 0.745 |
| 0.9928876301831755 | 0.745 |
| 0.9274015922219938 | 0.746 |
| 0.5967541845618017 | 0.746 |
| -0.3874165397585102 | 0.746 |
| 0.48574691346337406 | 0.746 |
| -0.7050188080125991 | 0.746 |
| -0.0654311973482074 | 0.747 |
| -0.6110054785572276 | 0.747 |
| 0.9999598344336547 | 0.747 |
| 0.34267722534227524 | 0.747 |
| -0.8433568846545884 | 0.747 |
| -0.7522825762634918 | 0.748 |
| 0.9511505358498815 | 0.748 |
| 0.5607531728348956 | 0.748 |
| -0.8137323764633481 | 0.748 |
| 0.06955537373051597 | 0.748 |
| 0.9136832253999234 | 0.749 |
| -0.2753800339473067 | 0.749 |
| -0.056750231829582665 | 0.749 |
| 0.09874348342117739 | 0.749 |
| 0.8288093704278274 | 0.749 |
| 0.9968645281197162 | 0.75 |
| -0.4037064007591564 | 0.75 |
| -0.8670863850287966 | 0.75 |
| 0.9532522842212457 | 0.75 |
| 0.9679432735886031 | 0.75 |
| 0.9504878783698758 | 0.751 |
| -0.6520511907601483 | 0.751 |
| 0.015751321705363763 | 0.751 |
| 0.5532050067158821 | 0.751 |
| -0.08770113721761172 | 0.751 |
| 0.037380050254354834 | 0.752 |
| -0.02654450397395407 | 0.752 |
| 0.5689342292834046 | 0.752 |
| -0.7321801596475107 | 0.752 |
| 0.5660201564140618 | 0.752 |
| 0.9743212683827134 | 0.753 |
| 0.1893873540097567 | 0.753 |
| -0.8703968895092062 | 0.753 |
| -0.9918673865074855 | 0.753 |
| 0.5813080138548865 | 0.753 |
| -0.37525584237006016 | 0.754 |
| -0.8699615514028916 | 0.754 |
| 0.9855672235185102 | 0.754 |
| -0.10525091113983336 | 0.754 |
| -0.7776307301508715 | 0.754 |
| 0.996528768450618 | 0.755 |
| -0.9110911948595495 | 0.755 |
| -0.4967179386713621 | 0.755 |
| -0.7751825865222641 | 0.755 |
| 0.20186858068240787 | 0.755 |
| 0.3762172115968733 | 0.756 |
| 0.9988229703637285 | 0.756 |
| -0.7271840192662317 | 0.756 |
| 0.3096353120923619 | 0.756 |
| 0.5779695091039772 | 0.756 |
| 0.911466055769086 | 0.757 |
| 0.9802347995485796 | 0.757 |
| -0.3356679877861647 | 0.757 |
| -0.638339347376394 | 0.757 |
| 0.5649961451084149 | 0.757 |
| 0.8959614265170285 | 0.758 |
| 0.8717660620928467 | 0.758 |
| -0.7647183701918933 | 0.758 |
| 0.7889864182484985 | 0.758 |
| -0.12102374735691976 | 0.758 |
| -0.894143536338854 | 0.759 |
| -0.746482670253816 | 0.759 |
| -0.7246782745710034 | 0.759 |
| -0.7643055161441371 | 0.759 |
| 0.12255518524479547 | 0.759 |
| 0.716599217500381 | 0.76 |
| 0.9995670059487718 | 0.76 |
| 0.16577408221545434 | 0.76 |
| -0.9486813280933309 | 0.76 |
| -0.9998551495789189 | 0.76 |
| -0.8144953855821219 | 0.761 |
| 0.07632887053270894 | 0.761 |
| -0.9031458858428958 | 0.761 |
| -0.11161222960622927 | 0.761 |
| 0.6273297637271773 | 0.761 |
| 0.9905981582710635 | 0.762 |
| -0.4175357696731138 | 0.762 |
| 0.07279304671202029 | 0.762 |
| -0.7610693541340914 | 0.762 |
| -0.4451100391248744 | 0.762 |
| -0.783625631985071 | 0.763 |
| -0.9889079936996207 | 0.763 |
| 0.9955899656464513 | 0.763 |
| 0.28494614347906255 | 0.763 |
| -0.29450548604433174 | 0.763 |
| 0.4574828551110743 | 0.764 |
| -0.9597735927916523 | 0.764 |
| -0.15389154067867936 | 0.764 |
| -0.7380189271551455 | 0.764 |
| 0.07748320041371141 | 0.764 |
| -0.438864481733846 | 0.765 |
| 0.9894682278133949 | 0.765 |
| 0.04696086876337469 | 0.765 |
| -0.8107001727867198 | 0.765 |
| 0.9435168364319189 | 0.765 |
| 0.9994561029488767 | 0.766 |
| -0.44174134834963547 | 0.766 |
| 0.9610143392174738 | 0.766 |
| 0.980282685611034 | 0.766 |
| -0.08058857798098898 | 0.766 |
| -0.29780347234151033 | 0.767 |
| -0.6904627162020909 | 0.767 |
| -0.9993304145109708 | 0.767 |
| -0.9304848274590853 | 0.767 |
| -0.7629328617267339 | 0.767 |
| -0.8118484435469016 | 0.768 |
| 0.9873819986575899 | 0.768 |
| 0.7783951552659426 | 0.768 |
| -0.6198735864760634 | 0.768 |
| 0.039941216253319985 | 0.768 |
| -0.014832575359353874 | 0.769 |
| -0.9625323700402214 | 0.769 |
| -0.988430059287802 | 0.769 |
| -0.3727826151198499 | 0.769 |
| 0.9723552779566016 | 0.769 |
| -0.7364516666065415 | 0.77 |
| -0.6972534506607269 | 0.77 |
| 0.9732903212789409 | 0.77 |
| -0.4466521060629584 | 0.77 |
| -0.9944268083785961 | 0.77 |
| -0.05548771004191648 | 0.771 |
| 0.9052488837773511 | 0.771 |
| -0.9987097777212376 | 0.771 |
| -0.38057961496683085 | 0.771 |
| 0.9715817773335791 | 0.771 |
| -0.6657479476550003 | 0.772 |
| 0.6498480270557687 | 0.772 |
| -0.892114007226815 | 0.772 |
| -0.4439295414185921 | 0.772 |
| 0.9368147430965024 | 0.772 |
| -0.26887321530843805 | 0.773 |
| 0.9591157998617391 | 0.773 |
| -0.06351717921319741 | 0.773 |
| -0.9973414547037656 | 0.773 |
| -0.8192451612576512 | 0.773 |
| 0.07576241168806777 | 0.774 |
| 0.07698036171854662 | 0.774 |
| -0.9605710593372272 | 0.774 |
| -0.6129995538990749 | 0.774 |
| -0.9318913521310407 | 0.774 |
| 0.3877791703899397 | 0.775 |
| 0.7634814768630882 | 0.775 |
| 0.32111547122937745 | 0.775 |
| 0.04298558770030519 | 0.775 |
| 0.8747101340606054 | 0.775 |
| -0.9996119178702928 | 0.776 |
| -0.038491226081083046 | 0.776 |
| 0.4126178428212109 | 0.776 |
| 0.32360753720628266 | 0.776 |
| 0.8326156651133464 | 0.776 |
| 0.9209537652701211 | 0.777 |
| -0.9811202563593022 | 0.777 |
| 0.9554682295941334 | 0.777 |
| 0.9994431381011321 | 0.777 |
| -0.09478886418119675 | 0.777 |
| 0.02747097327592961 | 0.778 |
| 0.860200445733213 | 0.778 |
| -0.4699198034930872 | 0.778 |
| 0.1211015961221385 | 0.778 |
| 0.6936885468113494 | 0.778 |
| 0.006281244839876373 | 0.779 |
| 0.6721587143471227 | 0.779 |
| 0.9986289754414375 | 0.779 |
| 0.9290707513629866 | 0.779 |
| 0.18129423468864472 | 0.779 |
| 0.972461876067019 | 0.78 |
| 0.251865843165266 | 0.78 |
| 0.9999854706528263 | 0.78 |
| 0.7281769922807568 | 0.78 |
| -0.5531914842384531 | 0.78 |
| -0.9714045876486243 | 0.781 |
| -0.9349751405646116 | 0.781 |
| 0.05436990776839925 | 0.781 |
| 0.9599818633324549 | 0.781 |
| -0.40653843554521446 | 0.781 |
| 0.7377753624403987 | 0.782 |
| 0.6214110974066304 | 0.782 |
| -0.8344135267768721 | 0.782 |
| 0.657629575167333 | 0.782 |
| -0.2803536323615612 | 0.782 |
| 0.10741961717891262 | 0.783 |
| 0.7358854648631947 | 0.783 |
| -0.1822473553698563 | 0.783 |
| -0.9959712306749007 | 0.783 |
| 0.9707168629563577 | 0.783 |
| -0.9211578519518215 | 0.784 |
| -0.2018555915632483 | 0.784 |
| 0.999338332741232 | 0.784 |
| 0.9983040852051012 | 0.784 |
| -0.8515287456531704 | 0.784 |
| 0.998932212276143 | 0.785 |
| 0.97462637879967 | 0.785 |
| -0.5433300298131241 | 0.785 |
| 0.04297896837305736 | 0.785 |
| 0.6922038382530886 | 0.785 |
| 0.6998510673041594 | 0.786 |
| -0.5568810631697977 | 0.786 |
| -0.9051123410738667 | 0.786 |
| 0.8701213421620486 | 0.786 |
| 0.6505427649095123 | 0.786 |
| 0.9836327157032402 | 0.787 |
| 0.8897035423715052 | 0.787 |
| 0.6097056437604658 | 0.787 |
| -0.7310891951652183 | 0.787 |
| -0.2528247099938395 | 0.787 |
| -0.9731863879330729 | 0.788 |
| 0.7694600258948247 | 0.788 |
| 0.42862700730119846 | 0.788 |
| -0.8246216309575973 | 0.788 |
| -0.12328223642786237 | 0.788 |
| -0.22158412537592834 | 0.789 |
| 0.21347681172171148 | 0.789 |
| 0.6976543657852533 | 0.789 |
| -0.9544374801518292 | 0.789 |
| -0.7082115021328153 | 0.789 |
| -0.8717969047082077 | 0.79 |
| -0.14055578768646285 | 0.79 |
| 0.34239946324729725 | 0.79 |
| -0.9706572509455829 | 0.79 |
| -0.995278755992058 | 0.79 |
| 0.9334674562200764 | 0.791 |
| 0.5345717023164728 | 0.791 |
| 0.8830339749893036 | 0.791 |
| -0.7186652509809796 | 0.791 |
| 0.5764615263925909 | 0.791 |
| 0.02390964753143603 | 0.792 |
| 0.12939065586308043 | 0.792 |
| 0.7690220613362545 | 0.792 |
| -0.502823484801347 | 0.792 |
| 0.9787767859220083 | 0.792 |
| -0.7139215238498666 | 0.793 |
| -0.7124925771314687 | 0.793 |
| -0.8955589049926758 | 0.793 |
| 0.999831898705012 | 0.793 |
| 0.37984137164072096 | 0.793 |
| -0.9245223017189583 | 0.794 |
| 0.9224394452901933 | 0.794 |
| -0.7336072112218254 | 0.794 |
| 0.8970238437692549 | 0.794 |
| 0.9494134842057992 | 0.794 |
| -0.14986616405729586 | 0.795 |
| -0.9667580071752032 | 0.795 |
| 0.8499907945865066 | 0.795 |
| 0.9178592784273548 | 0.795 |
| 0.8638309277723165 | 0.795 |
| -0.9336894023552821 | 0.796 |
| -0.9968851503488301 | 0.796 |
| 0.5128291468478375 | 0.796 |
| -0.21714837191153047 | 0.796 |
| 0.9322713524149878 | 0.796 |
| 0.048304116874753535 | 0.797 |
| 0.5171004914099215 | 0.797 |
| -0.09890665313089328 | 0.797 |
| 0.6076893230474483 | 0.797 |
| -0.9918266201091851 | 0.797 |
| 0.5038897093275647 | 0.798 |
| -0.9601534468692359 | 0.798 |
| 0.9799793466154088 | 0.798 |
| -0.6417863573358731 | 0.798 |
| 0.40876853757079545 | 0.798 |
| 0.2154881583734821 | 0.799 |
| 0.9983665860070413 | 0.799 |
| 0.9906188308051446 | 0.799 |
| 0.6953531002510968 | 0.799 |
| 0.9038989889982659 | 0.799 |
| 0.9999661452305836 | 0.8 |
| -0.23225395724850478 | 0.8 |
| 0.05908281550843562 | 0.8 |
| 0.9992267710291712 | 0.8 |
| 0.9320728032395348 | 0.8 |
| -0.9655011460789444 | 0.801 |
| -0.9030121919088934 | 0.801 |
| 0.06296163109544767 | 0.801 |
| 0.29351041902954267 | 0.801 |
| 0.38809071123183897 | 0.801 |
| -0.10867398337161552 | 0.802 |
| -0.5807693035138899 | 0.802 |
| -0.340297846586268 | 0.802 |
| 0.47240641143977313 | 0.802 |
| 0.8341338274344315 | 0.802 |
| 0.7681658105062021 | 0.803 |
| 0.7256060421391605 | 0.803 |
| 0.14386400659345033 | 0.803 |
| 0.5311544599243179 | 0.803 |
| -0.7793258929031117 | 0.803 |
| 0.7947691154695365 | 0.804 |
| -0.9989969716087929 | 0.804 |
| 0.984714230538244 | 0.804 |
| 0.5549133762898796 | 0.804 |
| -0.8313940509827533 | 0.804 |
| -0.575053933113565 | 0.805 |
| -0.6808333122510505 | 0.805 |
| -0.2727885646547747 | 0.805 |
| -0.9232249046052471 | 0.805 |
| 0.0818680059560884 | 0.805 |
| 0.6285106868973749 | 0.806 |
| -0.7328807072577925 | 0.806 |
| 0.3543116884087363 | 0.806 |
| -0.8955304361514016 | 0.806 |
| 0.741889861927643 | 0.806 |
| 0.9992617288279001 | 0.807 |
| -0.7609013416081607 | 0.807 |
| 0.645947053045943 | 0.807 |
| 0.6618791427854548 | 0.807 |
| -0.8307588773920797 | 0.807 |
| -0.909217752918238 | 0.808 |
| -0.709972193362174 | 0.808 |
| -0.136840008382138 | 0.808 |
| 0.7679868561833278 | 0.808 |
| -0.7833847921287656 | 0.808 |
| 0.5296321880628405 | 0.809 |
| -0.06667111827266393 | 0.809 |
| 0.4763384551334251 | 0.809 |
| 0.9999624695643604 | 0.809 |
| 0.41869723398680486 | 0.809 |
| 0.9481976372955226 | 0.81 |
| 0.7187355104198256 | 0.81 |
| -0.5779345401091626 | 0.81 |
| 0.7372059582565741 | 0.81 |
| -0.962777835235846 | 0.81 |
| 0.9996976336726403 | 0.811 |
| -0.9037684009586887 | 0.811 |
| -0.549698343830335 | 0.811 |
| -0.9270244332935931 | 0.811 |
| -0.10036108964401534 | 0.811 |
| 0.7789773700794826 | 0.812 |
| -0.9991878557284152 | 0.812 |
| 0.896401994821651 | 0.812 |
| 0.5446195679015752 | 0.812 |
| 0.9945421749890997 | 0.812 |
| -0.642966617325734 | 0.813 |
| 0.3892074508257728 | 0.813 |
| -0.4689054934826044 | 0.813 |
| 0.3107489818532836 | 0.813 |
| -0.13407155014028596 | 0.813 |
| -0.8420364099973544 | 0.814 |
| 0.26188638336498354 | 0.814 |
| -0.9669515924237653 | 0.814 |
| 0.22106030425539644 | 0.814 |
| 0.9928820407114667 | 0.814 |
| 0.8462740401531703 | 0.815 |
| -0.6981163102410136 | 0.815 |
| -0.46389314235161416 | 0.815 |
| -0.9850637173584491 | 0.815 |
| 0.8521434903864107 | 0.815 |
| -0.8735319046860525 | 0.816 |
| -0.9998520800465095 | 0.816 |
| -0.6060919536952154 | 0.816 |
| -0.7537146996190047 | 0.816 |
| -0.5666498363841013 | 0.816 |
| 0.07815022309492202 | 0.817 |
| -0.6510051143332782 | 0.817 |
| 0.9999963963335795 | 0.817 |
| -0.9508887270295263 | 0.817 |
| -0.9047741356118809 | 0.817 |
| -0.9999315656986482 | 0.818 |
| -0.09108432740817747 | 0.818 |
| -0.9998538812221681 | 0.818 |
| -0.15372475015088394 | 0.818 |
| -0.9999987853226403 | 0.818 |
| -0.59988933622591 | 0.819 |
| 0.7870352437391551 | 0.819 |
| 0.7838079641907617 | 0.819 |
| -0.9052728192450157 | 0.819 |
| 0.39519562048025775 | 0.819 |
| -0.417863129723054 | 0.82 |
| 0.5723133292616491 | 0.82 |
| 0.7189873470571415 | 0.82 |
| 0.9594333619156111 | 0.82 |
| -0.4093957504315056 | 0.82 |
| -0.6507122533750962 | 0.821 |
| 0.40885246559810096 | 0.821 |
| 0.7283103152656487 | 0.821 |
| 0.5471243286765728 | 0.821 |
| -0.43343796296396003 | 0.821 |
| 0.7118096601752525 | 0.822 |
| 0.9683343939582683 | 0.822 |
| 0.866452865832829 | 0.822 |
| -0.33336907593363885 | 0.822 |
| -0.5686261003922777 | 0.822 |
| -0.9836906177536591 | 0.823 |
| 0.8086540598810106 | 0.823 |
| -0.3347544969608522 | 0.823 |
| 0.08986699513545797 | 0.823 |
| -0.9602246878240314 | 0.823 |
| -0.9193359097941981 | 0.824 |
| -0.09700253017666434 | 0.824 |
| -0.7097759172574941 | 0.824 |
| -0.9996473894284944 | 0.824 |
| -0.9971711626632086 | 0.824 |
| 0.849918393911747 | 0.825 |
| 0.998611615091601 | 0.825 |
| 0.8004433095153125 | 0.825 |
| 0.38107649926650244 | 0.825 |
| 0.7845417693733704 | 0.825 |
| 0.5472879843891927 | 0.826 |
| 0.998077582721319 | 0.826 |
| 0.9976360741300749 | 0.826 |
| 0.9124265037587559 | 0.826 |
| 0.7799396215825197 | 0.826 |
| -0.6052965480939478 | 0.827 |
| 0.1994639045258579 | 0.827 |
| -0.8453608280883966 | 0.827 |
| -0.9999142311883975 | 0.827 |
| -0.5676225708549127 | 0.827 |
| 0.8032564877747298 | 0.828 |
| 0.917768113438163 | 0.828 |
| -0.1843726435148472 | 0.828 |
| -0.20650385805790808 | 0.828 |
| -0.9878985173087136 | 0.828 |
| 0.9713608488321698 | 0.829 |
| -0.28256209598318627 | 0.829 |
| 0.21626464543342463 | 0.829 |
| 0.9347052422688902 | 0.829 |
| 0.7565236785346202 | 0.829 |
| 0.3050401950882122 | 0.83 |
| -0.9430360086573959 | 0.83 |
| -0.4059330318509516 | 0.83 |
| -0.7138142432674509 | 0.83 |
| 0.3331416844860882 | 0.83 |
| 0.6794004994514949 | 0.831 |
| 0.7104405381569495 | 0.831 |
| -0.4620992159645722 | 0.831 |
| 0.2894434607023306 | 0.831 |
| -0.6448037415541781 | 0.831 |
| 0.9978436741468157 | 0.832 |
| -0.9548202206466332 | 0.832 |
| 0.17991976363781303 | 0.832 |
| -0.6595064123848376 | 0.832 |
| -0.6216778204994404 | 0.832 |
| -0.6669242612842987 | 0.833 |
| 0.9046848996288634 | 0.833 |
| -0.6616149686279476 | 0.833 |
| 0.7655765414611073 | 0.833 |
| -0.9825627366482306 | 0.833 |
| -0.5804050542740838 | 0.834 |
| 0.8051028317984026 | 0.834 |
| 0.8948086495205664 | 0.834 |
| 0.8543950824018897 | 0.834 |
| -0.28630890009057586 | 0.834 |
| -0.6391206330719306 | 0.835 |
| 0.9677544926690901 | 0.835 |
| -0.3016642882427678 | 0.835 |
| 0.25402219647121743 | 0.835 |
| -0.7722156393623862 | 0.835 |
| 0.6180445461816862 | 0.836 |
| -0.942383438917526 | 0.836 |
| -0.8774890487112202 | 0.836 |
| -0.8986631846210521 | 0.836 |
| 0.34700690843594795 | 0.836 |
| -0.4984543022159899 | 0.837 |
| 0.4692744611804021 | 0.837 |
| 0.9836877361684195 | 0.837 |
| 0.9925471721393077 | 0.837 |
| -0.893696340598744 | 0.837 |
| 0.9756549331637919 | 0.838 |
| -0.9007373497402154 | 0.838 |
| -0.7019840274259807 | 0.838 |
| 0.9532659649091882 | 0.838 |
| -0.7851075120788044 | 0.838 |
| -0.13944442368566093 | 0.839 |
| 0.9611685940239127 | 0.839 |
| 0.4568963923379226 | 0.839 |
| 0.9993784622166587 | 0.839 |
| -0.788594638696356 | 0.839 |
| 0.45155434447801385 | 0.84 |
| 0.08464655556185587 | 0.84 |
| 0.6266171392089336 | 0.84 |
| 0.4372695440792988 | 0.84 |
| -0.9421111425198132 | 0.84 |
| 0.5296667444275095 | 0.841 |
| 0.6360035738460761 | 0.841 |
| -0.9401797866019066 | 0.841 |
| -0.9419878431062074 | 0.841 |
| -0.7097655193246387 | 0.841 |
| 0.9282736438224733 | 0.842 |
| -0.9964689517814409 | 0.842 |
| -0.8087137476529047 | 0.842 |
| -0.8131965888496137 | 0.842 |
| 0.1606272081287227 | 0.842 |
| -0.40692557670381463 | 0.843 |
| -0.8055187747987838 | 0.843 |
| -0.20062291253778616 | 0.843 |
| 0.2239888741500466 | 0.843 |
| 0.3053924388059611 | 0.843 |
| 0.997304126784395 | 0.844 |
| -0.44546955646753794 | 0.844 |
| -0.9981938516897209 | 0.844 |
| -0.8471531248715412 | 0.844 |
| -0.37228614156273393 | 0.844 |
| 0.773734526212641 | 0.845 |
| 0.8612387885154186 | 0.845 |
| 0.8700121700992194 | 0.845 |
| -0.27713793181989144 | 0.845 |
| -0.6085796691552535 | 0.845 |
| -0.8495261222306996 | 0.846 |
| 0.5546553533608944 | 0.846 |
| -0.37176231173640095 | 0.846 |
| -0.4766585995476001 | 0.846 |
| -0.18017751573592392 | 0.846 |
| -0.1525548890106388 | 0.847 |
| -0.8164713629928075 | 0.847 |
| 0.13662470558755582 | 0.847 |
| -0.9320840418367689 | 0.847 |
| 0.4693698716076486 | 0.847 |
| -0.43981202973171224 | 0.848 |
| 0.1510547938518831 | 0.848 |
| -0.46360365723547564 | 0.848 |
| 0.8010203121170073 | 0.848 |
| -0.8790498133000726 | 0.848 |
| 0.9882258524714007 | 0.849 |
| -0.5968242866428018 | 0.849 |
| -0.969378318310537 | 0.849 |
| -0.565759193057709 | 0.849 |
| -0.7164799964157879 | 0.849 |
| -0.9979483690887763 | 0.85 |
| 0.7347655397661907 | 0.85 |
| 0.7796178352801955 | 0.85 |
| -0.5974149578725938 | 0.85 |
| -0.36318606347384974 | 0.85 |
| 0.8984995913077679 | 0.851 |
| 0.3380546335511892 | 0.851 |
| 0.2266151213093112 | 0.851 |
| -0.44738807863107477 | 0.851 |
| 0.5602690030590529 | 0.851 |
| -0.4296050874250769 | 0.852 |
| 0.5884740301891401 | 0.852 |
| 0.6702667152336937 | 0.852 |
| 0.6657616393190363 | 0.852 |
| 0.24714624499238244 | 0.852 |
| 0.2324662131967422 | 0.853 |
| -0.17925625136246495 | 0.853 |
| -0.9665103169343536 | 0.853 |
| 0.999349354622013 | 0.853 |
| 0.9997148938424165 | 0.853 |
| 0.9859297733836867 | 0.854 |
| 0.6689612264813536 | 0.854 |
| -0.8836807983965457 | 0.854 |
| 0.5943543436863196 | 0.854 |
| -0.7410303923627595 | 0.854 |
| 0.9479476526854901 | 0.855 |
| -0.05097021818048795 | 0.855 |
| 0.97475536279028 | 0.855 |
| -0.9510645683821995 | 0.855 |
| 0.8064238481829784 | 0.855 |
| 0.3450818851463366 | 0.856 |
| 0.9357351722849956 | 0.856 |
| 0.6980766404643083 | 0.856 |
| -0.9975638217880428 | 0.856 |
| -0.7014717810900392 | 0.856 |
| 0.7439653133776128 | 0.857 |
| 0.18367615151864494 | 0.857 |
| -0.7098930457415411 | 0.857 |
| -0.45671818707013867 | 0.857 |
| 0.9824922708140458 | 0.857 |
| 0.9968915131087197 | 0.858 |
| 0.7010402971856303 | 0.858 |
| -0.9271225305058125 | 0.858 |
| -0.9919098050264067 | 0.858 |
| 0.9766148084974243 | 0.858 |
| 0.336219134674586 | 0.859 |
| -0.9383020153809635 | 0.859 |
| -0.12446592245411793 | 0.859 |
| -0.9794898155608524 | 0.859 |
| 0.9665334527571147 | 0.859 |
| -0.6560880161380355 | 0.86 |
| -0.23049538153659227 | 0.86 |
| 0.2480554555368559 | 0.86 |
| -0.0052952985854666165 | 0.86 |
| 0.9846765570808326 | 0.86 |
| 0.4525253232549305 | 0.861 |
| -0.7366858573805403 | 0.861 |
| -0.3543017999113093 | 0.861 |
| 0.5926641908763222 | 0.861 |
| -0.8555409040140707 | 0.861 |
| 0.976625628743835 | 0.862 |
| -0.945213253050705 | 0.862 |
| -0.7516892815833492 | 0.862 |
| 0.9914933319078532 | 0.862 |
| -0.051822347309239146 | 0.862 |
| -0.6956869854460976 | 0.863 |
| -0.2889516943196759 | 0.863 |
| 0.5602449981394844 | 0.863 |
| -0.7924871540903465 | 0.863 |
| -0.9999966678715266 | 0.863 |
| -0.375961952602418 | 0.864 |
| 0.9543763671919406 | 0.864 |
| -0.9066913409144572 | 0.864 |
| -0.5518012782343433 | 0.864 |
| -0.9768388948128516 | 0.864 |
| 0.08793296311943942 | 0.865 |
| 0.6462239932034557 | 0.865 |
| -0.9232742198916197 | 0.865 |
| 0.668651443595504 | 0.865 |
| 0.8901428012916315 | 0.865 |
| -0.13418441918516208 | 0.866 |
| -0.9096701852329309 | 0.866 |
| 0.3701016151947758 | 0.866 |
| 0.290305545267623 | 0.866 |
| -0.41456958038116337 | 0.866 |
| 0.2573175495005143 | 0.867 |
| 0.21850486856488877 | 0.867 |
| 0.7371916922791113 | 0.867 |
| -0.9110173044284344 | 0.867 |
| -0.43287512460621835 | 0.867 |
| -0.6832281700878631 | 0.868 |
| 0.9999968610764267 | 0.868 |
| -0.3667591746545545 | 0.868 |
| -0.7193499487965385 | 0.868 |
| 0.22569879437910884 | 0.868 |
| -0.982121669595031 | 0.869 |
| -0.43151443554554675 | 0.869 |
| 0.009318456696553115 | 0.869 |
| 0.22591807593893656 | 0.869 |
| -0.9389688625729796 | 0.869 |
| -0.9863817809759874 | 0.87 |
| -0.2537773374739941 | 0.87 |
| 0.9780226728214685 | 0.87 |
| 0.2348266816834704 | 0.87 |
| 0.5088386086842381 | 0.87 |
| 0.9420459551451336 | 0.871 |
| 0.691211847632757 | 0.871 |
| 0.778009517649554 | 0.871 |
| -0.05905175169870691 | 0.871 |
| 0.5977429172662052 | 0.871 |
| -0.9960696782483135 | 0.872 |
| 0.9743439648501859 | 0.872 |
| 0.5116218994180354 | 0.872 |
| -0.24783129796261705 | 0.872 |
| 0.9454847149698495 | 0.872 |
| -0.15072988290746017 | 0.873 |
| -0.9881457585883033 | 0.873 |
| 0.6946013850147076 | 0.873 |
| 0.11640736705685747 | 0.873 |
| -0.6952155612273996 | 0.873 |
| 0.8920189877070994 | 0.874 |
| -0.657489609219772 | 0.874 |
| -0.8909901278913339 | 0.874 |
| -0.116268219437849 | 0.874 |
| 0.6383751066827555 | 0.874 |
| -0.7325301955995998 | 0.875 |
| 0.8820807232607009 | 0.875 |
| -0.24159766859461446 | 0.875 |
| 0.9558498892614834 | 0.875 |
| -0.8570208948173565 | 0.875 |
| -0.706840384778261 | 0.876 |
| -0.9612379416341184 | 0.876 |
| -0.4715088494279796 | 0.876 |
| 0.07450447538569725 | 0.876 |
| -0.8324724153627414 | 0.876 |
| -0.9862401788741229 | 0.877 |
| 0.985458333312352 | 0.877 |
| -0.9855196439132935 | 0.877 |
| -0.638075206104631 | 0.877 |
| 0.9287119377984996 | 0.877 |
| 0.06848366056784735 | 0.878 |
| 0.9651532087357444 | 0.878 |
| 0.999777031570997 | 0.878 |
| -0.5453623938153981 | 0.878 |
| -0.21762321990567782 | 0.878 |
| 0.7573879878386801 | 0.879 |
| -0.7187965846814277 | 0.879 |
| 0.18031572517844655 | 0.879 |
| -0.7226183010268981 | 0.879 |
| -0.19644291064856942 | 0.879 |
| -0.7719316448802671 | 0.88 |
| 0.8789190818357272 | 0.88 |
| -0.07815721070324608 | 0.88 |
| 0.47691592859028176 | 0.88 |
| -0.05827606594765171 | 0.88 |
| -0.9723472251370362 | 0.881 |
| 0.8246042335666025 | 0.881 |
| 0.892015182620576 | 0.881 |
| 0.9851143825993585 | 0.881 |
| -0.0013434745791574268 | 0.881 |
| -0.12737870430927806 | 0.882 |
| -0.33941537710612557 | 0.882 |
| 0.990102283296284 | 0.882 |
| 0.08954966253139487 | 0.882 |
| -0.34258123038619226 | 0.882 |
| -0.15201482188034113 | 0.883 |
| 0.9312963198868448 | 0.883 |
| -0.9508948639107474 | 0.883 |
| 0.18866954796551935 | 0.883 |
| -0.3386516912477885 | 0.883 |
| -0.5475366961701218 | 0.884 |
| 0.4554006146958182 | 0.884 |
| -0.09927039429380384 | 0.884 |
| -0.9705751521377535 | 0.884 |
| 0.869677508322576 | 0.884 |
| -0.9235906321736709 | 0.885 |
| -0.9931018991526459 | 0.885 |
| -0.9862086327396046 | 0.885 |
| 0.3345978154704617 | 0.885 |
| -0.8172719081746604 | 0.885 |
| -0.47279096292738343 | 0.886 |
| 0.9532263368699807 | 0.886 |
| -0.8064488003731268 | 0.886 |
| -0.4072387888169785 | 0.886 |
| -0.9994596892464112 | 0.886 |
| -0.173414627745754 | 0.887 |
| 0.05284299629541868 | 0.887 |
| 0.9966562301452195 | 0.887 |
| 0.43621113365163267 | 0.887 |
| -0.9928778245414024 | 0.887 |
| 0.03762077676771531 | 0.888 |
| 0.983102852050543 | 0.888 |
| 0.310545004035464 | 0.888 |
| 0.979076896005924 | 0.888 |
| 0.2582915187388096 | 0.888 |
| -0.6206088743771804 | 0.889 |
| 0.9235479551955916 | 0.889 |
| 0.39241140075483516 | 0.889 |
| 0.4790719541296448 | 0.889 |
| 0.04262447481872104 | 0.889 |
| -0.19790259423110243 | 0.89 |
| -0.7932386142841376 | 0.89 |
| 0.6056093328641295 | 0.89 |
| -0.04700421842300044 | 0.89 |
| 0.03760979044149059 | 0.89 |
| -0.9524187974852515 | 0.891 |
| -0.8300793767207882 | 0.891 |
| -0.9772155080607645 | 0.891 |
| 0.9524953654855802 | 0.891 |
| 0.28008000991033194 | 0.891 |
| -0.8855498114065811 | 0.892 |
| -0.08919892659158127 | 0.892 |
| -0.12721242253859372 | 0.892 |
| 0.5989979986803498 | 0.892 |
| -0.5196807038117077 | 0.892 |
| -0.7506180736770505 | 0.893 |
| -0.9973241299744079 | 0.893 |
| -0.31095388776314825 | 0.893 |
| 0.9338651936246561 | 0.893 |
| 0.968834598228041 | 0.893 |
| 0.9685492820440228 | 0.894 |
| -0.152453776301054 | 0.894 |
| -0.23770887173057864 | 0.894 |
| 0.9837093925901993 | 0.894 |
| 0.5427606486912254 | 0.894 |
| -0.3412392572917907 | 0.895 |
| -0.47537118406130485 | 0.895 |
| -0.9040625814517319 | 0.895 |
| 0.7713939253148908 | 0.895 |
| 0.5686451620310349 | 0.895 |
| 0.6323809025714212 | 0.896 |
| -0.3500790341889984 | 0.896 |
| -0.9932019126383594 | 0.896 |
| -0.8353753267044447 | 0.896 |
| 0.19952284501886777 | 0.896 |
| 0.9903362977232987 | 0.897 |
| 0.3951074994133267 | 0.897 |
| -0.05635775383581062 | 0.897 |
| 0.9032578453915787 | 0.897 |
| 0.7783088656818138 | 0.897 |
| -0.7048316159279578 | 0.898 |
| 0.9206353661532207 | 0.898 |
| -0.5011539742647256 | 0.898 |
| -0.7424817125496616 | 0.898 |
| 0.9202303535875173 | 0.898 |
| 0.21768311929210984 | 0.899 |
| 0.6861305898748709 | 0.899 |
| -0.9361526655117502 | 0.899 |
| 0.7802818357973509 | 0.899 |
| -0.7685573752106155 | 0.899 |
| 0.2640062835054141 | 0.9 |
| -0.9248136409453025 | 0.9 |
| 0.08064252827966097 | 0.9 |
| -0.9006569130083542 | 0.9 |
| 0.15049408080141094 | 0.9 |
| 0.29589592837480966 | 0.901 |
| 0.30864695245409024 | 0.901 |
| 0.12032614550606342 | 0.901 |
| -0.9472151999313274 | 0.901 |
| -0.607268733909946 | 0.901 |
| -0.5945794455047797 | 0.902 |
| -0.9032152772128929 | 0.902 |
| -0.810922023132581 | 0.902 |
| -0.8288153900496303 | 0.902 |
| 0.8702761287106403 | 0.902 |
| -0.5577162497226605 | 0.903 |
| -0.893971226054308 | 0.903 |
| 0.6812115908588742 | 0.903 |
| -0.41358135331920753 | 0.903 |
| 0.13212932419885093 | 0.903 |
| 0.9726733526583363 | 0.904 |
| 0.988822138195865 | 0.904 |
| -0.9996626150233764 | 0.904 |
| -0.999934728866528 | 0.904 |
| -0.9988544589938447 | 0.904 |
| -0.6534701819178313 | 0.905 |
| 0.8054049827917134 | 0.905 |
| 0.48953544651847486 | 0.905 |
| -0.0433998013901678 | 0.905 |
| -0.8102629945100464 | 0.905 |
| 0.10083946776688642 | 0.906 |
| 0.8148837939496184 | 0.906 |
| 0.4754352666909539 | 0.906 |
| -0.7432021995552869 | 0.906 |
| -0.3745383193220866 | 0.906 |
| 0.5564569100025831 | 0.907 |
| 0.6900006780394063 | 0.907 |
| 0.92811861674864 | 0.907 |
| -0.8084454684413231 | 0.907 |
| -0.9693129072630554 | 0.907 |
| 0.6735603440931721 | 0.908 |
| 0.744956192426716 | 0.908 |
| 0.5791629510827069 | 0.908 |
| 0.8816181950584804 | 0.908 |
| -0.33136000774988583 | 0.908 |
| 0.9068116278693571 | 0.909 |
| -0.2834579312098017 | 0.909 |
| 0.873918355174055 | 0.909 |
| -0.5847353889369508 | 0.909 |
| -0.10174636968459692 | 0.909 |
| -0.9696461981321441 | 0.91 |
| 0.9644536770043413 | 0.91 |
| -0.2589384876521447 | 0.91 |
| -0.7727624060576783 | 0.91 |
| -0.4975576216787106 | 0.91 |
| 0.9097147857969456 | 0.911 |
| -0.8266640437322073 | 0.911 |
| 0.5958491511708136 | 0.911 |
| -0.7546337066314621 | 0.911 |
| -0.9890859234019324 | 0.911 |
| 0.5929805844750289 | 0.912 |
| 0.044443492624054705 | 0.912 |
| 0.7111984050283598 | 0.912 |
| -0.00039157255179833394 | 0.912 |
| -0.872853078597884 | 0.912 |
| 0.98836536696641 | 0.913 |
| -0.9244853326636653 | 0.913 |
| 0.0457565706228378 | 0.913 |
| 0.9999119211709133 | 0.913 |
| -0.9997883338504264 | 0.913 |
| 0.9918977805979005 | 0.914 |
| 0.5679700184511093 | 0.914 |
| -0.9361040507888317 | 0.914 |
| -0.9894810881178452 | 0.914 |
| -0.11460644989512257 | 0.914 |
| -0.4518767774580495 | 0.915 |
| -0.9988989617848818 | 0.915 |
| -0.9661972408018996 | 0.915 |
| 0.10213036786235015 | 0.915 |
| -0.8959904096834403 | 0.915 |
| -0.5824308824487127 | 0.916 |
| 0.7413528915546904 | 0.916 |
| 0.26382287780028857 | 0.916 |
| 0.8329482813035457 | 0.916 |
| -0.9934312988551968 | 0.916 |
| 0.49335965010198585 | 0.917 |
| 0.46924899210049303 | 0.917 |
| -0.5602059892683989 | 0.917 |
| -0.9601311090575146 | 0.917 |
| -0.1609594349140048 | 0.917 |
| -0.9718122762458637 | 0.918 |
| -0.9690422134456012 | 0.918 |
| 0.9919101595836279 | 0.918 |
| -0.8901645354966472 | 0.918 |
| -0.1672559382291243 | 0.918 |
| -0.42915495082813737 | 0.919 |
| 0.5569272324535413 | 0.919 |
| 0.019252272205140197 | 0.919 |
| 0.19190822047042047 | 0.919 |
| -0.07572817344653032 | 0.919 |
| -0.2165850234532814 | 0.92 |
| 0.8750462036541344 | 0.92 |
| -0.7227094239350232 | 0.92 |
| 0.6899040203661548 | 0.92 |
| -0.7984161184389545 | 0.92 |
| 0.08565172965331526 | 0.921 |
| -0.14404430181537048 | 0.921 |
| 0.22509636465030053 | 0.921 |
| -0.9998783609387688 | 0.921 |
| 0.7094967700526977 | 0.921 |
| -0.06093427396916977 | 0.922 |
| -0.9744073969704299 | 0.922 |
| 0.10469405975570112 | 0.922 |
| 0.31834531435568747 | 0.922 |
| -0.59349295180281 | 0.922 |
| 0.7906879503836781 | 0.923 |
| -0.6106568655930877 | 0.923 |
| -0.971143879747848 | 0.923 |
| 0.352530171316241 | 0.923 |
| 0.9676602041172937 | 0.923 |
| 0.9895219863234916 | 0.924 |
| -0.9280774721271298 | 0.924 |
| 0.992273321994382 | 0.924 |
| 0.5405184640348437 | 0.924 |
| 0.33921821711467237 | 0.924 |
| -0.8945463298813576 | 0.925 |
| -0.9878008003782324 | 0.925 |
| 0.9975125174824641 | 0.925 |
| 0.999811297828175 | 0.925 |
| 0.282736296860188 | 0.925 |
| -0.5778850940717019 | 0.926 |
| -0.7187766826712716 | 0.926 |
| -0.6420394506677345 | 0.926 |
| 0.8419524843909608 | 0.926 |
| 0.9316253886358752 | 0.926 |
| -0.8790527342650545 | 0.927 |
| 0.9906108953623102 | 0.927 |
| 0.931484358428065 | 0.927 |
| -0.7253968022261744 | 0.927 |
| 0.9999889501981925 | 0.927 |
| 0.8161352786857224 | 0.928 |
| -0.994914316868345 | 0.928 |
| 0.25540514588722885 | 0.928 |
| -0.9921396292276713 | 0.928 |
| -0.9546404805307329 | 0.928 |
| -0.6626281474021999 | 0.929 |
| 0.9745737038312355 | 0.929 |
| 0.9727934043703501 | 0.929 |
| -0.9073340087379922 | 0.929 |
| 0.4020525362664548 | 0.929 |
| -0.6176800905895595 | 0.93 |
| -0.6348282163191044 | 0.93 |
| -0.5064354336721624 | 0.93 |
| 0.979486472305093 | 0.93 |
| -0.9841384799420813 | 0.93 |
| 0.6451344935165677 | 0.931 |
| -0.3648236505824647 | 0.931 |
| 0.0011471408834280686 | 0.931 |
| 0.9867333573785694 | 0.931 |
| 0.9722867765341912 | 0.931 |
| 0.9395935996707668 | 0.932 |
| -0.4711292272462534 | 0.932 |
| 0.9990518571150894 | 0.932 |
| 0.9325193641886067 | 0.932 |
| 0.4828309038610818 | 0.932 |
| 0.9956152827811607 | 0.933 |
| 0.9919183830832714 | 0.933 |
| 0.9509009906014123 | 0.933 |
| -0.9977475364329251 | 0.933 |
| -0.067632095322654 | 0.933 |
| -0.7696593506120021 | 0.934 |
| -0.9782749001015965 | 0.934 |
| 0.2582284087937228 | 0.934 |
| -0.6669393627330519 | 0.934 |
| 0.8954916232197991 | 0.934 |
| -0.3167560470871228 | 0.935 |
| -0.597557471214443 | 0.935 |
| -0.08704364615179827 | 0.935 |
| 0.32544378720162126 | 0.935 |
| 0.8575809574232051 | 0.935 |
| -0.1852800560864533 | 0.936 |
| -0.997849623084309 | 0.936 |
| -0.9986446117267113 | 0.936 |
| 0.13815820891163796 | 0.936 |
| 0.9182629927966193 | 0.936 |
| -0.944484940948938 | 0.937 |
| 0.37688330649859747 | 0.937 |
| 0.8412543935804621 | 0.937 |
| -0.09819529022706235 | 0.937 |
| -0.9973487187608516 | 0.937 |
| 0.538449883714653 | 0.938 |
| 0.9995496201360649 | 0.938 |
| 0.9583343802968537 | 0.938 |
| 0.31336408379852365 | 0.938 |
| -0.41220189534996166 | 0.938 |
| -0.9936598381860645 | 0.939 |
| 0.9366168050850567 | 0.939 |
| -0.9926641746027259 | 0.939 |
| 0.9284174931434991 | 0.939 |
| 0.0642468390331324 | 0.939 |
| -0.7711033364922186 | 0.94 |
| -0.970057579783081 | 0.94 |
| 0.6384059068195411 | 0.94 |
| 0.9797765427003092 | 0.94 |
| 0.8878836820658541 | 0.94 |
| 0.4869894847299489 | 0.941 |
| 0.3767880529994419 | 0.941 |
| 0.5030864686925794 | 0.941 |
| 0.4268781755855692 | 0.941 |
| -0.982019709906359 | 0.941 |
| -0.38472889639156505 | 0.942 |
| 0.504368434813982 | 0.942 |
| -0.5859085253562094 | 0.942 |
| 0.20895752486161193 | 0.942 |
| -0.546931660800656 | 0.942 |
| -0.840658366589568 | 0.943 |
| -0.9224045215167604 | 0.943 |
| 0.6549275501978433 | 0.943 |
| -0.7081610398312967 | 0.943 |
| -0.6264328736651881 | 0.943 |
| 0.7846653202762074 | 0.944 |
| 0.15417611017435076 | 0.944 |
| 0.9852943039614991 | 0.944 |
| 0.7087386049106577 | 0.944 |
| 0.6404003135331356 | 0.944 |
| -0.39174260491700424 | 0.945 |
| 0.8836234778432298 | 0.945 |
| 0.7042832135224745 | 0.945 |
| -0.1057159333837804 | 0.945 |
| 0.8742510566288793 | 0.945 |
| 0.9970651526396203 | 0.946 |
| -0.04837204108542533 | 0.946 |
| 0.9643696525491943 | 0.946 |
| 0.6246612517603944 | 0.946 |
| -0.9980447374005148 | 0.946 |
| -0.3306859579678662 | 0.947 |
| 0.39717702508727826 | 0.947 |
| 0.9029091119612562 | 0.947 |
| 0.9231866531558865 | 0.947 |
| 0.8015780651406287 | 0.947 |
| 0.3440870276598001 | 0.948 |
| -0.6223390722282439 | 0.948 |
| -0.9307721217895264 | 0.948 |
| 0.1507752257209117 | 0.948 |
| -0.8623484483078478 | 0.948 |
| -0.4733293772522493 | 0.949 |
| 0.8120463382708815 | 0.949 |
| -0.955236477523398 | 0.949 |
| 0.9216861434312023 | 0.949 |
| -0.9978493648958724 | 0.949 |
| -0.9296281795208926 | 0.95 |
| 0.7697387235202042 | 0.95 |
| 0.2735501159459178 | 0.95 |
| 0.5619984192928886 | 0.95 |
| -0.5623313389298026 | 0.95 |
| -0.20952559384603092 | 0.951 |
| -0.7395310937591988 | 0.951 |
| -0.7243102576423585 | 0.951 |
| 0.5250738307888569 | 0.951 |
| -0.9998328951012764 | 0.951 |
| 0.6352646996508434 | 0.952 |
| 0.8925410444906656 | 0.952 |
| -0.2630769917469192 | 0.952 |
| 0.7032126715892788 | 0.952 |
| -0.9981830491708347 | 0.952 |
| 0.5322812504547545 | 0.953 |
| -0.36594824810630827 | 0.953 |
| 0.9061127349032874 | 0.953 |
| 0.12380712427728723 | 0.953 |
| 0.0024804172914740246 | 0.953 |
| -0.2031570493772728 | 0.954 |
| 0.9999143310307073 | 0.954 |
| 0.22696619072202712 | 0.954 |
| 0.05459291162549125 | 0.954 |
| 0.08894913796021416 | 0.954 |
| -0.8350470011091031 | 0.955 |
| 0.9663798840478877 | 0.955 |
| 0.5579114723504006 | 0.955 |
| 0.7972735207478355 | 0.955 |
| 0.2804188883975057 | 0.955 |
| -0.9974975958029599 | 0.956 |
| -0.709346985516118 | 0.956 |
| -0.08912944272173899 | 0.956 |
| 0.9989321458631052 | 0.956 |
| 0.09170318230722346 | 0.956 |
| 0.9639316800888402 | 0.957 |
| 0.4818761018766505 | 0.957 |
| 0.9567980746030976 | 0.957 |
| 0.2608241308240956 | 0.957 |
| -0.9966468810631867 | 0.957 |
| 0.07987625635504884 | 0.958 |
| 0.9990588507498657 | 0.958 |
| -0.19253730902557045 | 0.958 |
| -0.3899593182286264 | 0.958 |
| -0.8515929870782518 | 0.958 |
| -0.665157059267417 | 0.959 |
| -0.0812363157848206 | 0.959 |
| 0.9927310540092694 | 0.959 |
| -0.9986573672341957 | 0.959 |
| -0.4137691474682367 | 0.959 |
| 0.8683170649077528 | 0.96 |
| 0.972511003138737 | 0.96 |
| -0.9831135234549769 | 0.96 |
| -0.9908136629085139 | 0.96 |
| -0.9049913914931532 | 0.96 |
| 0.11748433385693834 | 0.961 |
| -0.6000066227858588 | 0.961 |
| -0.46946437016678816 | 0.961 |
| -0.3385377408331894 | 0.961 |
| 0.5271948998101939 | 0.961 |
| -0.7303942726678709 | 0.962 |
| 0.3951807138357366 | 0.962 |
| 0.948667608156967 | 0.962 |
| -0.021882509618005704 | 0.962 |
| 0.7348814565600333 | 0.962 |
| -0.07769777648776709 | 0.963 |
| -0.52324612424745 | 0.963 |
| -0.9972031367631025 | 0.963 |
| 0.9999780015251397 | 0.963 |
| 0.8531965550579331 | 0.963 |
| -0.21738628593842935 | 0.964 |
| 0.14646896244737906 | 0.964 |
| 0.9334967140394324 | 0.964 |
| 0.9998637937491331 | 0.964 |
| -0.9998636627161189 | 0.964 |
| 0.9814545144659157 | 0.965 |
| -0.662340771531196 | 0.965 |
| 0.803250361945432 | 0.965 |
| -0.9519686226594577 | 0.965 |
| -0.8812397911270823 | 0.965 |
| 0.7824999042630364 | 0.966 |
| 0.8298124779897207 | 0.966 |
| 0.5852699202490342 | 0.966 |
| -0.34435047837211985 | 0.966 |
| -0.29240872319971617 | 0.966 |
| 0.24662562394257131 | 0.967 |
| -0.6655898321723626 | 0.967 |
| 0.1446983050440818 | 0.967 |
| 0.9964146073124469 | 0.967 |
| -0.9021742729715045 | 0.967 |
| 0.14446678832852655 | 0.968 |
| -0.4043729134566688 | 0.968 |
| -0.9964455422979119 | 0.968 |
| -0.8288580696136447 | 0.968 |
| -0.18815082584740742 | 0.968 |
| 0.6737584516163184 | 0.969 |
| 0.6414086666194465 | 0.969 |
| 0.1755729695970085 | 0.969 |
| 0.5950316812834836 | 0.969 |
| -0.1923356348156232 | 0.969 |
| -0.23562463338972464 | 0.97 |
| 0.31369202110204525 | 0.97 |
| 0.3677406224130347 | 0.97 |
| -0.7060332300705913 | 0.97 |
| -0.9971271724786934 | 0.97 |
| 0.4701170678493795 | 0.971 |
| -0.899082909577354 | 0.971 |
| -0.8929077500269641 | 0.971 |
| 0.23574160295261667 | 0.971 |
| -0.8161044921655525 | 0.971 |
| 0.3308103728204216 | 0.972 |
| -0.6372374737296638 | 0.972 |
| 0.9621714458201324 | 0.972 |
| -0.5537983100210679 | 0.972 |
| -0.7580328763442826 | 0.972 |
| -0.2517048372042798 | 0.973 |
| -0.5415101064528611 | 0.973 |
| -0.6085163647355799 | 0.973 |
| -0.03453481123240474 | 0.973 |
| -0.9970824173676717 | 0.973 |
| 0.8753891876444261 | 0.974 |
| -0.8386669869099423 | 0.974 |
| -0.48920335096219497 | 0.974 |
| -0.6864766626086456 | 0.974 |
| -0.04977256029736464 | 0.974 |
| -0.6169152716554851 | 0.975 |
| -0.34365369352568415 | 0.975 |
| 0.5688359322653076 | 0.975 |
| -0.938701067697563 | 0.975 |
| -0.21282519925822752 | 0.975 |
| 0.9986040524539688 | 0.976 |
| -0.23346209402531004 | 0.976 |
| -0.9880060135681394 | 0.976 |
| -0.5949945431703464 | 0.976 |
| 0.9803453382875503 | 0.976 |
| -0.9897036271668491 | 0.977 |
| -0.8902497783086536 | 0.977 |
| 0.9865148651592976 | 0.977 |
| 0.6166374694190931 | 0.977 |
| 0.8663523354316478 | 0.977 |
| 0.9600058672153602 | 0.978 |
| -0.7634048646371876 | 0.978 |
| -0.9126720669468485 | 0.978 |
| 0.9694998345342382 | 0.978 |
| -0.5511781430127184 | 0.978 |
| -0.3439856837103682 | 0.979 |
| 0.8959239922562312 | 0.979 |
| -0.9684705393776213 | 0.979 |
| 0.9996954718035905 | 0.979 |
| 0.7483043158824233 | 0.979 |
| 0.33378559879653763 | 0.98 |
| 0.6744629592623097 | 0.98 |
| 0.787592938297096 | 0.98 |
| -0.4523629383126916 | 0.98 |
| 0.9316326642084113 | 0.98 |
| -0.9919642184497944 | 0.981 |
| -0.6563209358827596 | 0.981 |
| 0.9841222179926249 | 0.981 |
| 0.9073255447344369 | 0.981 |
| -0.7544140510610231 | 0.981 |
| -0.7746411354182944 | 0.982 |
| -0.2525155361237523 | 0.982 |
| 0.5358346597481541 | 0.982 |
| 0.8594517080694011 | 0.982 |
| 0.8340556915232209 | 0.982 |
| 0.39866012815187113 | 0.983 |
| -0.05184539590326622 | 0.983 |
| -0.5402339785367753 | 0.983 |
| -0.3046833507252188 | 0.983 |
| -0.782447569945945 | 0.983 |
| -0.35591006097437344 | 0.984 |
| -0.9130793132122783 | 0.984 |
| 0.06966625748564154 | 0.984 |
| 0.2783812748077069 | 0.984 |
| -0.6174354001283175 | 0.984 |
| 0.9711471766596006 | 0.985 |
| -0.021891247519092456 | 0.985 |
| -0.00657692339646024 | 0.985 |
| -0.22428099722646513 | 0.985 |
| -0.05521995221580477 | 0.985 |
| 0.7512403152553239 | 0.986 |
| -0.9724088443138107 | 0.986 |
| -0.0768578745548273 | 0.986 |
| -0.9682205426916632 | 0.986 |
| 0.9911304822119615 | 0.986 |
| -0.021806536528202396 | 0.987 |
| -0.580371297657763 | 0.987 |
| -0.5290953505538715 | 0.987 |
| 0.6968817176009899 | 0.987 |
| -0.8579434377632058 | 0.987 |
| -0.7015308986169124 | 0.988 |
| 0.854555133803053 | 0.988 |
| 0.043102849303933245 | 0.988 |
| -0.3014258495834206 | 0.988 |
| -0.9755810286646447 | 0.988 |
| 0.7340663729024279 | 0.989 |
| -0.923420103445786 | 0.989 |
| 0.9849415677758488 | 0.989 |
| 0.8334846679567515 | 0.989 |
| -0.04465400706225305 | 0.989 |
| -0.9815742434538689 | 0.99 |
| -0.0054358720978739524 | 0.99 |
| 0.7742080816432361 | 0.99 |
| 0.33788669983174074 | 0.99 |
| -0.9585996194324063 | 0.99 |
| -0.6312818106741045 | 0.991 |
| 0.8786672007236087 | 0.991 |
| -0.2559785307438632 | 0.991 |
| -0.6061382187769071 | 0.991 |
| -0.7291807563175636 | 0.991 |
| 0.9720933425237676 | 0.992 |
| 0.2975065684043064 | 0.992 |
| -0.9999194986013971 | 0.992 |
| 0.8704763820518032 | 0.992 |
| 0.8963054877322394 | 0.992 |
| -0.9903428816725679 | 0.993 |
| -0.9898777060529156 | 0.993 |
| 0.22413513342288113 | 0.993 |
| 0.684771315328439 | 0.993 |
| 0.46220479096423417 | 0.993 |
| -0.8504645067319286 | 0.994 |
| 0.9299939806113146 | 0.994 |
| 0.7821668001306592 | 0.994 |
| -0.4501135866584411 | 0.994 |
| -0.9954772869584004 | 0.994 |
| 0.30854375414194823 | 0.995 |
| -0.15316763308789036 | 0.995 |
| 0.23047346016673087 | 0.995 |
| 0.473052595829571 | 0.995 |
| 0.7700604557089454 | 0.995 |
| 0.3979824828982173 | 0.996 |
| -0.7364211974944371 | 0.996 |
| 0.9783980911554481 | 0.996 |
| -0.9986941308861306 | 0.996 |
| 0.00147875465105032 | 0.996 |
| 0.9958584050572634 | 0.997 |
| -0.9434699271352458 | 0.997 |
| 0.3964503415718374 | 0.997 |
| -0.8920081820098688 | 0.997 |
| 0.6607324117988436 | 0.997 |
| 0.8283576190203362 | 0.998 |
| 0.48472130467725844 | 0.998 |
| 0.964266401638421 | 0.998 |
| -0.17733649828051748 | 0.998 |
| 0.9999875975612752 | 0.998 |
| -0.9479890325048023 | 0.999 |
| -0.18711401340865508 | 0.999 |
| -0.978926563701464 | 0.999 |
| 0.9989845454050945 | 0.999 |
| 0.20362635885272704 | 0.999 |
| 0.6992200072275639 | 1 |
| 0.40436305293807495 | 1 |
| -0.9988798265580314 | 1 |